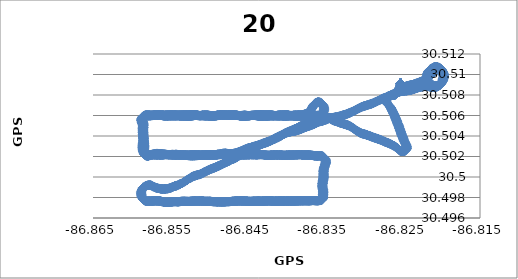
| Category | GPS Long |
|---|---|
| -86.825264 | 30.509 |
| -86.825264 | 30.509 |
| -86.825264 | 30.509 |
| -86.825264 | 30.509 |
| -86.825264 | 30.509 |
| -86.825264 | 30.509 |
| -86.825264 | 30.509 |
| -86.825264 | 30.509 |
| -86.825264 | 30.509 |
| -86.825264 | 30.509 |
| -86.825264 | 30.509 |
| -86.825264 | 30.509 |
| -86.825264 | 30.509 |
| -86.825264 | 30.509 |
| -86.825264 | 30.509 |
| -86.825264 | 30.509 |
| -86.825264 | 30.509 |
| -86.825264 | 30.509 |
| -86.825264 | 30.509 |
| -86.825264 | 30.509 |
| -86.825264 | 30.509 |
| -86.825264 | 30.509 |
| -86.825264 | 30.509 |
| -86.825264 | 30.509 |
| -86.825264 | 30.509 |
| -86.825264 | 30.509 |
| -86.825264 | 30.509 |
| -86.825264 | 30.509 |
| -86.825264 | 30.509 |
| -86.825264 | 30.509 |
| -86.825264 | 30.509 |
| -86.825264 | 30.509 |
| -86.825264 | 30.509 |
| -86.825264 | 30.509 |
| -86.825264 | 30.509 |
| -86.825264 | 30.509 |
| -86.825264 | 30.509 |
| -86.825264 | 30.509 |
| -86.825264 | 30.509 |
| -86.825264 | 30.509 |
| -86.825264 | 30.509 |
| -86.825264 | 30.509 |
| -86.825264 | 30.509 |
| -86.825264 | 30.509 |
| -86.825264 | 30.509 |
| -86.825264 | 30.509 |
| -86.825264 | 30.509 |
| -86.825264 | 30.509 |
| -86.825264 | 30.509 |
| -86.825264 | 30.509 |
| -86.825264 | 30.509 |
| -86.825264 | 30.509 |
| -86.825264 | 30.509 |
| -86.825264 | 30.509 |
| -86.825264 | 30.509 |
| -86.825264 | 30.509 |
| -86.825264 | 30.509 |
| -86.825264 | 30.509 |
| -86.825264 | 30.509 |
| -86.825264 | 30.509 |
| -86.825264 | 30.509 |
| -86.825264 | 30.509 |
| -86.825264 | 30.509 |
| -86.825264 | 30.509 |
| -86.825264 | 30.509 |
| -86.825264 | 30.509 |
| -86.825264 | 30.509 |
| -86.825264 | 30.509 |
| -86.825264 | 30.509 |
| -86.825264 | 30.509 |
| -86.825264 | 30.509 |
| -86.825264 | 30.509 |
| -86.825264 | 30.509 |
| -86.825264 | 30.509 |
| -86.825264 | 30.509 |
| -86.825264 | 30.509 |
| -86.825264 | 30.509 |
| -86.825264 | 30.509 |
| -86.825264 | 30.509 |
| -86.825264 | 30.509 |
| -86.825264 | 30.509 |
| -86.825264 | 30.509 |
| -86.825264 | 30.509 |
| -86.825279 | 30.509 |
| -86.825279 | 30.509 |
| -86.825279 | 30.509 |
| -86.825279 | 30.509 |
| -86.825279 | 30.509 |
| -86.825279 | 30.509 |
| -86.825279 | 30.509 |
| -86.825279 | 30.509 |
| -86.825279 | 30.509 |
| -86.825264 | 30.509 |
| -86.825264 | 30.509 |
| -86.825264 | 30.509 |
| -86.825264 | 30.509 |
| -86.825264 | 30.509 |
| -86.825264 | 30.509 |
| -86.825264 | 30.509 |
| -86.825264 | 30.509 |
| -86.825264 | 30.509 |
| -86.825264 | 30.509 |
| -86.825264 | 30.509 |
| -86.825264 | 30.509 |
| -86.825264 | 30.509 |
| -86.825264 | 30.509 |
| -86.825264 | 30.509 |
| -86.825264 | 30.509 |
| -86.825264 | 30.509 |
| -86.825264 | 30.509 |
| -86.825264 | 30.509 |
| -86.825264 | 30.509 |
| -86.825264 | 30.509 |
| -86.825264 | 30.509 |
| -86.825264 | 30.509 |
| -86.825264 | 30.509 |
| -86.825264 | 30.509 |
| -86.825264 | 30.509 |
| -86.825264 | 30.509 |
| -86.825264 | 30.509 |
| -86.825264 | 30.509 |
| -86.825264 | 30.509 |
| -86.825264 | 30.509 |
| -86.825264 | 30.509 |
| -86.825264 | 30.509 |
| -86.825264 | 30.509 |
| -86.825264 | 30.509 |
| -86.825264 | 30.509 |
| -86.825264 | 30.509 |
| -86.825264 | 30.509 |
| -86.825264 | 30.509 |
| -86.825264 | 30.509 |
| -86.825264 | 30.509 |
| -86.825264 | 30.509 |
| -86.825264 | 30.509 |
| -86.825264 | 30.509 |
| -86.825264 | 30.509 |
| -86.825264 | 30.509 |
| -86.825264 | 30.509 |
| -86.825264 | 30.509 |
| -86.825264 | 30.509 |
| -86.825264 | 30.509 |
| -86.825264 | 30.509 |
| -86.825264 | 30.509 |
| -86.825264 | 30.509 |
| -86.825264 | 30.509 |
| -86.825264 | 30.509 |
| -86.825264 | 30.509 |
| -86.825264 | 30.509 |
| -86.825264 | 30.509 |
| -86.825264 | 30.509 |
| -86.825264 | 30.509 |
| -86.825264 | 30.509 |
| -86.825264 | 30.509 |
| -86.825264 | 30.509 |
| -86.825264 | 30.509 |
| -86.825264 | 30.509 |
| -86.825264 | 30.509 |
| -86.825264 | 30.509 |
| -86.825264 | 30.509 |
| -86.825264 | 30.509 |
| -86.825264 | 30.509 |
| -86.825264 | 30.509 |
| -86.825264 | 30.509 |
| -86.825264 | 30.509 |
| -86.825264 | 30.509 |
| -86.825264 | 30.509 |
| -86.825264 | 30.509 |
| -86.825264 | 30.509 |
| -86.825264 | 30.509 |
| -86.825264 | 30.509 |
| -86.825264 | 30.509 |
| -86.825264 | 30.509 |
| -86.825264 | 30.509 |
| -86.825264 | 30.509 |
| -86.825264 | 30.509 |
| -86.825264 | 30.509 |
| -86.825264 | 30.509 |
| -86.825264 | 30.509 |
| -86.825264 | 30.509 |
| -86.825264 | 30.509 |
| -86.825264 | 30.509 |
| -86.825264 | 30.509 |
| -86.825264 | 30.509 |
| -86.825264 | 30.509 |
| -86.825264 | 30.509 |
| -86.825264 | 30.509 |
| -86.825249 | 30.509 |
| -86.825249 | 30.509 |
| -86.825249 | 30.509 |
| -86.825249 | 30.509 |
| -86.825249 | 30.509 |
| -86.825249 | 30.509 |
| -86.825249 | 30.509 |
| -86.825249 | 30.509 |
| -86.825249 | 30.509 |
| -86.825249 | 30.509 |
| -86.825249 | 30.509 |
| -86.825249 | 30.509 |
| -86.825249 | 30.509 |
| -86.825249 | 30.509 |
| -86.825249 | 30.509 |
| -86.825249 | 30.509 |
| -86.825249 | 30.509 |
| -86.825249 | 30.509 |
| -86.825249 | 30.509 |
| -86.825249 | 30.509 |
| -86.825249 | 30.509 |
| -86.825249 | 30.509 |
| -86.825249 | 30.509 |
| -86.825249 | 30.509 |
| -86.825249 | 30.509 |
| -86.825249 | 30.509 |
| -86.825249 | 30.509 |
| -86.825249 | 30.509 |
| -86.825249 | 30.509 |
| -86.825249 | 30.509 |
| -86.825249 | 30.509 |
| -86.825249 | 30.509 |
| -86.825249 | 30.509 |
| -86.825249 | 30.509 |
| -86.825249 | 30.509 |
| -86.825249 | 30.509 |
| -86.825249 | 30.509 |
| -86.825249 | 30.509 |
| -86.825249 | 30.509 |
| -86.825249 | 30.509 |
| -86.825249 | 30.509 |
| -86.825249 | 30.509 |
| -86.825249 | 30.509 |
| -86.825249 | 30.509 |
| -86.825249 | 30.509 |
| -86.825249 | 30.509 |
| -86.825249 | 30.509 |
| -86.825249 | 30.509 |
| -86.825249 | 30.509 |
| -86.825249 | 30.509 |
| -86.825249 | 30.509 |
| -86.825249 | 30.509 |
| -86.825249 | 30.509 |
| -86.825249 | 30.509 |
| -86.825249 | 30.509 |
| -86.825249 | 30.509 |
| -86.825249 | 30.509 |
| -86.825249 | 30.509 |
| -86.825249 | 30.509 |
| -86.825249 | 30.509 |
| -86.825249 | 30.509 |
| -86.825249 | 30.509 |
| -86.825279 | 30.509 |
| -86.825279 | 30.509 |
| -86.825279 | 30.509 |
| -86.825294 | 30.509 |
| -86.825294 | 30.509 |
| -86.825294 | 30.509 |
| -86.825325 | 30.509 |
| -86.825325 | 30.509 |
| -86.825356 | 30.509 |
| -86.825356 | 30.509 |
| -86.825386 | 30.509 |
| -86.825386 | 30.509 |
| -86.825417 | 30.509 |
| -86.825417 | 30.509 |
| -86.825447 | 30.509 |
| -86.825455 | 30.509 |
| -86.825493 | 30.509 |
| -86.825493 | 30.509 |
| -86.825523 | 30.508 |
| -86.825523 | 30.508 |
| -86.825569 | 30.508 |
| -86.825569 | 30.508 |
| -86.825569 | 30.508 |
| -86.825623 | 30.508 |
| -86.825623 | 30.508 |
| -86.825668 | 30.508 |
| -86.825668 | 30.508 |
| -86.825699 | 30.508 |
| -86.825699 | 30.508 |
| -86.825745 | 30.508 |
| -86.825745 | 30.508 |
| -86.825798 | 30.508 |
| -86.825798 | 30.508 |
| -86.825844 | 30.508 |
| -86.825844 | 30.508 |
| -86.825874 | 30.508 |
| -86.825874 | 30.508 |
| -86.825928 | 30.508 |
| -86.825928 | 30.508 |
| -86.825981 | 30.508 |
| -86.825981 | 30.508 |
| -86.826035 | 30.508 |
| -86.826035 | 30.508 |
| -86.826096 | 30.508 |
| -86.826096 | 30.508 |
| -86.826157 | 30.508 |
| -86.826157 | 30.508 |
| -86.826233 | 30.508 |
| -86.826233 | 30.508 |
| -86.826363 | 30.508 |
| -86.826363 | 30.508 |
| -86.826393 | 30.508 |
| -86.826393 | 30.508 |
| -86.826454 | 30.508 |
| -86.826454 | 30.508 |
| -86.826546 | 30.508 |
| -86.826576 | 30.508 |
| -86.826576 | 30.508 |
| -86.826607 | 30.508 |
| -86.826714 | 30.508 |
| -86.826714 | 30.508 |
| -86.826775 | 30.508 |
| -86.826782 | 30.508 |
| -86.826836 | 30.508 |
| -86.826836 | 30.508 |
| -86.826881 | 30.508 |
| -86.826889 | 30.508 |
| -86.826927 | 30.508 |
| -86.826927 | 30.508 |
| -86.826958 | 30.508 |
| -86.826958 | 30.508 |
| -86.826958 | 30.508 |
| -86.826988 | 30.508 |
| -86.826988 | 30.508 |
| -86.827019 | 30.508 |
| -86.827019 | 30.508 |
| -86.827049 | 30.508 |
| -86.827049 | 30.508 |
| -86.82708 | 30.508 |
| -86.82708 | 30.508 |
| -86.827095 | 30.508 |
| -86.827095 | 30.508 |
| -86.82711 | 30.507 |
| -86.82711 | 30.507 |
| -86.82711 | 30.507 |
| -86.82711 | 30.507 |
| -86.827095 | 30.507 |
| -86.827095 | 30.507 |
| -86.827065 | 30.507 |
| -86.827065 | 30.507 |
| -86.827011 | 30.507 |
| -86.827011 | 30.507 |
| -86.826973 | 30.507 |
| -86.826973 | 30.507 |
| -86.826912 | 30.507 |
| -86.826912 | 30.507 |
| -86.826859 | 30.507 |
| -86.826859 | 30.507 |
| -86.82679 | 30.507 |
| -86.82679 | 30.507 |
| -86.826729 | 30.507 |
| -86.826729 | 30.507 |
| -86.826729 | 30.507 |
| -86.826683 | 30.507 |
| -86.826637 | 30.507 |
| -86.826637 | 30.507 |
| -86.826637 | 30.507 |
| -86.826591 | 30.507 |
| -86.826546 | 30.507 |
| -86.826546 | 30.507 |
| -86.826546 | 30.507 |
| -86.826515 | 30.507 |
| -86.826515 | 30.507 |
| -86.826515 | 30.507 |
| -86.826469 | 30.507 |
| -86.826469 | 30.507 |
| -86.826439 | 30.507 |
| -86.826439 | 30.507 |
| -86.826408 | 30.507 |
| -86.826408 | 30.507 |
| -86.826363 | 30.506 |
| -86.826363 | 30.506 |
| -86.826332 | 30.506 |
| -86.826332 | 30.506 |
| -86.826332 | 30.506 |
| -86.826294 | 30.506 |
| -86.826294 | 30.506 |
| -86.826256 | 30.506 |
| -86.826256 | 30.506 |
| -86.826225 | 30.506 |
| -86.826225 | 30.506 |
| -86.826195 | 30.506 |
| -86.826195 | 30.506 |
| -86.826195 | 30.506 |
| -86.826164 | 30.506 |
| -86.826164 | 30.506 |
| -86.826118 | 30.506 |
| -86.826118 | 30.506 |
| -86.826088 | 30.506 |
| -86.826088 | 30.506 |
| -86.826057 | 30.506 |
| -86.826057 | 30.506 |
| -86.826027 | 30.506 |
| -86.826027 | 30.506 |
| -86.825996 | 30.506 |
| -86.825996 | 30.506 |
| -86.825966 | 30.506 |
| -86.825966 | 30.506 |
| -86.825935 | 30.506 |
| -86.825935 | 30.506 |
| -86.82592 | 30.506 |
| -86.82592 | 30.506 |
| -86.82589 | 30.506 |
| -86.82589 | 30.506 |
| -86.825859 | 30.506 |
| -86.825859 | 30.506 |
| -86.825829 | 30.506 |
| -86.825829 | 30.506 |
| -86.825798 | 30.506 |
| -86.825798 | 30.506 |
| -86.825768 | 30.505 |
| -86.825768 | 30.505 |
| -86.825752 | 30.505 |
| -86.825752 | 30.505 |
| -86.825722 | 30.505 |
| -86.825722 | 30.505 |
| -86.825706 | 30.505 |
| -86.825706 | 30.505 |
| -86.825676 | 30.505 |
| -86.825676 | 30.505 |
| -86.825645 | 30.505 |
| -86.825645 | 30.505 |
| -86.8256 | 30.505 |
| -86.8256 | 30.505 |
| -86.8256 | 30.505 |
| -86.825569 | 30.505 |
| -86.825569 | 30.505 |
| -86.825569 | 30.505 |
| -86.825539 | 30.505 |
| -86.825539 | 30.505 |
| -86.825523 | 30.505 |
| -86.825523 | 30.505 |
| -86.825493 | 30.505 |
| -86.825493 | 30.505 |
| -86.825462 | 30.505 |
| -86.825462 | 30.505 |
| -86.825447 | 30.505 |
| -86.825447 | 30.505 |
| -86.825417 | 30.505 |
| -86.825417 | 30.505 |
| -86.825417 | 30.505 |
| -86.825417 | 30.505 |
| -86.825401 | 30.505 |
| -86.825401 | 30.505 |
| -86.825371 | 30.505 |
| -86.825371 | 30.505 |
| -86.82534 | 30.505 |
| -86.82534 | 30.505 |
| -86.825325 | 30.505 |
| -86.825325 | 30.505 |
| -86.825294 | 30.505 |
| -86.825294 | 30.505 |
| -86.825264 | 30.504 |
| -86.825264 | 30.504 |
| -86.825249 | 30.504 |
| -86.825249 | 30.504 |
| -86.825249 | 30.504 |
| -86.825218 | 30.504 |
| -86.825218 | 30.504 |
| -86.825172 | 30.504 |
| -86.825172 | 30.504 |
| -86.825172 | 30.504 |
| -86.825172 | 30.504 |
| -86.825157 | 30.504 |
| -86.825157 | 30.504 |
| -86.825127 | 30.504 |
| -86.825127 | 30.504 |
| -86.825096 | 30.504 |
| -86.825096 | 30.504 |
| -86.825081 | 30.504 |
| -86.825081 | 30.504 |
| -86.82505 | 30.504 |
| -86.82505 | 30.504 |
| -86.825005 | 30.504 |
| -86.825005 | 30.504 |
| -86.825005 | 30.504 |
| -86.825005 | 30.504 |
| -86.824974 | 30.504 |
| -86.824974 | 30.504 |
| -86.824959 | 30.504 |
| -86.824959 | 30.504 |
| -86.824928 | 30.504 |
| -86.824928 | 30.504 |
| -86.824898 | 30.504 |
| -86.824898 | 30.504 |
| -86.824883 | 30.504 |
| -86.824883 | 30.504 |
| -86.824852 | 30.504 |
| -86.824852 | 30.504 |
| -86.824821 | 30.504 |
| -86.824821 | 30.504 |
| -86.824791 | 30.504 |
| -86.82476 | 30.503 |
| -86.82476 | 30.503 |
| -86.82473 | 30.503 |
| -86.82473 | 30.503 |
| -86.824699 | 30.503 |
| -86.824699 | 30.503 |
| -86.824654 | 30.503 |
| -86.824654 | 30.503 |
| -86.824623 | 30.503 |
| -86.824623 | 30.503 |
| -86.824593 | 30.503 |
| -86.824593 | 30.503 |
| -86.824562 | 30.503 |
| -86.824562 | 30.503 |
| -86.824532 | 30.503 |
| -86.824532 | 30.503 |
| -86.824516 | 30.503 |
| -86.824501 | 30.503 |
| -86.824501 | 30.503 |
| -86.824501 | 30.503 |
| -86.824501 | 30.503 |
| -86.824501 | 30.503 |
| -86.824486 | 30.503 |
| -86.824486 | 30.503 |
| -86.824486 | 30.503 |
| -86.824486 | 30.503 |
| -86.824501 | 30.503 |
| -86.824501 | 30.503 |
| -86.824501 | 30.503 |
| -86.824501 | 30.503 |
| -86.824539 | 30.503 |
| -86.824539 | 30.503 |
| -86.82457 | 30.503 |
| -86.824615 | 30.503 |
| -86.824615 | 30.503 |
| -86.824669 | 30.503 |
| -86.824669 | 30.503 |
| -86.824738 | 30.503 |
| -86.824738 | 30.503 |
| -86.824791 | 30.503 |
| -86.824791 | 30.503 |
| -86.824791 | 30.503 |
| -86.824883 | 30.502 |
| -86.82489 | 30.502 |
| -86.824951 | 30.502 |
| -86.824951 | 30.502 |
| -86.825027 | 30.502 |
| -86.825027 | 30.502 |
| -86.825027 | 30.502 |
| -86.825089 | 30.502 |
| -86.825218 | 30.503 |
| -86.825218 | 30.503 |
| -86.825249 | 30.503 |
| -86.825249 | 30.503 |
| -86.825348 | 30.503 |
| -86.825348 | 30.503 |
| -86.825401 | 30.503 |
| -86.825401 | 30.503 |
| -86.825478 | 30.503 |
| -86.825478 | 30.503 |
| -86.825539 | 30.503 |
| -86.825539 | 30.503 |
| -86.825539 | 30.503 |
| -86.825645 | 30.503 |
| -86.825653 | 30.503 |
| -86.825722 | 30.503 |
| -86.825798 | 30.503 |
| -86.825798 | 30.503 |
| -86.825798 | 30.503 |
| -86.825874 | 30.503 |
| -86.825882 | 30.503 |
| -86.825958 | 30.503 |
| -86.825958 | 30.503 |
| -86.825958 | 30.503 |
| -86.826042 | 30.503 |
| -86.826042 | 30.503 |
| -86.826111 | 30.503 |
| -86.826111 | 30.503 |
| -86.826202 | 30.503 |
| -86.826202 | 30.503 |
| -86.826294 | 30.503 |
| -86.826363 | 30.503 |
| -86.826363 | 30.503 |
| -86.826454 | 30.503 |
| -86.826454 | 30.503 |
| -86.82653 | 30.503 |
| -86.82653 | 30.503 |
| -86.826645 | 30.503 |
| -86.826645 | 30.503 |
| -86.826721 | 30.503 |
| -86.826721 | 30.503 |
| -86.826797 | 30.503 |
| -86.826797 | 30.503 |
| -86.826889 | 30.503 |
| -86.826897 | 30.503 |
| -86.826965 | 30.503 |
| -86.826965 | 30.503 |
| -86.82708 | 30.503 |
| -86.82708 | 30.503 |
| -86.827156 | 30.503 |
| -86.827156 | 30.503 |
| -86.827232 | 30.503 |
| -86.827232 | 30.503 |
| -86.827232 | 30.503 |
| -86.827309 | 30.503 |
| -86.827309 | 30.503 |
| -86.827309 | 30.503 |
| -86.827408 | 30.503 |
| -86.827408 | 30.503 |
| -86.827461 | 30.503 |
| -86.82756 | 30.504 |
| -86.82756 | 30.504 |
| -86.827652 | 30.504 |
| -86.827652 | 30.504 |
| -86.827728 | 30.504 |
| -86.827728 | 30.504 |
| -86.827805 | 30.504 |
| -86.827805 | 30.504 |
| -86.827919 | 30.504 |
| -86.827919 | 30.504 |
| -86.827972 | 30.504 |
| -86.827972 | 30.504 |
| -86.828087 | 30.504 |
| -86.828087 | 30.504 |
| -86.828178 | 30.504 |
| -86.828178 | 30.504 |
| -86.828178 | 30.504 |
| -86.82827 | 30.504 |
| -86.82827 | 30.504 |
| -86.828384 | 30.504 |
| -86.828384 | 30.504 |
| -86.828476 | 30.504 |
| -86.828476 | 30.504 |
| -86.828568 | 30.504 |
| -86.828568 | 30.504 |
| -86.828659 | 30.504 |
| -86.828667 | 30.504 |
| -86.828758 | 30.504 |
| -86.828758 | 30.504 |
| -86.82885 | 30.504 |
| -86.82885 | 30.504 |
| -86.828941 | 30.504 |
| -86.828941 | 30.504 |
| -86.829018 | 30.504 |
| -86.829018 | 30.504 |
| -86.829018 | 30.504 |
| -86.829109 | 30.504 |
| -86.829132 | 30.504 |
| -86.829185 | 30.504 |
| -86.829185 | 30.504 |
| -86.829262 | 30.504 |
| -86.829262 | 30.504 |
| -86.829338 | 30.504 |
| -86.829338 | 30.504 |
| -86.829414 | 30.504 |
| -86.829414 | 30.504 |
| -86.829506 | 30.504 |
| -86.829582 | 30.504 |
| -86.829582 | 30.504 |
| -86.829605 | 30.504 |
| -86.829605 | 30.504 |
| -86.829659 | 30.504 |
| -86.829659 | 30.504 |
| -86.829742 | 30.504 |
| -86.829742 | 30.504 |
| -86.829826 | 30.504 |
| -86.829826 | 30.504 |
| -86.82991 | 30.504 |
| -86.82991 | 30.504 |
| -86.829987 | 30.504 |
| -86.829987 | 30.504 |
| -86.830063 | 30.504 |
| -86.830063 | 30.504 |
| -86.830139 | 30.504 |
| -86.830139 | 30.504 |
| -86.830208 | 30.504 |
| -86.830208 | 30.504 |
| -86.830208 | 30.504 |
| -86.830292 | 30.504 |
| -86.83036 | 30.504 |
| -86.83036 | 30.504 |
| -86.83036 | 30.504 |
| -86.830444 | 30.504 |
| -86.830444 | 30.504 |
| -86.830521 | 30.504 |
| -86.830521 | 30.504 |
| -86.830566 | 30.504 |
| -86.830566 | 30.504 |
| -86.830635 | 30.504 |
| -86.830635 | 30.504 |
| -86.830696 | 30.504 |
| -86.830696 | 30.504 |
| -86.830757 | 30.504 |
| -86.830788 | 30.504 |
| -86.830818 | 30.504 |
| -86.830818 | 30.504 |
| -86.830879 | 30.504 |
| -86.830879 | 30.504 |
| -86.830879 | 30.504 |
| -86.83094 | 30.505 |
| -86.830971 | 30.505 |
| -86.831001 | 30.505 |
| -86.831001 | 30.505 |
| -86.831078 | 30.505 |
| -86.831078 | 30.505 |
| -86.831123 | 30.505 |
| -86.831131 | 30.505 |
| -86.831184 | 30.505 |
| -86.831184 | 30.505 |
| -86.831184 | 30.505 |
| -86.831261 | 30.505 |
| -86.831261 | 30.505 |
| -86.831314 | 30.505 |
| -86.831314 | 30.505 |
| -86.831375 | 30.505 |
| -86.831375 | 30.505 |
| -86.831444 | 30.505 |
| -86.831444 | 30.505 |
| -86.831505 | 30.505 |
| -86.831505 | 30.505 |
| -86.831573 | 30.505 |
| -86.831573 | 30.505 |
| -86.831635 | 30.505 |
| -86.831635 | 30.505 |
| -86.831696 | 30.505 |
| -86.831696 | 30.505 |
| -86.831757 | 30.505 |
| -86.831757 | 30.505 |
| -86.831825 | 30.505 |
| -86.831825 | 30.505 |
| -86.831886 | 30.505 |
| -86.831886 | 30.505 |
| -86.831947 | 30.505 |
| -86.831947 | 30.505 |
| -86.832039 | 30.505 |
| -86.832039 | 30.505 |
| -86.832085 | 30.505 |
| -86.83213 | 30.505 |
| -86.832161 | 30.505 |
| -86.832161 | 30.505 |
| -86.832222 | 30.505 |
| -86.832222 | 30.505 |
| -86.832298 | 30.505 |
| -86.832298 | 30.505 |
| -86.832375 | 30.505 |
| -86.832375 | 30.505 |
| -86.832375 | 30.505 |
| -86.832375 | 30.505 |
| -86.832466 | 30.505 |
| -86.832466 | 30.505 |
| -86.832542 | 30.505 |
| -86.832542 | 30.505 |
| -86.832603 | 30.505 |
| -86.832603 | 30.505 |
| -86.83268 | 30.505 |
| -86.83268 | 30.505 |
| -86.832756 | 30.505 |
| -86.832764 | 30.505 |
| -86.832817 | 30.505 |
| -86.832817 | 30.505 |
| -86.832817 | 30.505 |
| -86.832901 | 30.505 |
| -86.832901 | 30.505 |
| -86.832901 | 30.505 |
| -86.832962 | 30.505 |
| -86.832962 | 30.505 |
| -86.833038 | 30.505 |
| -86.833038 | 30.505 |
| -86.833099 | 30.505 |
| -86.833099 | 30.505 |
| -86.833191 | 30.505 |
| -86.833191 | 30.505 |
| -86.833244 | 30.505 |
| -86.833244 | 30.505 |
| -86.833321 | 30.505 |
| -86.833321 | 30.505 |
| -86.833405 | 30.505 |
| -86.833466 | 30.505 |
| -86.833466 | 30.505 |
| -86.833488 | 30.505 |
| -86.833488 | 30.505 |
| -86.833542 | 30.505 |
| -86.833542 | 30.505 |
| -86.833633 | 30.505 |
| -86.833633 | 30.505 |
| -86.833733 | 30.505 |
| -86.833733 | 30.505 |
| -86.833778 | 30.505 |
| -86.833778 | 30.505 |
| -86.833885 | 30.506 |
| -86.833885 | 30.506 |
| -86.833885 | 30.506 |
| -86.833946 | 30.506 |
| -86.833946 | 30.506 |
| -86.834023 | 30.506 |
| -86.834023 | 30.506 |
| -86.834084 | 30.506 |
| -86.834091 | 30.506 |
| -86.834091 | 30.506 |
| -86.834145 | 30.506 |
| -86.834145 | 30.506 |
| -86.834213 | 30.506 |
| -86.834213 | 30.506 |
| -86.834282 | 30.506 |
| -86.834282 | 30.506 |
| -86.834358 | 30.506 |
| -86.834358 | 30.506 |
| -86.834435 | 30.506 |
| -86.834435 | 30.506 |
| -86.834518 | 30.506 |
| -86.834579 | 30.506 |
| -86.834579 | 30.506 |
| -86.834579 | 30.506 |
| -86.834579 | 30.506 |
| -86.834709 | 30.506 |
| -86.834709 | 30.506 |
| -86.83474 | 30.506 |
| -86.83474 | 30.506 |
| -86.834816 | 30.506 |
| -86.834816 | 30.506 |
| -86.834892 | 30.506 |
| -86.834892 | 30.506 |
| -86.835007 | 30.506 |
| -86.835007 | 30.506 |
| -86.835075 | 30.506 |
| -86.835075 | 30.506 |
| -86.835152 | 30.506 |
| -86.835152 | 30.506 |
| -86.835228 | 30.506 |
| -86.835228 | 30.506 |
| -86.835304 | 30.506 |
| -86.835304 | 30.506 |
| -86.835381 | 30.506 |
| -86.835381 | 30.506 |
| -86.835457 | 30.506 |
| -86.835457 | 30.506 |
| -86.835457 | 30.506 |
| -86.835518 | 30.506 |
| -86.835518 | 30.506 |
| -86.835594 | 30.506 |
| -86.835594 | 30.506 |
| -86.83567 | 30.506 |
| -86.835732 | 30.506 |
| -86.835732 | 30.506 |
| -86.835732 | 30.506 |
| -86.835732 | 30.506 |
| -86.835815 | 30.506 |
| -86.835815 | 30.506 |
| -86.835892 | 30.506 |
| -86.835892 | 30.506 |
| -86.835968 | 30.506 |
| -86.835968 | 30.506 |
| -86.836044 | 30.506 |
| -86.836044 | 30.506 |
| -86.836105 | 30.506 |
| -86.836105 | 30.506 |
| -86.836182 | 30.506 |
| -86.836182 | 30.506 |
| -86.836273 | 30.506 |
| -86.836327 | 30.506 |
| -86.836327 | 30.506 |
| -86.836403 | 30.506 |
| -86.836403 | 30.506 |
| -86.836472 | 30.506 |
| -86.836472 | 30.506 |
| -86.83654 | 30.506 |
| -86.83654 | 30.506 |
| -86.836617 | 30.506 |
| -86.836617 | 30.506 |
| -86.836617 | 30.506 |
| -86.836617 | 30.506 |
| -86.836731 | 30.506 |
| -86.836731 | 30.506 |
| -86.836784 | 30.506 |
| -86.836784 | 30.506 |
| -86.836853 | 30.506 |
| -86.836853 | 30.506 |
| -86.836937 | 30.506 |
| -86.836937 | 30.506 |
| -86.837013 | 30.506 |
| -86.837021 | 30.506 |
| -86.83709 | 30.506 |
| -86.83709 | 30.506 |
| -86.837166 | 30.506 |
| -86.837166 | 30.506 |
| -86.837166 | 30.506 |
| -86.83725 | 30.506 |
| -86.83725 | 30.506 |
| -86.837364 | 30.506 |
| -86.837364 | 30.506 |
| -86.837509 | 30.506 |
| -86.837509 | 30.506 |
| -86.837608 | 30.506 |
| -86.837608 | 30.506 |
| -86.837685 | 30.506 |
| -86.837685 | 30.506 |
| -86.837761 | 30.506 |
| -86.837761 | 30.506 |
| -86.837852 | 30.506 |
| -86.837852 | 30.506 |
| -86.837914 | 30.506 |
| -86.837914 | 30.506 |
| -86.837982 | 30.506 |
| -86.837982 | 30.506 |
| -86.838051 | 30.506 |
| -86.838051 | 30.506 |
| -86.838112 | 30.506 |
| -86.838112 | 30.506 |
| -86.838188 | 30.506 |
| -86.838188 | 30.506 |
| -86.838264 | 30.506 |
| -86.838264 | 30.506 |
| -86.838333 | 30.506 |
| -86.838333 | 30.506 |
| -86.838402 | 30.506 |
| -86.838402 | 30.506 |
| -86.83847 | 30.506 |
| -86.83847 | 30.506 |
| -86.838531 | 30.506 |
| -86.838531 | 30.506 |
| -86.838593 | 30.506 |
| -86.838593 | 30.506 |
| -86.838661 | 30.506 |
| -86.838661 | 30.506 |
| -86.83873 | 30.506 |
| -86.83873 | 30.506 |
| -86.838844 | 30.506 |
| -86.838844 | 30.506 |
| -86.838875 | 30.506 |
| -86.838875 | 30.506 |
| -86.838951 | 30.506 |
| -86.838951 | 30.506 |
| -86.838997 | 30.506 |
| -86.838997 | 30.506 |
| -86.839073 | 30.506 |
| -86.839073 | 30.506 |
| -86.839134 | 30.506 |
| -86.839134 | 30.506 |
| -86.839211 | 30.506 |
| -86.839211 | 30.506 |
| -86.839294 | 30.506 |
| -86.839294 | 30.506 |
| -86.839371 | 30.506 |
| -86.839378 | 30.506 |
| -86.839378 | 30.506 |
| -86.839447 | 30.506 |
| -86.839447 | 30.506 |
| -86.839523 | 30.506 |
| -86.839523 | 30.506 |
| -86.8396 | 30.506 |
| -86.8396 | 30.506 |
| -86.839661 | 30.506 |
| -86.839661 | 30.506 |
| -86.839752 | 30.506 |
| -86.839752 | 30.506 |
| -86.839836 | 30.506 |
| -86.839836 | 30.506 |
| -86.839935 | 30.506 |
| -86.839935 | 30.506 |
| -86.839996 | 30.506 |
| -86.839996 | 30.506 |
| -86.840073 | 30.506 |
| -86.840073 | 30.506 |
| -86.840149 | 30.506 |
| -86.840149 | 30.506 |
| -86.840263 | 30.506 |
| -86.840263 | 30.506 |
| -86.840355 | 30.506 |
| -86.840355 | 30.506 |
| -86.840416 | 30.506 |
| -86.840416 | 30.506 |
| -86.840416 | 30.506 |
| -86.840477 | 30.506 |
| -86.840523 | 30.506 |
| -86.840523 | 30.506 |
| -86.840523 | 30.506 |
| -86.84063 | 30.506 |
| -86.840637 | 30.506 |
| -86.840706 | 30.506 |
| -86.840706 | 30.506 |
| -86.840782 | 30.506 |
| -86.840782 | 30.506 |
| -86.840858 | 30.506 |
| -86.840858 | 30.506 |
| -86.840919 | 30.506 |
| -86.840927 | 30.506 |
| -86.840927 | 30.506 |
| -86.841019 | 30.506 |
| -86.841019 | 30.506 |
| -86.841064 | 30.506 |
| -86.841064 | 30.506 |
| -86.841141 | 30.506 |
| -86.841141 | 30.506 |
| -86.841202 | 30.506 |
| -86.841202 | 30.506 |
| -86.841278 | 30.506 |
| -86.841278 | 30.506 |
| -86.841339 | 30.506 |
| -86.841339 | 30.506 |
| -86.8414 | 30.506 |
| -86.8414 | 30.506 |
| -86.841469 | 30.506 |
| -86.841469 | 30.506 |
| -86.841553 | 30.506 |
| -86.841553 | 30.506 |
| -86.841606 | 30.506 |
| -86.841606 | 30.506 |
| -86.841682 | 30.506 |
| -86.841682 | 30.506 |
| -86.841743 | 30.506 |
| -86.841743 | 30.506 |
| -86.841827 | 30.506 |
| -86.841827 | 30.506 |
| -86.841904 | 30.506 |
| -86.841904 | 30.506 |
| -86.841965 | 30.506 |
| -86.841965 | 30.506 |
| -86.842041 | 30.506 |
| -86.842041 | 30.506 |
| -86.842117 | 30.506 |
| -86.842117 | 30.506 |
| -86.842201 | 30.506 |
| -86.842201 | 30.506 |
| -86.842255 | 30.506 |
| -86.842255 | 30.506 |
| -86.842339 | 30.506 |
| -86.842339 | 30.506 |
| -86.8424 | 30.506 |
| -86.8424 | 30.506 |
| -86.842491 | 30.506 |
| -86.842491 | 30.506 |
| -86.842537 | 30.506 |
| -86.842537 | 30.506 |
| -86.842628 | 30.506 |
| -86.842628 | 30.506 |
| -86.84269 | 30.506 |
| -86.84269 | 30.506 |
| -86.842697 | 30.506 |
| -86.842766 | 30.506 |
| -86.842766 | 30.506 |
| -86.842766 | 30.506 |
| -86.842842 | 30.506 |
| -86.842842 | 30.506 |
| -86.842896 | 30.506 |
| -86.842896 | 30.506 |
| -86.842979 | 30.506 |
| -86.842979 | 30.506 |
| -86.843048 | 30.506 |
| -86.843048 | 30.506 |
| -86.843109 | 30.506 |
| -86.843109 | 30.506 |
| -86.843193 | 30.506 |
| -86.843193 | 30.506 |
| -86.843254 | 30.506 |
| -86.843254 | 30.506 |
| -86.843254 | 30.506 |
| -86.843254 | 30.506 |
| -86.843353 | 30.506 |
| -86.843353 | 30.506 |
| -86.843391 | 30.506 |
| -86.843391 | 30.506 |
| -86.843483 | 30.506 |
| -86.843483 | 30.506 |
| -86.843544 | 30.506 |
| -86.843544 | 30.506 |
| -86.843613 | 30.506 |
| -86.843613 | 30.506 |
| -86.843689 | 30.506 |
| -86.843689 | 30.506 |
| -86.843689 | 30.506 |
| -86.843803 | 30.506 |
| -86.843803 | 30.506 |
| -86.843826 | 30.506 |
| -86.843826 | 30.506 |
| -86.843918 | 30.506 |
| -86.843918 | 30.506 |
| -86.843971 | 30.506 |
| -86.843971 | 30.506 |
| -86.844063 | 30.506 |
| -86.844063 | 30.506 |
| -86.844109 | 30.506 |
| -86.844109 | 30.506 |
| -86.844231 | 30.506 |
| -86.844231 | 30.506 |
| -86.844307 | 30.506 |
| -86.844307 | 30.506 |
| -86.844398 | 30.506 |
| -86.844421 | 30.506 |
| -86.844475 | 30.506 |
| -86.844475 | 30.506 |
| -86.844551 | 30.506 |
| -86.844551 | 30.506 |
| -86.844574 | 30.506 |
| -86.844574 | 30.506 |
| -86.844627 | 30.506 |
| -86.844704 | 30.506 |
| -86.844704 | 30.506 |
| -86.844704 | 30.506 |
| -86.844803 | 30.506 |
| -86.844803 | 30.506 |
| -86.844879 | 30.506 |
| -86.844879 | 30.506 |
| -86.844971 | 30.506 |
| -86.844971 | 30.506 |
| -86.845032 | 30.506 |
| -86.845032 | 30.506 |
| -86.845131 | 30.506 |
| -86.845131 | 30.506 |
| -86.845192 | 30.506 |
| -86.845192 | 30.506 |
| -86.845268 | 30.506 |
| -86.845268 | 30.506 |
| -86.845329 | 30.506 |
| -86.845329 | 30.506 |
| -86.845406 | 30.506 |
| -86.845406 | 30.506 |
| -86.845482 | 30.506 |
| -86.845482 | 30.506 |
| -86.845551 | 30.506 |
| -86.845551 | 30.506 |
| -86.845612 | 30.506 |
| -86.845612 | 30.506 |
| -86.845688 | 30.506 |
| -86.845688 | 30.506 |
| -86.845749 | 30.506 |
| -86.845749 | 30.506 |
| -86.845825 | 30.506 |
| -86.845825 | 30.506 |
| -86.845894 | 30.506 |
| -86.845894 | 30.506 |
| -86.84597 | 30.506 |
| -86.84597 | 30.506 |
| -86.846031 | 30.506 |
| -86.846031 | 30.506 |
| -86.846107 | 30.506 |
| -86.846107 | 30.506 |
| -86.846214 | 30.506 |
| -86.846214 | 30.506 |
| -86.846291 | 30.506 |
| -86.846291 | 30.506 |
| -86.846352 | 30.506 |
| -86.846352 | 30.506 |
| -86.846352 | 30.506 |
| -86.846428 | 30.506 |
| -86.846451 | 30.506 |
| -86.846451 | 30.506 |
| -86.846504 | 30.506 |
| -86.846504 | 30.506 |
| -86.846581 | 30.506 |
| -86.846581 | 30.506 |
| -86.84668 | 30.506 |
| -86.84668 | 30.506 |
| -86.846733 | 30.506 |
| -86.846733 | 30.506 |
| -86.846825 | 30.506 |
| -86.846825 | 30.506 |
| -86.846909 | 30.506 |
| -86.846909 | 30.506 |
| -86.846909 | 30.506 |
| -86.846977 | 30.506 |
| -86.846977 | 30.506 |
| -86.847076 | 30.506 |
| -86.847076 | 30.506 |
| -86.847137 | 30.506 |
| -86.847137 | 30.506 |
| -86.847137 | 30.506 |
| -86.847221 | 30.506 |
| -86.847221 | 30.506 |
| -86.84729 | 30.506 |
| -86.847359 | 30.506 |
| -86.847366 | 30.506 |
| -86.847427 | 30.506 |
| -86.847427 | 30.506 |
| -86.847427 | 30.506 |
| -86.847511 | 30.506 |
| -86.847511 | 30.506 |
| -86.847572 | 30.506 |
| -86.847572 | 30.506 |
| -86.847649 | 30.506 |
| -86.847649 | 30.506 |
| -86.847725 | 30.506 |
| -86.847725 | 30.506 |
| -86.847801 | 30.506 |
| -86.847801 | 30.506 |
| -86.847862 | 30.506 |
| -86.847862 | 30.506 |
| -86.847939 | 30.506 |
| -86.847939 | 30.506 |
| -86.848045 | 30.506 |
| -86.848045 | 30.506 |
| -86.848114 | 30.506 |
| -86.848114 | 30.506 |
| -86.848228 | 30.506 |
| -86.848228 | 30.506 |
| -86.848297 | 30.506 |
| -86.848297 | 30.506 |
| -86.848396 | 30.506 |
| -86.848381 | 30.506 |
| -86.848457 | 30.506 |
| -86.848457 | 30.506 |
| -86.848518 | 30.506 |
| -86.848518 | 30.506 |
| -86.84861 | 30.506 |
| -86.848656 | 30.506 |
| -86.848656 | 30.506 |
| -86.848656 | 30.506 |
| -86.848763 | 30.506 |
| -86.848839 | 30.506 |
| -86.848839 | 30.506 |
| -86.848915 | 30.506 |
| -86.848915 | 30.506 |
| -86.848915 | 30.506 |
| -86.848991 | 30.506 |
| -86.848991 | 30.506 |
| -86.848991 | 30.506 |
| -86.849075 | 30.506 |
| -86.849075 | 30.506 |
| -86.849152 | 30.506 |
| -86.849152 | 30.506 |
| -86.849213 | 30.506 |
| -86.849213 | 30.506 |
| -86.849289 | 30.506 |
| -86.849289 | 30.506 |
| -86.849373 | 30.506 |
| -86.849373 | 30.506 |
| -86.849449 | 30.506 |
| -86.849449 | 30.506 |
| -86.84951 | 30.506 |
| -86.84951 | 30.506 |
| -86.849586 | 30.506 |
| -86.849586 | 30.506 |
| -86.849648 | 30.506 |
| -86.849648 | 30.506 |
| -86.849648 | 30.506 |
| -86.849648 | 30.506 |
| -86.849739 | 30.506 |
| -86.849739 | 30.506 |
| -86.849823 | 30.506 |
| -86.849823 | 30.506 |
| -86.849869 | 30.506 |
| -86.849869 | 30.506 |
| -86.849953 | 30.506 |
| -86.849953 | 30.506 |
| -86.850014 | 30.506 |
| -86.850014 | 30.506 |
| -86.850075 | 30.506 |
| -86.850075 | 30.506 |
| -86.850151 | 30.506 |
| -86.850151 | 30.506 |
| -86.850151 | 30.506 |
| -86.850243 | 30.506 |
| -86.850319 | 30.506 |
| -86.850319 | 30.506 |
| -86.850395 | 30.506 |
| -86.850395 | 30.506 |
| -86.850403 | 30.506 |
| -86.850456 | 30.506 |
| -86.850456 | 30.506 |
| -86.850456 | 30.506 |
| -86.85054 | 30.506 |
| -86.85054 | 30.506 |
| -86.850601 | 30.506 |
| -86.850601 | 30.506 |
| -86.850685 | 30.506 |
| -86.850685 | 30.506 |
| -86.850754 | 30.506 |
| -86.850754 | 30.506 |
| -86.850822 | 30.506 |
| -86.85083 | 30.506 |
| -86.85083 | 30.506 |
| -86.850883 | 30.506 |
| -86.850883 | 30.506 |
| -86.850945 | 30.506 |
| -86.850945 | 30.506 |
| -86.851021 | 30.506 |
| -86.851021 | 30.506 |
| -86.851089 | 30.506 |
| -86.851089 | 30.506 |
| -86.851151 | 30.506 |
| -86.851151 | 30.506 |
| -86.851212 | 30.506 |
| -86.851212 | 30.506 |
| -86.851288 | 30.506 |
| -86.851288 | 30.506 |
| -86.851402 | 30.506 |
| -86.851402 | 30.506 |
| -86.851479 | 30.506 |
| -86.851479 | 30.506 |
| -86.85154 | 30.506 |
| -86.85154 | 30.506 |
| -86.851616 | 30.506 |
| -86.851616 | 30.506 |
| -86.851692 | 30.506 |
| -86.851692 | 30.506 |
| -86.8517 | 30.506 |
| -86.851768 | 30.506 |
| -86.851768 | 30.506 |
| -86.85183 | 30.506 |
| -86.85183 | 30.506 |
| -86.85183 | 30.506 |
| -86.851921 | 30.506 |
| -86.851921 | 30.506 |
| -86.85199 | 30.506 |
| -86.85199 | 30.506 |
| -86.852066 | 30.506 |
| -86.852066 | 30.506 |
| -86.852158 | 30.506 |
| -86.852158 | 30.506 |
| -86.852219 | 30.506 |
| -86.852219 | 30.506 |
| -86.852295 | 30.506 |
| -86.852295 | 30.506 |
| -86.852379 | 30.506 |
| -86.852379 | 30.506 |
| -86.85247 | 30.506 |
| -86.85247 | 30.506 |
| -86.852524 | 30.506 |
| -86.852524 | 30.506 |
| -86.852592 | 30.506 |
| -86.852592 | 30.506 |
| -86.852699 | 30.506 |
| -86.852699 | 30.506 |
| -86.852737 | 30.506 |
| -86.852737 | 30.506 |
| -86.852852 | 30.506 |
| -86.852852 | 30.506 |
| -86.852928 | 30.506 |
| -86.852928 | 30.506 |
| -86.852928 | 30.506 |
| -86.853004 | 30.506 |
| -86.853004 | 30.506 |
| -86.853073 | 30.506 |
| -86.853073 | 30.506 |
| -86.853149 | 30.506 |
| -86.853157 | 30.506 |
| -86.853226 | 30.506 |
| -86.853226 | 30.506 |
| -86.853302 | 30.506 |
| -86.853302 | 30.506 |
| -86.853302 | 30.506 |
| -86.853363 | 30.506 |
| -86.853363 | 30.506 |
| -86.853447 | 30.506 |
| -86.853447 | 30.506 |
| -86.853523 | 30.506 |
| -86.853523 | 30.506 |
| -86.853615 | 30.506 |
| -86.853615 | 30.506 |
| -86.853661 | 30.506 |
| -86.853661 | 30.506 |
| -86.853752 | 30.506 |
| -86.853752 | 30.506 |
| -86.853821 | 30.506 |
| -86.853821 | 30.506 |
| -86.853882 | 30.506 |
| -86.853882 | 30.506 |
| -86.853958 | 30.506 |
| -86.853958 | 30.506 |
| -86.854042 | 30.506 |
| -86.854042 | 30.506 |
| -86.854118 | 30.506 |
| -86.854118 | 30.506 |
| -86.854225 | 30.506 |
| -86.854225 | 30.506 |
| -86.854286 | 30.506 |
| -86.854286 | 30.506 |
| -86.854362 | 30.506 |
| -86.854362 | 30.506 |
| -86.854362 | 30.506 |
| -86.854454 | 30.506 |
| -86.854462 | 30.506 |
| -86.85453 | 30.506 |
| -86.85453 | 30.506 |
| -86.854607 | 30.506 |
| -86.854614 | 30.506 |
| -86.854683 | 30.506 |
| -86.854683 | 30.506 |
| -86.854683 | 30.506 |
| -86.854759 | 30.506 |
| -86.854759 | 30.506 |
| -86.854828 | 30.506 |
| -86.854828 | 30.506 |
| -86.854889 | 30.506 |
| -86.854889 | 30.506 |
| -86.854973 | 30.506 |
| -86.854973 | 30.506 |
| -86.855049 | 30.506 |
| -86.855049 | 30.506 |
| -86.855049 | 30.506 |
| -86.855141 | 30.506 |
| -86.855148 | 30.506 |
| -86.855148 | 30.506 |
| -86.855194 | 30.506 |
| -86.855194 | 30.506 |
| -86.85527 | 30.506 |
| -86.85527 | 30.506 |
| -86.855354 | 30.506 |
| -86.855354 | 30.506 |
| -86.855408 | 30.506 |
| -86.855408 | 30.506 |
| -86.855469 | 30.506 |
| -86.855469 | 30.506 |
| -86.855545 | 30.506 |
| -86.855545 | 30.506 |
| -86.855545 | 30.506 |
| -86.855614 | 30.506 |
| -86.855614 | 30.506 |
| -86.855614 | 30.506 |
| -86.855675 | 30.506 |
| -86.855675 | 30.506 |
| -86.855751 | 30.506 |
| -86.855751 | 30.506 |
| -86.855858 | 30.506 |
| -86.855858 | 30.506 |
| -86.855904 | 30.506 |
| -86.855904 | 30.506 |
| -86.85598 | 30.506 |
| -86.85598 | 30.506 |
| -86.856056 | 30.506 |
| -86.856071 | 30.506 |
| -86.856071 | 30.506 |
| -86.856133 | 30.506 |
| -86.856133 | 30.506 |
| -86.856224 | 30.506 |
| -86.856224 | 30.506 |
| -86.8563 | 30.506 |
| -86.8563 | 30.506 |
| -86.856377 | 30.506 |
| -86.856377 | 30.506 |
| -86.856453 | 30.506 |
| -86.856461 | 30.506 |
| -86.856461 | 30.506 |
| -86.856552 | 30.506 |
| -86.856552 | 30.506 |
| -86.856651 | 30.506 |
| -86.856651 | 30.506 |
| -86.856705 | 30.506 |
| -86.856705 | 30.506 |
| -86.856796 | 30.506 |
| -86.856796 | 30.506 |
| -86.856888 | 30.506 |
| -86.856888 | 30.506 |
| -86.857002 | 30.506 |
| -86.857002 | 30.506 |
| -86.857094 | 30.506 |
| -86.857094 | 30.506 |
| -86.85717 | 30.506 |
| -86.85717 | 30.506 |
| -86.857307 | 30.506 |
| -86.857346 | 30.506 |
| -86.857346 | 30.506 |
| -86.857452 | 30.506 |
| -86.857452 | 30.506 |
| -86.857529 | 30.506 |
| -86.857529 | 30.506 |
| -86.857605 | 30.506 |
| -86.857605 | 30.506 |
| -86.857681 | 30.506 |
| -86.857681 | 30.506 |
| -86.857796 | 30.506 |
| -86.857796 | 30.506 |
| -86.857872 | 30.506 |
| -86.857872 | 30.506 |
| -86.857964 | 30.506 |
| -86.857964 | 30.506 |
| -86.857948 | 30.506 |
| -86.85804 | 30.506 |
| -86.85804 | 30.506 |
| -86.858131 | 30.506 |
| -86.858131 | 30.506 |
| -86.858223 | 30.506 |
| -86.858246 | 30.506 |
| -86.858246 | 30.506 |
| -86.858337 | 30.506 |
| -86.858337 | 30.506 |
| -86.858398 | 30.506 |
| -86.858398 | 30.506 |
| -86.858475 | 30.506 |
| -86.858475 | 30.506 |
| -86.858536 | 30.506 |
| -86.858536 | 30.506 |
| -86.85862 | 30.506 |
| -86.85862 | 30.506 |
| -86.858658 | 30.506 |
| -86.858658 | 30.506 |
| -86.858696 | 30.506 |
| -86.858696 | 30.506 |
| -86.858696 | 30.506 |
| -86.858696 | 30.506 |
| -86.858727 | 30.506 |
| -86.858727 | 30.506 |
| -86.858742 | 30.506 |
| -86.858742 | 30.506 |
| -86.858742 | 30.506 |
| -86.858742 | 30.506 |
| -86.858727 | 30.505 |
| -86.858727 | 30.505 |
| -86.858711 | 30.505 |
| -86.858696 | 30.505 |
| -86.858696 | 30.505 |
| -86.85865 | 30.505 |
| -86.858635 | 30.505 |
| -86.858635 | 30.505 |
| -86.858635 | 30.505 |
| -86.858604 | 30.505 |
| -86.858604 | 30.505 |
| -86.858604 | 30.505 |
| -86.858574 | 30.505 |
| -86.858574 | 30.505 |
| -86.858543 | 30.505 |
| -86.858543 | 30.505 |
| -86.858528 | 30.505 |
| -86.858528 | 30.505 |
| -86.858513 | 30.505 |
| -86.858513 | 30.505 |
| -86.858498 | 30.505 |
| -86.858498 | 30.505 |
| -86.858498 | 30.505 |
| -86.858498 | 30.505 |
| -86.858513 | 30.505 |
| -86.858513 | 30.505 |
| -86.858513 | 30.505 |
| -86.858528 | 30.505 |
| -86.858528 | 30.505 |
| -86.858528 | 30.505 |
| -86.858528 | 30.505 |
| -86.858528 | 30.505 |
| -86.858528 | 30.504 |
| -86.858528 | 30.504 |
| -86.858543 | 30.504 |
| -86.858543 | 30.504 |
| -86.858528 | 30.504 |
| -86.858528 | 30.504 |
| -86.858528 | 30.504 |
| -86.858528 | 30.504 |
| -86.858528 | 30.504 |
| -86.858528 | 30.504 |
| -86.858528 | 30.504 |
| -86.858513 | 30.504 |
| -86.858513 | 30.504 |
| -86.858498 | 30.504 |
| -86.858498 | 30.504 |
| -86.858498 | 30.504 |
| -86.858498 | 30.504 |
| -86.858498 | 30.504 |
| -86.858498 | 30.504 |
| -86.858482 | 30.504 |
| -86.858482 | 30.504 |
| -86.858467 | 30.504 |
| -86.858467 | 30.504 |
| -86.858467 | 30.504 |
| -86.858467 | 30.504 |
| -86.858452 | 30.504 |
| -86.858452 | 30.504 |
| -86.858452 | 30.504 |
| -86.858452 | 30.504 |
| -86.858437 | 30.503 |
| -86.858437 | 30.503 |
| -86.858421 | 30.503 |
| -86.858421 | 30.503 |
| -86.858421 | 30.503 |
| -86.858421 | 30.503 |
| -86.858421 | 30.503 |
| -86.858421 | 30.503 |
| -86.858406 | 30.503 |
| -86.858406 | 30.503 |
| -86.858406 | 30.503 |
| -86.858406 | 30.503 |
| -86.858406 | 30.503 |
| -86.858406 | 30.503 |
| -86.858391 | 30.503 |
| -86.858391 | 30.503 |
| -86.858391 | 30.503 |
| -86.858391 | 30.503 |
| -86.858391 | 30.503 |
| -86.858391 | 30.503 |
| -86.858391 | 30.503 |
| -86.858391 | 30.503 |
| -86.858391 | 30.503 |
| -86.858391 | 30.503 |
| -86.858391 | 30.503 |
| -86.858406 | 30.503 |
| -86.858406 | 30.503 |
| -86.858406 | 30.503 |
| -86.858421 | 30.503 |
| -86.858421 | 30.503 |
| -86.858421 | 30.503 |
| -86.858421 | 30.503 |
| -86.858437 | 30.503 |
| -86.858437 | 30.503 |
| -86.858452 | 30.503 |
| -86.858452 | 30.503 |
| -86.858452 | 30.503 |
| -86.858452 | 30.503 |
| -86.858452 | 30.503 |
| -86.858452 | 30.502 |
| -86.858452 | 30.502 |
| -86.858452 | 30.502 |
| -86.858452 | 30.502 |
| -86.858437 | 30.502 |
| -86.858437 | 30.502 |
| -86.858376 | 30.502 |
| -86.858376 | 30.502 |
| -86.858353 | 30.502 |
| -86.858353 | 30.502 |
| -86.858284 | 30.502 |
| -86.858253 | 30.502 |
| -86.858223 | 30.502 |
| -86.858223 | 30.502 |
| -86.858162 | 30.502 |
| -86.858162 | 30.502 |
| -86.85804 | 30.502 |
| -86.85804 | 30.502 |
| -86.857948 | 30.502 |
| -86.857948 | 30.502 |
| -86.857948 | 30.502 |
| -86.857872 | 30.502 |
| -86.857872 | 30.502 |
| -86.857872 | 30.502 |
| -86.857796 | 30.502 |
| -86.857796 | 30.502 |
| -86.857704 | 30.502 |
| -86.857704 | 30.502 |
| -86.857613 | 30.502 |
| -86.857613 | 30.502 |
| -86.857544 | 30.502 |
| -86.857544 | 30.502 |
| -86.857475 | 30.502 |
| -86.857475 | 30.502 |
| -86.857391 | 30.502 |
| -86.857391 | 30.502 |
| -86.857323 | 30.502 |
| -86.857323 | 30.502 |
| -86.857323 | 30.502 |
| -86.857323 | 30.502 |
| -86.857216 | 30.502 |
| -86.857216 | 30.502 |
| -86.857147 | 30.502 |
| -86.857147 | 30.502 |
| -86.857048 | 30.502 |
| -86.857048 | 30.502 |
| -86.857002 | 30.502 |
| -86.857002 | 30.502 |
| -86.856911 | 30.502 |
| -86.856911 | 30.502 |
| -86.856804 | 30.502 |
| -86.856804 | 30.502 |
| -86.856804 | 30.502 |
| -86.856728 | 30.502 |
| -86.856728 | 30.502 |
| -86.856728 | 30.502 |
| -86.856651 | 30.502 |
| -86.856651 | 30.502 |
| -86.856575 | 30.502 |
| -86.856575 | 30.502 |
| -86.856453 | 30.502 |
| -86.856453 | 30.502 |
| -86.856377 | 30.502 |
| -86.856377 | 30.502 |
| -86.856377 | 30.502 |
| -86.856316 | 30.502 |
| -86.856293 | 30.502 |
| -86.856293 | 30.502 |
| -86.856224 | 30.502 |
| -86.856224 | 30.502 |
| -86.85614 | 30.502 |
| -86.85614 | 30.502 |
| -86.856064 | 30.502 |
| -86.856041 | 30.502 |
| -86.856041 | 30.502 |
| -86.855957 | 30.502 |
| -86.855957 | 30.502 |
| -86.855858 | 30.502 |
| -86.855858 | 30.502 |
| -86.855858 | 30.502 |
| -86.855782 | 30.502 |
| -86.855782 | 30.502 |
| -86.855705 | 30.502 |
| -86.855705 | 30.502 |
| -86.855614 | 30.502 |
| -86.855614 | 30.502 |
| -86.855537 | 30.502 |
| -86.855537 | 30.502 |
| -86.855446 | 30.502 |
| -86.855446 | 30.502 |
| -86.85537 | 30.502 |
| -86.855278 | 30.502 |
| -86.855278 | 30.502 |
| -86.855202 | 30.502 |
| -86.855202 | 30.502 |
| -86.855125 | 30.502 |
| -86.855125 | 30.502 |
| -86.855049 | 30.502 |
| -86.855049 | 30.502 |
| -86.854973 | 30.502 |
| -86.854973 | 30.502 |
| -86.854973 | 30.502 |
| -86.854858 | 30.502 |
| -86.854897 | 30.502 |
| -86.854805 | 30.502 |
| -86.854805 | 30.502 |
| -86.854729 | 30.502 |
| -86.854729 | 30.502 |
| -86.854729 | 30.502 |
| -86.854652 | 30.502 |
| -86.854652 | 30.502 |
| -86.854576 | 30.502 |
| -86.854576 | 30.502 |
| -86.8545 | 30.502 |
| -86.8545 | 30.502 |
| -86.854393 | 30.502 |
| -86.854393 | 30.502 |
| -86.854324 | 30.502 |
| -86.854324 | 30.502 |
| -86.85424 | 30.502 |
| -86.85424 | 30.502 |
| -86.854187 | 30.502 |
| -86.854187 | 30.502 |
| -86.854088 | 30.502 |
| -86.854088 | 30.502 |
| -86.853996 | 30.502 |
| -86.853996 | 30.502 |
| -86.85392 | 30.502 |
| -86.85392 | 30.502 |
| -86.853844 | 30.502 |
| -86.853844 | 30.502 |
| -86.853844 | 30.502 |
| -86.853745 | 30.502 |
| -86.853722 | 30.502 |
| -86.853722 | 30.502 |
| -86.853653 | 30.502 |
| -86.853653 | 30.502 |
| -86.853577 | 30.502 |
| -86.853577 | 30.502 |
| -86.8535 | 30.502 |
| -86.8535 | 30.502 |
| -86.853424 | 30.502 |
| -86.853424 | 30.502 |
| -86.853348 | 30.502 |
| -86.853348 | 30.502 |
| -86.853256 | 30.502 |
| -86.853256 | 30.502 |
| -86.853157 | 30.502 |
| -86.853172 | 30.502 |
| -86.853081 | 30.502 |
| -86.853081 | 30.502 |
| -86.852989 | 30.502 |
| -86.852989 | 30.502 |
| -86.852913 | 30.502 |
| -86.852913 | 30.502 |
| -86.852913 | 30.502 |
| -86.852837 | 30.502 |
| -86.85276 | 30.502 |
| -86.85276 | 30.502 |
| -86.85276 | 30.502 |
| -86.852669 | 30.502 |
| -86.852592 | 30.502 |
| -86.852592 | 30.502 |
| -86.852592 | 30.502 |
| -86.852592 | 30.502 |
| -86.852455 | 30.502 |
| -86.852455 | 30.502 |
| -86.852386 | 30.502 |
| -86.852386 | 30.502 |
| -86.85231 | 30.502 |
| -86.85231 | 30.502 |
| -86.852196 | 30.502 |
| -86.852196 | 30.502 |
| -86.852104 | 30.502 |
| -86.852104 | 30.502 |
| -86.85199 | 30.502 |
| -86.85199 | 30.502 |
| -86.851936 | 30.502 |
| -86.851936 | 30.502 |
| -86.851822 | 30.502 |
| -86.851822 | 30.502 |
| -86.851707 | 30.502 |
| -86.851707 | 30.502 |
| -86.851639 | 30.502 |
| -86.851639 | 30.502 |
| -86.851547 | 30.502 |
| -86.851524 | 30.502 |
| -86.851524 | 30.502 |
| -86.851433 | 30.502 |
| -86.851433 | 30.502 |
| -86.851341 | 30.502 |
| -86.851341 | 30.502 |
| -86.85125 | 30.502 |
| -86.85125 | 30.502 |
| -86.851158 | 30.502 |
| -86.851158 | 30.502 |
| -86.851067 | 30.502 |
| -86.851067 | 30.502 |
| -86.85099 | 30.502 |
| -86.85099 | 30.502 |
| -86.850899 | 30.502 |
| -86.850899 | 30.502 |
| -86.850899 | 30.502 |
| -86.850899 | 30.502 |
| -86.850784 | 30.502 |
| -86.850784 | 30.502 |
| -86.85067 | 30.502 |
| -86.85067 | 30.502 |
| -86.850601 | 30.502 |
| -86.850601 | 30.502 |
| -86.850464 | 30.502 |
| -86.850464 | 30.502 |
| -86.850395 | 30.502 |
| -86.850395 | 30.502 |
| -86.850281 | 30.502 |
| -86.850281 | 30.502 |
| -86.850189 | 30.502 |
| -86.850189 | 30.502 |
| -86.850082 | 30.502 |
| -86.850082 | 30.502 |
| -86.849991 | 30.502 |
| -86.849991 | 30.502 |
| -86.849899 | 30.502 |
| -86.849899 | 30.502 |
| -86.849808 | 30.502 |
| -86.849808 | 30.502 |
| -86.849716 | 30.502 |
| -86.849693 | 30.502 |
| -86.849609 | 30.502 |
| -86.849609 | 30.502 |
| -86.849533 | 30.502 |
| -86.849533 | 30.502 |
| -86.849533 | 30.502 |
| -86.849426 | 30.502 |
| -86.849426 | 30.502 |
| -86.849426 | 30.502 |
| -86.849312 | 30.502 |
| -86.849312 | 30.502 |
| -86.84922 | 30.502 |
| -86.84922 | 30.502 |
| -86.849129 | 30.502 |
| -86.849106 | 30.502 |
| -86.849037 | 30.502 |
| -86.849037 | 30.502 |
| -86.849037 | 30.502 |
| -86.849037 | 30.502 |
| -86.848946 | 30.502 |
| -86.848946 | 30.502 |
| -86.848854 | 30.502 |
| -86.848854 | 30.502 |
| -86.84874 | 30.502 |
| -86.84874 | 30.502 |
| -86.848625 | 30.502 |
| -86.848625 | 30.502 |
| -86.848557 | 30.502 |
| -86.848557 | 30.502 |
| -86.848465 | 30.502 |
| -86.848465 | 30.502 |
| -86.848358 | 30.502 |
| -86.848358 | 30.502 |
| -86.848267 | 30.502 |
| -86.848267 | 30.502 |
| -86.848175 | 30.502 |
| -86.848175 | 30.502 |
| -86.848045 | 30.502 |
| -86.848045 | 30.502 |
| -86.848045 | 30.502 |
| -86.848045 | 30.502 |
| -86.847954 | 30.502 |
| -86.847954 | 30.502 |
| -86.847862 | 30.502 |
| -86.847771 | 30.502 |
| -86.847771 | 30.502 |
| -86.847679 | 30.502 |
| -86.847679 | 30.502 |
| -86.847603 | 30.502 |
| -86.847603 | 30.502 |
| -86.847511 | 30.502 |
| -86.847511 | 30.502 |
| -86.84742 | 30.502 |
| -86.84742 | 30.502 |
| -86.847305 | 30.502 |
| -86.847305 | 30.502 |
| -86.847229 | 30.502 |
| -86.847229 | 30.502 |
| -86.847137 | 30.502 |
| -86.847137 | 30.502 |
| -86.847046 | 30.502 |
| -86.847046 | 30.502 |
| -86.846954 | 30.502 |
| -86.846954 | 30.502 |
| -86.846855 | 30.502 |
| -86.846855 | 30.502 |
| -86.846764 | 30.502 |
| -86.846764 | 30.502 |
| -86.846687 | 30.502 |
| -86.846687 | 30.502 |
| -86.846687 | 30.502 |
| -86.846611 | 30.502 |
| -86.846611 | 30.502 |
| -86.846519 | 30.502 |
| -86.846519 | 30.502 |
| -86.846519 | 30.502 |
| -86.846428 | 30.502 |
| -86.846428 | 30.502 |
| -86.846313 | 30.502 |
| -86.846313 | 30.502 |
| -86.846237 | 30.502 |
| -86.846237 | 30.502 |
| -86.846146 | 30.502 |
| -86.846146 | 30.502 |
| -86.846054 | 30.502 |
| -86.846054 | 30.502 |
| -86.84594 | 30.502 |
| -86.84594 | 30.502 |
| -86.845886 | 30.502 |
| -86.845886 | 30.502 |
| -86.845779 | 30.502 |
| -86.845779 | 30.502 |
| -86.845779 | 30.502 |
| -86.845642 | 30.502 |
| -86.845642 | 30.502 |
| -86.845573 | 30.502 |
| -86.845573 | 30.502 |
| -86.845436 | 30.502 |
| -86.845436 | 30.502 |
| -86.845367 | 30.502 |
| -86.845367 | 30.502 |
| -86.845268 | 30.502 |
| -86.845268 | 30.502 |
| -86.8452 | 30.502 |
| -86.8452 | 30.502 |
| -86.845108 | 30.502 |
| -86.845108 | 30.502 |
| -86.844994 | 30.502 |
| -86.844994 | 30.502 |
| -86.844902 | 30.502 |
| -86.844902 | 30.502 |
| -86.844902 | 30.502 |
| -86.844826 | 30.502 |
| -86.844826 | 30.502 |
| -86.844826 | 30.502 |
| -86.844734 | 30.502 |
| -86.844734 | 30.502 |
| -86.84462 | 30.502 |
| -86.844551 | 30.502 |
| -86.844551 | 30.502 |
| -86.844475 | 30.502 |
| -86.844475 | 30.502 |
| -86.844383 | 30.502 |
| -86.844383 | 30.502 |
| -86.84436 | 30.502 |
| -86.844292 | 30.502 |
| -86.844292 | 30.502 |
| -86.8442 | 30.502 |
| -86.8442 | 30.502 |
| -86.844063 | 30.502 |
| -86.844063 | 30.502 |
| -86.843971 | 30.502 |
| -86.843971 | 30.502 |
| -86.84388 | 30.502 |
| -86.84388 | 30.502 |
| -86.84388 | 30.502 |
| -86.843788 | 30.502 |
| -86.843788 | 30.502 |
| -86.843712 | 30.502 |
| -86.843712 | 30.502 |
| -86.843636 | 30.502 |
| -86.843636 | 30.502 |
| -86.843521 | 30.502 |
| -86.843521 | 30.502 |
| -86.843445 | 30.502 |
| -86.843445 | 30.502 |
| -86.843369 | 30.502 |
| -86.843369 | 30.502 |
| -86.843254 | 30.502 |
| -86.843254 | 30.502 |
| -86.843178 | 30.502 |
| -86.843193 | 30.502 |
| -86.843102 | 30.502 |
| -86.843102 | 30.502 |
| -86.843025 | 30.502 |
| -86.843025 | 30.502 |
| -86.842934 | 30.502 |
| -86.842949 | 30.502 |
| -86.842857 | 30.502 |
| -86.842857 | 30.502 |
| -86.842857 | 30.502 |
| -86.842796 | 30.502 |
| -86.842796 | 30.502 |
| -86.842705 | 30.502 |
| -86.842705 | 30.502 |
| -86.842705 | 30.502 |
| -86.842606 | 30.502 |
| -86.842606 | 30.502 |
| -86.842537 | 30.502 |
| -86.842537 | 30.502 |
| -86.842422 | 30.502 |
| -86.842422 | 30.502 |
| -86.842369 | 30.502 |
| -86.842369 | 30.502 |
| -86.842293 | 30.502 |
| -86.842293 | 30.502 |
| -86.842201 | 30.502 |
| -86.842201 | 30.502 |
| -86.84211 | 30.502 |
| -86.84211 | 30.502 |
| -86.842033 | 30.502 |
| -86.842033 | 30.502 |
| -86.841942 | 30.502 |
| -86.841942 | 30.502 |
| -86.841942 | 30.502 |
| -86.841866 | 30.502 |
| -86.841866 | 30.502 |
| -86.841774 | 30.502 |
| -86.841774 | 30.502 |
| -86.841698 | 30.502 |
| -86.841621 | 30.502 |
| -86.841621 | 30.502 |
| -86.841621 | 30.502 |
| -86.841621 | 30.502 |
| -86.84153 | 30.502 |
| -86.84153 | 30.502 |
| -86.841454 | 30.502 |
| -86.841454 | 30.502 |
| -86.841331 | 30.502 |
| -86.841331 | 30.502 |
| -86.841263 | 30.502 |
| -86.841263 | 30.502 |
| -86.841187 | 30.502 |
| -86.841187 | 30.502 |
| -86.84111 | 30.502 |
| -86.84111 | 30.502 |
| -86.840996 | 30.502 |
| -86.840996 | 30.502 |
| -86.840919 | 30.502 |
| -86.840919 | 30.502 |
| -86.840843 | 30.502 |
| -86.840843 | 30.502 |
| -86.840752 | 30.502 |
| -86.840752 | 30.502 |
| -86.840652 | 30.502 |
| -86.840652 | 30.502 |
| -86.840652 | 30.502 |
| -86.840576 | 30.502 |
| -86.840576 | 30.502 |
| -86.840576 | 30.502 |
| -86.840462 | 30.502 |
| -86.840462 | 30.502 |
| -86.84037 | 30.502 |
| -86.84037 | 30.502 |
| -86.840294 | 30.502 |
| -86.840271 | 30.502 |
| -86.840218 | 30.502 |
| -86.840218 | 30.502 |
| -86.840126 | 30.502 |
| -86.840126 | 30.502 |
| -86.84005 | 30.502 |
| -86.840027 | 30.502 |
| -86.839958 | 30.502 |
| -86.839958 | 30.502 |
| -86.839958 | 30.502 |
| -86.839882 | 30.502 |
| -86.839882 | 30.502 |
| -86.839767 | 30.502 |
| -86.839767 | 30.502 |
| -86.839668 | 30.502 |
| -86.839668 | 30.502 |
| -86.839668 | 30.502 |
| -86.839668 | 30.502 |
| -86.839577 | 30.502 |
| -86.839577 | 30.502 |
| -86.83947 | 30.502 |
| -86.83947 | 30.502 |
| -86.839355 | 30.502 |
| -86.839355 | 30.502 |
| -86.839264 | 30.502 |
| -86.839264 | 30.502 |
| -86.839172 | 30.502 |
| -86.839172 | 30.502 |
| -86.839081 | 30.502 |
| -86.839081 | 30.502 |
| -86.838989 | 30.502 |
| -86.838989 | 30.502 |
| -86.838875 | 30.502 |
| -86.838875 | 30.502 |
| -86.838783 | 30.502 |
| -86.838707 | 30.502 |
| -86.838707 | 30.502 |
| -86.838615 | 30.502 |
| -86.838615 | 30.502 |
| -86.838615 | 30.502 |
| -86.838554 | 30.502 |
| -86.838478 | 30.502 |
| -86.838478 | 30.502 |
| -86.838478 | 30.502 |
| -86.838387 | 30.502 |
| -86.838387 | 30.502 |
| -86.838387 | 30.502 |
| -86.838287 | 30.502 |
| -86.838287 | 30.502 |
| -86.83812 | 30.502 |
| -86.83812 | 30.502 |
| -86.83802 | 30.502 |
| -86.83802 | 30.502 |
| -86.837952 | 30.502 |
| -86.837952 | 30.502 |
| -86.837875 | 30.502 |
| -86.837875 | 30.502 |
| -86.837784 | 30.502 |
| -86.837784 | 30.502 |
| -86.837708 | 30.502 |
| -86.837708 | 30.502 |
| -86.837616 | 30.502 |
| -86.837616 | 30.502 |
| -86.83754 | 30.502 |
| -86.83754 | 30.502 |
| -86.837463 | 30.502 |
| -86.83744 | 30.502 |
| -86.83744 | 30.502 |
| -86.837349 | 30.502 |
| -86.837349 | 30.502 |
| -86.837273 | 30.502 |
| -86.837273 | 30.502 |
| -86.837173 | 30.502 |
| -86.837173 | 30.502 |
| -86.837105 | 30.502 |
| -86.837105 | 30.502 |
| -86.837006 | 30.502 |
| -86.837006 | 30.502 |
| -86.836929 | 30.502 |
| -86.836929 | 30.502 |
| -86.836838 | 30.502 |
| -86.836838 | 30.502 |
| -86.836739 | 30.502 |
| -86.836739 | 30.502 |
| -86.83667 | 30.502 |
| -86.83667 | 30.502 |
| -86.836594 | 30.502 |
| -86.836594 | 30.502 |
| -86.836594 | 30.502 |
| -86.836594 | 30.502 |
| -86.836494 | 30.502 |
| -86.836494 | 30.502 |
| -86.836418 | 30.502 |
| -86.836418 | 30.502 |
| -86.836327 | 30.502 |
| -86.836327 | 30.502 |
| -86.836235 | 30.502 |
| -86.836235 | 30.502 |
| -86.836143 | 30.502 |
| -86.836143 | 30.502 |
| -86.836143 | 30.502 |
| -86.836067 | 30.502 |
| -86.836044 | 30.502 |
| -86.835976 | 30.502 |
| -86.835976 | 30.502 |
| -86.835976 | 30.502 |
| -86.835861 | 30.502 |
| -86.835861 | 30.502 |
| -86.83577 | 30.502 |
| -86.83577 | 30.502 |
| -86.835655 | 30.502 |
| -86.835655 | 30.502 |
| -86.835587 | 30.502 |
| -86.835587 | 30.502 |
| -86.835472 | 30.502 |
| -86.835472 | 30.502 |
| -86.835396 | 30.502 |
| -86.835396 | 30.502 |
| -86.835335 | 30.502 |
| -86.835335 | 30.502 |
| -86.835335 | 30.502 |
| -86.835243 | 30.502 |
| -86.835236 | 30.502 |
| -86.835236 | 30.502 |
| -86.835197 | 30.502 |
| -86.835197 | 30.502 |
| -86.835114 | 30.502 |
| -86.835114 | 30.502 |
| -86.835075 | 30.502 |
| -86.835075 | 30.502 |
| -86.835007 | 30.502 |
| -86.835007 | 30.502 |
| -86.834984 | 30.502 |
| -86.834984 | 30.502 |
| -86.834984 | 30.502 |
| -86.834969 | 30.502 |
| -86.834969 | 30.502 |
| -86.834938 | 30.502 |
| -86.834938 | 30.502 |
| -86.834923 | 30.502 |
| -86.834923 | 30.502 |
| -86.834923 | 30.501 |
| -86.834923 | 30.501 |
| -86.834923 | 30.501 |
| -86.834923 | 30.501 |
| -86.834953 | 30.501 |
| -86.834953 | 30.501 |
| -86.834953 | 30.501 |
| -86.834984 | 30.501 |
| -86.834984 | 30.501 |
| -86.835014 | 30.501 |
| -86.835014 | 30.501 |
| -86.835014 | 30.501 |
| -86.835045 | 30.501 |
| -86.83506 | 30.501 |
| -86.83506 | 30.501 |
| -86.835106 | 30.501 |
| -86.835106 | 30.501 |
| -86.835121 | 30.501 |
| -86.835121 | 30.501 |
| -86.835121 | 30.501 |
| -86.835152 | 30.501 |
| -86.835152 | 30.501 |
| -86.835152 | 30.501 |
| -86.835167 | 30.501 |
| -86.835167 | 30.501 |
| -86.835182 | 30.501 |
| -86.835182 | 30.501 |
| -86.835197 | 30.501 |
| -86.835197 | 30.501 |
| -86.835213 | 30.501 |
| -86.835213 | 30.501 |
| -86.835213 | 30.501 |
| -86.835213 | 30.501 |
| -86.835213 | 30.501 |
| -86.835213 | 30.5 |
| -86.835213 | 30.5 |
| -86.835213 | 30.5 |
| -86.835213 | 30.5 |
| -86.835213 | 30.5 |
| -86.835213 | 30.5 |
| -86.835213 | 30.5 |
| -86.835213 | 30.5 |
| -86.835213 | 30.5 |
| -86.835213 | 30.5 |
| -86.835213 | 30.5 |
| -86.835213 | 30.5 |
| -86.835213 | 30.5 |
| -86.835213 | 30.5 |
| -86.835213 | 30.5 |
| -86.835213 | 30.5 |
| -86.835213 | 30.5 |
| -86.835213 | 30.5 |
| -86.835213 | 30.5 |
| -86.835213 | 30.5 |
| -86.835213 | 30.5 |
| -86.835213 | 30.5 |
| -86.835228 | 30.5 |
| -86.835228 | 30.5 |
| -86.835243 | 30.5 |
| -86.835243 | 30.5 |
| -86.835258 | 30.5 |
| -86.835258 | 30.5 |
| -86.835258 | 30.5 |
| -86.835274 | 30.5 |
| -86.835274 | 30.5 |
| -86.835274 | 30.5 |
| -86.835289 | 30.5 |
| -86.835289 | 30.5 |
| -86.835304 | 30.5 |
| -86.835304 | 30.5 |
| -86.83532 | 30.499 |
| -86.83532 | 30.499 |
| -86.835335 | 30.499 |
| -86.835335 | 30.499 |
| -86.835335 | 30.499 |
| -86.835335 | 30.499 |
| -86.835335 | 30.499 |
| -86.835335 | 30.499 |
| -86.83535 | 30.499 |
| -86.83535 | 30.499 |
| -86.835365 | 30.499 |
| -86.835365 | 30.499 |
| -86.835365 | 30.499 |
| -86.835365 | 30.499 |
| -86.835365 | 30.499 |
| -86.835365 | 30.499 |
| -86.83535 | 30.499 |
| -86.83535 | 30.499 |
| -86.83535 | 30.499 |
| -86.83535 | 30.499 |
| -86.835335 | 30.499 |
| -86.83532 | 30.499 |
| -86.83532 | 30.499 |
| -86.835304 | 30.499 |
| -86.835289 | 30.499 |
| -86.835289 | 30.499 |
| -86.835289 | 30.499 |
| -86.835274 | 30.499 |
| -86.835274 | 30.499 |
| -86.835274 | 30.499 |
| -86.835274 | 30.499 |
| -86.835274 | 30.499 |
| -86.835258 | 30.499 |
| -86.835258 | 30.499 |
| -86.835258 | 30.498 |
| -86.835258 | 30.498 |
| -86.835258 | 30.498 |
| -86.835258 | 30.498 |
| -86.835274 | 30.498 |
| -86.835274 | 30.498 |
| -86.835274 | 30.498 |
| -86.835274 | 30.498 |
| -86.835274 | 30.498 |
| -86.835274 | 30.498 |
| -86.835274 | 30.498 |
| -86.835274 | 30.498 |
| -86.835274 | 30.498 |
| -86.835274 | 30.498 |
| -86.835289 | 30.498 |
| -86.835289 | 30.498 |
| -86.835289 | 30.498 |
| -86.835289 | 30.498 |
| -86.835289 | 30.498 |
| -86.835289 | 30.498 |
| -86.835304 | 30.498 |
| -86.835304 | 30.498 |
| -86.835342 | 30.498 |
| -86.835342 | 30.498 |
| -86.835388 | 30.498 |
| -86.835388 | 30.498 |
| -86.835434 | 30.498 |
| -86.835434 | 30.498 |
| -86.83548 | 30.498 |
| -86.83548 | 30.498 |
| -86.835548 | 30.498 |
| -86.835548 | 30.498 |
| -86.835625 | 30.498 |
| -86.835655 | 30.498 |
| -86.835686 | 30.498 |
| -86.835686 | 30.498 |
| -86.835762 | 30.498 |
| -86.835762 | 30.498 |
| -86.835762 | 30.498 |
| -86.835854 | 30.498 |
| -86.835915 | 30.498 |
| -86.835915 | 30.498 |
| -86.835976 | 30.498 |
| -86.835976 | 30.498 |
| -86.836052 | 30.498 |
| -86.83606 | 30.498 |
| -86.836113 | 30.498 |
| -86.836113 | 30.498 |
| -86.836174 | 30.498 |
| -86.836174 | 30.498 |
| -86.83625 | 30.498 |
| -86.836258 | 30.498 |
| -86.836258 | 30.498 |
| -86.836311 | 30.498 |
| -86.836311 | 30.498 |
| -86.836388 | 30.498 |
| -86.836456 | 30.498 |
| -86.836456 | 30.498 |
| -86.836533 | 30.498 |
| -86.836533 | 30.498 |
| -86.836609 | 30.498 |
| -86.836609 | 30.498 |
| -86.83667 | 30.498 |
| -86.83667 | 30.498 |
| -86.836731 | 30.498 |
| -86.836731 | 30.498 |
| -86.836815 | 30.498 |
| -86.836815 | 30.498 |
| -86.836815 | 30.498 |
| -86.836876 | 30.498 |
| -86.836884 | 30.498 |
| -86.836884 | 30.498 |
| -86.836952 | 30.498 |
| -86.836952 | 30.498 |
| -86.837013 | 30.498 |
| -86.837013 | 30.498 |
| -86.837074 | 30.498 |
| -86.837074 | 30.498 |
| -86.837135 | 30.498 |
| -86.837135 | 30.498 |
| -86.837212 | 30.498 |
| -86.837212 | 30.498 |
| -86.837288 | 30.498 |
| -86.837288 | 30.498 |
| -86.837349 | 30.498 |
| -86.837349 | 30.498 |
| -86.837425 | 30.498 |
| -86.837425 | 30.498 |
| -86.837502 | 30.498 |
| -86.837563 | 30.498 |
| -86.837563 | 30.498 |
| -86.837639 | 30.498 |
| -86.837639 | 30.498 |
| -86.837708 | 30.498 |
| -86.837708 | 30.498 |
| -86.837784 | 30.498 |
| -86.837784 | 30.498 |
| -86.837868 | 30.498 |
| -86.837868 | 30.498 |
| -86.837929 | 30.498 |
| -86.837929 | 30.498 |
| -86.83799 | 30.498 |
| -86.83799 | 30.498 |
| -86.838066 | 30.498 |
| -86.838127 | 30.498 |
| -86.838127 | 30.498 |
| -86.838127 | 30.498 |
| -86.838219 | 30.498 |
| -86.838234 | 30.498 |
| -86.83831 | 30.498 |
| -86.83831 | 30.498 |
| -86.838402 | 30.498 |
| -86.838425 | 30.498 |
| -86.838478 | 30.498 |
| -86.838478 | 30.498 |
| -86.838554 | 30.498 |
| -86.838554 | 30.498 |
| -86.838554 | 30.498 |
| -86.838638 | 30.498 |
| -86.838638 | 30.498 |
| -86.838722 | 30.498 |
| -86.838722 | 30.498 |
| -86.838791 | 30.498 |
| -86.838791 | 30.498 |
| -86.838875 | 30.498 |
| -86.838875 | 30.498 |
| -86.838928 | 30.498 |
| -86.838928 | 30.498 |
| -86.839005 | 30.498 |
| -86.839005 | 30.498 |
| -86.839096 | 30.498 |
| -86.839096 | 30.498 |
| -86.839165 | 30.498 |
| -86.839165 | 30.498 |
| -86.839241 | 30.498 |
| -86.839241 | 30.498 |
| -86.839317 | 30.498 |
| -86.839317 | 30.498 |
| -86.839378 | 30.498 |
| -86.839378 | 30.498 |
| -86.83947 | 30.498 |
| -86.83947 | 30.498 |
| -86.839539 | 30.498 |
| -86.839539 | 30.498 |
| -86.839668 | 30.498 |
| -86.839668 | 30.498 |
| -86.839691 | 30.498 |
| -86.839691 | 30.498 |
| -86.839775 | 30.498 |
| -86.839775 | 30.498 |
| -86.839828 | 30.498 |
| -86.839828 | 30.498 |
| -86.839928 | 30.498 |
| -86.839928 | 30.498 |
| -86.839989 | 30.498 |
| -86.840019 | 30.498 |
| -86.84005 | 30.498 |
| -86.84005 | 30.498 |
| -86.840172 | 30.498 |
| -86.840172 | 30.498 |
| -86.840233 | 30.498 |
| -86.840233 | 30.498 |
| -86.840233 | 30.498 |
| -86.840309 | 30.498 |
| -86.840317 | 30.498 |
| -86.840385 | 30.498 |
| -86.840385 | 30.498 |
| -86.840385 | 30.498 |
| -86.840454 | 30.498 |
| -86.840454 | 30.498 |
| -86.84053 | 30.498 |
| -86.84053 | 30.498 |
| -86.840591 | 30.498 |
| -86.840591 | 30.498 |
| -86.840668 | 30.498 |
| -86.840668 | 30.498 |
| -86.840744 | 30.498 |
| -86.840744 | 30.498 |
| -86.840813 | 30.498 |
| -86.840813 | 30.498 |
| -86.840874 | 30.498 |
| -86.840874 | 30.498 |
| -86.840874 | 30.498 |
| -86.84095 | 30.498 |
| -86.84095 | 30.498 |
| -86.841026 | 30.498 |
| -86.841026 | 30.498 |
| -86.841026 | 30.498 |
| -86.84111 | 30.498 |
| -86.84111 | 30.498 |
| -86.841171 | 30.498 |
| -86.841171 | 30.498 |
| -86.841248 | 30.498 |
| -86.841248 | 30.498 |
| -86.841324 | 30.498 |
| -86.841324 | 30.498 |
| -86.841324 | 30.498 |
| -86.841377 | 30.498 |
| -86.841423 | 30.498 |
| -86.841423 | 30.498 |
| -86.841454 | 30.498 |
| -86.841454 | 30.498 |
| -86.84153 | 30.498 |
| -86.84153 | 30.498 |
| -86.841637 | 30.498 |
| -86.841637 | 30.498 |
| -86.841698 | 30.498 |
| -86.841728 | 30.498 |
| -86.841789 | 30.498 |
| -86.841789 | 30.498 |
| -86.841789 | 30.498 |
| -86.841866 | 30.498 |
| -86.841866 | 30.498 |
| -86.841957 | 30.498 |
| -86.841957 | 30.498 |
| -86.841957 | 30.498 |
| -86.842056 | 30.498 |
| -86.842056 | 30.498 |
| -86.842133 | 30.498 |
| -86.842133 | 30.498 |
| -86.842209 | 30.498 |
| -86.842209 | 30.498 |
| -86.842285 | 30.498 |
| -86.842285 | 30.498 |
| -86.842346 | 30.498 |
| -86.842438 | 30.498 |
| -86.842438 | 30.498 |
| -86.842461 | 30.498 |
| -86.842461 | 30.498 |
| -86.842522 | 30.498 |
| -86.842522 | 30.498 |
| -86.842583 | 30.498 |
| -86.842583 | 30.498 |
| -86.842682 | 30.498 |
| -86.842682 | 30.498 |
| -86.842758 | 30.498 |
| -86.842758 | 30.498 |
| -86.842819 | 30.498 |
| -86.842819 | 30.498 |
| -86.842903 | 30.498 |
| -86.842903 | 30.498 |
| -86.842979 | 30.498 |
| -86.842979 | 30.498 |
| -86.842979 | 30.498 |
| -86.843056 | 30.498 |
| -86.843117 | 30.498 |
| -86.843117 | 30.498 |
| -86.843117 | 30.498 |
| -86.843117 | 30.498 |
| -86.843246 | 30.498 |
| -86.843246 | 30.498 |
| -86.843315 | 30.498 |
| -86.843315 | 30.498 |
| -86.843391 | 30.498 |
| -86.843468 | 30.498 |
| -86.843468 | 30.498 |
| -86.843544 | 30.498 |
| -86.843544 | 30.498 |
| -86.843636 | 30.498 |
| -86.843636 | 30.498 |
| -86.843636 | 30.498 |
| -86.843712 | 30.498 |
| -86.843712 | 30.498 |
| -86.843712 | 30.498 |
| -86.843811 | 30.498 |
| -86.843811 | 30.498 |
| -86.843872 | 30.498 |
| -86.843872 | 30.498 |
| -86.843964 | 30.498 |
| -86.843964 | 30.498 |
| -86.84404 | 30.498 |
| -86.844124 | 30.498 |
| -86.844124 | 30.498 |
| -86.844124 | 30.498 |
| -86.844215 | 30.498 |
| -86.844238 | 30.498 |
| -86.844238 | 30.498 |
| -86.844276 | 30.498 |
| -86.844276 | 30.498 |
| -86.844345 | 30.498 |
| -86.844345 | 30.498 |
| -86.844421 | 30.498 |
| -86.844421 | 30.498 |
| -86.844498 | 30.498 |
| -86.844498 | 30.498 |
| -86.844574 | 30.498 |
| -86.844574 | 30.498 |
| -86.844574 | 30.498 |
| -86.844688 | 30.498 |
| -86.844711 | 30.498 |
| -86.844711 | 30.498 |
| -86.844795 | 30.498 |
| -86.844826 | 30.498 |
| -86.844872 | 30.498 |
| -86.844872 | 30.498 |
| -86.844872 | 30.498 |
| -86.844994 | 30.498 |
| -86.84507 | 30.498 |
| -86.84507 | 30.498 |
| -86.84507 | 30.498 |
| -86.845146 | 30.498 |
| -86.845169 | 30.498 |
| -86.845169 | 30.498 |
| -86.845245 | 30.498 |
| -86.845245 | 30.498 |
| -86.845322 | 30.498 |
| -86.845322 | 30.498 |
| -86.845398 | 30.498 |
| -86.845398 | 30.498 |
| -86.84549 | 30.498 |
| -86.84549 | 30.498 |
| -86.845566 | 30.498 |
| -86.845566 | 30.498 |
| -86.845627 | 30.498 |
| -86.845627 | 30.498 |
| -86.845703 | 30.498 |
| -86.845703 | 30.498 |
| -86.845779 | 30.498 |
| -86.845779 | 30.498 |
| -86.845779 | 30.498 |
| -86.845779 | 30.498 |
| -86.845894 | 30.498 |
| -86.845894 | 30.498 |
| -86.84597 | 30.498 |
| -86.84597 | 30.498 |
| -86.846069 | 30.498 |
| -86.846069 | 30.498 |
| -86.846138 | 30.498 |
| -86.846138 | 30.498 |
| -86.84626 | 30.498 |
| -86.84626 | 30.498 |
| -86.846313 | 30.498 |
| -86.846313 | 30.498 |
| -86.846375 | 30.498 |
| -86.846375 | 30.498 |
| -86.846451 | 30.498 |
| -86.846451 | 30.498 |
| -86.846527 | 30.498 |
| -86.846527 | 30.498 |
| -86.846611 | 30.498 |
| -86.846611 | 30.498 |
| -86.846649 | 30.498 |
| -86.846649 | 30.498 |
| -86.846741 | 30.498 |
| -86.846741 | 30.498 |
| -86.84687 | 30.498 |
| -86.84687 | 30.498 |
| -86.846947 | 30.498 |
| -86.846947 | 30.498 |
| -86.846947 | 30.498 |
| -86.847023 | 30.498 |
| -86.847023 | 30.498 |
| -86.847023 | 30.498 |
| -86.847099 | 30.498 |
| -86.847099 | 30.498 |
| -86.847191 | 30.498 |
| -86.847191 | 30.498 |
| -86.847328 | 30.498 |
| -86.847328 | 30.498 |
| -86.847382 | 30.498 |
| -86.847382 | 30.498 |
| -86.847473 | 30.498 |
| -86.847473 | 30.498 |
| -86.847549 | 30.498 |
| -86.847549 | 30.498 |
| -86.847641 | 30.498 |
| -86.847641 | 30.498 |
| -86.847717 | 30.498 |
| -86.847717 | 30.498 |
| -86.847816 | 30.498 |
| -86.847816 | 30.498 |
| -86.847908 | 30.498 |
| -86.847908 | 30.498 |
| -86.847984 | 30.498 |
| -86.847984 | 30.498 |
| -86.848076 | 30.498 |
| -86.848076 | 30.498 |
| -86.848152 | 30.498 |
| -86.848152 | 30.498 |
| -86.848244 | 30.498 |
| -86.848244 | 30.498 |
| -86.848343 | 30.498 |
| -86.848343 | 30.498 |
| -86.848343 | 30.498 |
| -86.848419 | 30.498 |
| -86.848419 | 30.498 |
| -86.848511 | 30.498 |
| -86.848511 | 30.498 |
| -86.848587 | 30.498 |
| -86.848587 | 30.498 |
| -86.848679 | 30.498 |
| -86.848679 | 30.498 |
| -86.848778 | 30.498 |
| -86.848778 | 30.498 |
| -86.848869 | 30.498 |
| -86.848869 | 30.498 |
| -86.848946 | 30.498 |
| -86.848946 | 30.498 |
| -86.848946 | 30.498 |
| -86.849022 | 30.498 |
| -86.84903 | 30.498 |
| -86.849083 | 30.498 |
| -86.849083 | 30.498 |
| -86.849083 | 30.498 |
| -86.849167 | 30.498 |
| -86.849167 | 30.498 |
| -86.849243 | 30.498 |
| -86.849243 | 30.498 |
| -86.849327 | 30.498 |
| -86.849327 | 30.498 |
| -86.849388 | 30.498 |
| -86.849388 | 30.498 |
| -86.849449 | 30.498 |
| -86.849449 | 30.498 |
| -86.849525 | 30.498 |
| -86.849525 | 30.498 |
| -86.849594 | 30.498 |
| -86.849594 | 30.498 |
| -86.84967 | 30.498 |
| -86.849747 | 30.498 |
| -86.849831 | 30.498 |
| -86.849831 | 30.498 |
| -86.849892 | 30.498 |
| -86.849892 | 30.498 |
| -86.849892 | 30.498 |
| -86.849892 | 30.498 |
| -86.850014 | 30.498 |
| -86.850014 | 30.498 |
| -86.850075 | 30.498 |
| -86.850075 | 30.498 |
| -86.850159 | 30.498 |
| -86.850159 | 30.498 |
| -86.850227 | 30.498 |
| -86.850227 | 30.498 |
| -86.850311 | 30.498 |
| -86.850311 | 30.498 |
| -86.850372 | 30.498 |
| -86.850372 | 30.498 |
| -86.850372 | 30.498 |
| -86.850372 | 30.498 |
| -86.850449 | 30.498 |
| -86.850449 | 30.498 |
| -86.850517 | 30.498 |
| -86.850517 | 30.498 |
| -86.850601 | 30.498 |
| -86.850601 | 30.498 |
| -86.850685 | 30.498 |
| -86.850685 | 30.498 |
| -86.850746 | 30.498 |
| -86.850746 | 30.498 |
| -86.85083 | 30.498 |
| -86.85083 | 30.498 |
| -86.850906 | 30.498 |
| -86.850906 | 30.498 |
| -86.850967 | 30.498 |
| -86.850967 | 30.498 |
| -86.850967 | 30.498 |
| -86.851044 | 30.498 |
| -86.851067 | 30.498 |
| -86.851067 | 30.498 |
| -86.851181 | 30.498 |
| -86.851181 | 30.498 |
| -86.851257 | 30.498 |
| -86.851257 | 30.498 |
| -86.851334 | 30.498 |
| -86.851334 | 30.498 |
| -86.851433 | 30.498 |
| -86.851433 | 30.498 |
| -86.851509 | 30.498 |
| -86.851578 | 30.498 |
| -86.851578 | 30.498 |
| -86.851677 | 30.498 |
| -86.851677 | 30.498 |
| -86.851768 | 30.498 |
| -86.851768 | 30.498 |
| -86.85186 | 30.498 |
| -86.851845 | 30.498 |
| -86.851845 | 30.498 |
| -86.851936 | 30.498 |
| -86.852013 | 30.498 |
| -86.852013 | 30.498 |
| -86.852089 | 30.498 |
| -86.852112 | 30.498 |
| -86.852188 | 30.498 |
| -86.852188 | 30.498 |
| -86.852188 | 30.498 |
| -86.852303 | 30.498 |
| -86.852303 | 30.498 |
| -86.852356 | 30.498 |
| -86.852356 | 30.498 |
| -86.852432 | 30.498 |
| -86.852432 | 30.498 |
| -86.852493 | 30.498 |
| -86.852493 | 30.498 |
| -86.852577 | 30.498 |
| -86.852577 | 30.498 |
| -86.852654 | 30.498 |
| -86.852654 | 30.498 |
| -86.85273 | 30.498 |
| -86.85273 | 30.498 |
| -86.852791 | 30.498 |
| -86.852791 | 30.498 |
| -86.852867 | 30.498 |
| -86.852867 | 30.498 |
| -86.852943 | 30.498 |
| -86.852943 | 30.498 |
| -86.853012 | 30.498 |
| -86.853012 | 30.498 |
| -86.853096 | 30.498 |
| -86.853127 | 30.498 |
| -86.853157 | 30.498 |
| -86.853157 | 30.498 |
| -86.853249 | 30.498 |
| -86.853249 | 30.498 |
| -86.85331 | 30.498 |
| -86.85331 | 30.498 |
| -86.853386 | 30.498 |
| -86.853386 | 30.498 |
| -86.853447 | 30.498 |
| -86.853447 | 30.498 |
| -86.853447 | 30.498 |
| -86.853539 | 30.498 |
| -86.853539 | 30.498 |
| -86.8536 | 30.498 |
| -86.8536 | 30.498 |
| -86.8536 | 30.498 |
| -86.853714 | 30.498 |
| -86.853714 | 30.498 |
| -86.853783 | 30.498 |
| -86.853783 | 30.498 |
| -86.853859 | 30.498 |
| -86.853859 | 30.498 |
| -86.85392 | 30.498 |
| -86.854012 | 30.498 |
| -86.854012 | 30.498 |
| -86.854012 | 30.498 |
| -86.854088 | 30.498 |
| -86.854088 | 30.498 |
| -86.854088 | 30.498 |
| -86.85421 | 30.498 |
| -86.85421 | 30.498 |
| -86.85424 | 30.498 |
| -86.85424 | 30.498 |
| -86.85434 | 30.498 |
| -86.85434 | 30.498 |
| -86.854454 | 30.498 |
| -86.854454 | 30.498 |
| -86.854523 | 30.498 |
| -86.854523 | 30.498 |
| -86.854614 | 30.498 |
| -86.854691 | 30.498 |
| -86.854691 | 30.498 |
| -86.854691 | 30.498 |
| -86.854782 | 30.498 |
| -86.854782 | 30.498 |
| -86.854858 | 30.498 |
| -86.854858 | 30.498 |
| -86.85495 | 30.498 |
| -86.85495 | 30.498 |
| -86.855072 | 30.498 |
| -86.855072 | 30.498 |
| -86.855141 | 30.498 |
| -86.855141 | 30.498 |
| -86.855217 | 30.498 |
| -86.855217 | 30.498 |
| -86.855278 | 30.498 |
| -86.855278 | 30.498 |
| -86.855339 | 30.498 |
| -86.855339 | 30.498 |
| -86.855415 | 30.498 |
| -86.855415 | 30.498 |
| -86.855415 | 30.498 |
| -86.855499 | 30.498 |
| -86.855507 | 30.498 |
| -86.855507 | 30.498 |
| -86.85556 | 30.498 |
| -86.855637 | 30.498 |
| -86.855637 | 30.498 |
| -86.855698 | 30.498 |
| -86.855698 | 30.498 |
| -86.855766 | 30.498 |
| -86.855766 | 30.498 |
| -86.855766 | 30.498 |
| -86.855873 | 30.498 |
| -86.855881 | 30.498 |
| -86.855881 | 30.498 |
| -86.855934 | 30.498 |
| -86.85601 | 30.498 |
| -86.856071 | 30.498 |
| -86.856071 | 30.498 |
| -86.856071 | 30.498 |
| -86.856071 | 30.498 |
| -86.856155 | 30.498 |
| -86.856209 | 30.498 |
| -86.856209 | 30.498 |
| -86.856285 | 30.498 |
| -86.856293 | 30.498 |
| -86.856346 | 30.498 |
| -86.856346 | 30.498 |
| -86.856346 | 30.498 |
| -86.85643 | 30.498 |
| -86.85643 | 30.498 |
| -86.856483 | 30.498 |
| -86.856483 | 30.498 |
| -86.856567 | 30.498 |
| -86.856567 | 30.498 |
| -86.856628 | 30.498 |
| -86.856628 | 30.498 |
| -86.856712 | 30.498 |
| -86.856712 | 30.498 |
| -86.856789 | 30.498 |
| -86.856789 | 30.498 |
| -86.856857 | 30.498 |
| -86.856857 | 30.498 |
| -86.856857 | 30.498 |
| -86.856987 | 30.498 |
| -86.85701 | 30.498 |
| -86.85701 | 30.498 |
| -86.857086 | 30.498 |
| -86.857086 | 30.498 |
| -86.857185 | 30.498 |
| -86.857185 | 30.498 |
| -86.857246 | 30.498 |
| -86.857246 | 30.498 |
| -86.857277 | 30.498 |
| -86.857277 | 30.498 |
| -86.857353 | 30.498 |
| -86.857353 | 30.498 |
| -86.85743 | 30.498 |
| -86.85743 | 30.498 |
| -86.857513 | 30.498 |
| -86.857513 | 30.498 |
| -86.85759 | 30.498 |
| -86.857651 | 30.498 |
| -86.857651 | 30.498 |
| -86.857712 | 30.498 |
| -86.857712 | 30.498 |
| -86.857788 | 30.498 |
| -86.857788 | 30.498 |
| -86.857788 | 30.498 |
| -86.857788 | 30.498 |
| -86.857887 | 30.498 |
| -86.857887 | 30.498 |
| -86.857964 | 30.498 |
| -86.857964 | 30.498 |
| -86.85804 | 30.498 |
| -86.85804 | 30.498 |
| -86.858093 | 30.498 |
| -86.858093 | 30.498 |
| -86.8582 | 30.498 |
| -86.8582 | 30.498 |
| -86.858261 | 30.498 |
| -86.858261 | 30.498 |
| -86.858261 | 30.498 |
| -86.858261 | 30.498 |
| -86.858376 | 30.498 |
| -86.858376 | 30.498 |
| -86.858437 | 30.498 |
| -86.858437 | 30.498 |
| -86.858513 | 30.498 |
| -86.858513 | 30.498 |
| -86.858574 | 30.498 |
| -86.858574 | 30.498 |
| -86.858627 | 30.498 |
| -86.858627 | 30.498 |
| -86.858673 | 30.498 |
| -86.858673 | 30.498 |
| -86.858673 | 30.498 |
| -86.858673 | 30.498 |
| -86.858711 | 30.498 |
| -86.858711 | 30.498 |
| -86.858742 | 30.498 |
| -86.858742 | 30.498 |
| -86.858757 | 30.498 |
| -86.858757 | 30.498 |
| -86.858772 | 30.498 |
| -86.858772 | 30.498 |
| -86.858772 | 30.498 |
| -86.858772 | 30.498 |
| -86.858757 | 30.499 |
| -86.858757 | 30.499 |
| -86.858757 | 30.499 |
| -86.858742 | 30.499 |
| -86.858742 | 30.499 |
| -86.858711 | 30.499 |
| -86.858711 | 30.499 |
| -86.858665 | 30.499 |
| -86.858665 | 30.499 |
| -86.858665 | 30.499 |
| -86.858597 | 30.499 |
| -86.858551 | 30.499 |
| -86.858551 | 30.499 |
| -86.858475 | 30.499 |
| -86.858475 | 30.499 |
| -86.858475 | 30.499 |
| -86.858475 | 30.499 |
| -86.858353 | 30.499 |
| -86.858353 | 30.499 |
| -86.858253 | 30.499 |
| -86.858253 | 30.499 |
| -86.858162 | 30.499 |
| -86.858162 | 30.499 |
| -86.858086 | 30.499 |
| -86.858086 | 30.499 |
| -86.857994 | 30.499 |
| -86.857903 | 30.499 |
| -86.857903 | 30.499 |
| -86.857811 | 30.499 |
| -86.857811 | 30.499 |
| -86.857719 | 30.499 |
| -86.857719 | 30.499 |
| -86.857628 | 30.499 |
| -86.857628 | 30.499 |
| -86.857536 | 30.499 |
| -86.857536 | 30.499 |
| -86.857536 | 30.499 |
| -86.85746 | 30.499 |
| -86.857437 | 30.499 |
| -86.857368 | 30.499 |
| -86.857368 | 30.499 |
| -86.857277 | 30.499 |
| -86.857277 | 30.499 |
| -86.857201 | 30.499 |
| -86.857201 | 30.499 |
| -86.857201 | 30.499 |
| -86.857086 | 30.499 |
| -86.857086 | 30.499 |
| -86.856995 | 30.499 |
| -86.856995 | 30.499 |
| -86.856895 | 30.499 |
| -86.856895 | 30.499 |
| -86.856827 | 30.499 |
| -86.856827 | 30.499 |
| -86.856735 | 30.499 |
| -86.856735 | 30.499 |
| -86.856644 | 30.499 |
| -86.856644 | 30.499 |
| -86.856544 | 30.499 |
| -86.856544 | 30.499 |
| -86.856468 | 30.499 |
| -86.856468 | 30.499 |
| -86.856377 | 30.499 |
| -86.856354 | 30.499 |
| -86.8563 | 30.499 |
| -86.8563 | 30.499 |
| -86.856209 | 30.499 |
| -86.856209 | 30.499 |
| -86.856209 | 30.499 |
| -86.856209 | 30.499 |
| -86.85611 | 30.499 |
| -86.85611 | 30.499 |
| -86.856041 | 30.499 |
| -86.856041 | 30.499 |
| -86.855965 | 30.499 |
| -86.855965 | 30.499 |
| -86.85585 | 30.499 |
| -86.85585 | 30.499 |
| -86.855774 | 30.499 |
| -86.855774 | 30.499 |
| -86.855774 | 30.499 |
| -86.855682 | 30.499 |
| -86.855682 | 30.499 |
| -86.855682 | 30.499 |
| -86.855583 | 30.499 |
| -86.855583 | 30.499 |
| -86.855492 | 30.499 |
| -86.8554 | 30.499 |
| -86.8554 | 30.499 |
| -86.855309 | 30.499 |
| -86.855309 | 30.499 |
| -86.855309 | 30.499 |
| -86.855202 | 30.499 |
| -86.855179 | 30.499 |
| -86.85511 | 30.499 |
| -86.85511 | 30.499 |
| -86.85511 | 30.499 |
| -86.854996 | 30.499 |
| -86.854996 | 30.499 |
| -86.854904 | 30.499 |
| -86.854904 | 30.499 |
| -86.854805 | 30.499 |
| -86.854805 | 30.499 |
| -86.854736 | 30.499 |
| -86.854736 | 30.499 |
| -86.854637 | 30.499 |
| -86.854637 | 30.499 |
| -86.854546 | 30.499 |
| -86.854546 | 30.499 |
| -86.854454 | 30.499 |
| -86.854431 | 30.499 |
| -86.854431 | 30.499 |
| -86.854378 | 30.499 |
| -86.854378 | 30.499 |
| -86.854286 | 30.499 |
| -86.854263 | 30.499 |
| -86.854263 | 30.499 |
| -86.854195 | 30.499 |
| -86.854195 | 30.499 |
| -86.85408 | 30.499 |
| -86.85408 | 30.499 |
| -86.853989 | 30.499 |
| -86.853897 | 30.499 |
| -86.853897 | 30.499 |
| -86.853889 | 30.499 |
| -86.853821 | 30.499 |
| -86.853821 | 30.499 |
| -86.853729 | 30.499 |
| -86.853729 | 30.499 |
| -86.853729 | 30.499 |
| -86.853615 | 30.499 |
| -86.853615 | 30.499 |
| -86.853546 | 30.499 |
| -86.853432 | 30.499 |
| -86.853432 | 30.499 |
| -86.853355 | 30.499 |
| -86.853355 | 30.499 |
| -86.853264 | 30.5 |
| -86.853264 | 30.5 |
| -86.853172 | 30.5 |
| -86.853172 | 30.5 |
| -86.853081 | 30.5 |
| -86.853081 | 30.5 |
| -86.853004 | 30.5 |
| -86.853004 | 30.5 |
| -86.852913 | 30.5 |
| -86.852913 | 30.5 |
| -86.852821 | 30.5 |
| -86.852821 | 30.5 |
| -86.852821 | 30.5 |
| -86.852821 | 30.5 |
| -86.852722 | 30.5 |
| -86.852722 | 30.5 |
| -86.852654 | 30.5 |
| -86.852654 | 30.5 |
| -86.852539 | 30.5 |
| -86.852539 | 30.5 |
| -86.852463 | 30.5 |
| -86.85244 | 30.5 |
| -86.852371 | 30.5 |
| -86.852371 | 30.5 |
| -86.852371 | 30.5 |
| -86.852295 | 30.5 |
| -86.852295 | 30.5 |
| -86.852219 | 30.5 |
| -86.852219 | 30.5 |
| -86.852219 | 30.5 |
| -86.852142 | 30.5 |
| -86.852142 | 30.5 |
| -86.852058 | 30.5 |
| -86.852058 | 30.5 |
| -86.852005 | 30.5 |
| -86.851929 | 30.5 |
| -86.851929 | 30.5 |
| -86.85183 | 30.5 |
| -86.851822 | 30.5 |
| -86.851822 | 30.5 |
| -86.851784 | 30.5 |
| -86.851784 | 30.5 |
| -86.851707 | 30.5 |
| -86.851707 | 30.5 |
| -86.851631 | 30.5 |
| -86.851631 | 30.5 |
| -86.851532 | 30.5 |
| -86.851532 | 30.5 |
| -86.851479 | 30.5 |
| -86.851479 | 30.5 |
| -86.851364 | 30.5 |
| -86.851364 | 30.5 |
| -86.851288 | 30.5 |
| -86.851288 | 30.5 |
| -86.851196 | 30.5 |
| -86.851196 | 30.5 |
| -86.85112 | 30.5 |
| -86.85112 | 30.5 |
| -86.851044 | 30.5 |
| -86.851036 | 30.5 |
| -86.85096 | 30.5 |
| -86.85096 | 30.5 |
| -86.850868 | 30.5 |
| -86.850868 | 30.5 |
| -86.850868 | 30.5 |
| -86.850807 | 30.5 |
| -86.850731 | 30.5 |
| -86.850731 | 30.5 |
| -86.850731 | 30.5 |
| -86.850655 | 30.5 |
| -86.850655 | 30.5 |
| -86.850655 | 30.5 |
| -86.850548 | 30.5 |
| -86.850548 | 30.5 |
| -86.850479 | 30.501 |
| -86.850479 | 30.501 |
| -86.850403 | 30.501 |
| -86.850403 | 30.501 |
| -86.850304 | 30.501 |
| -86.850304 | 30.501 |
| -86.85025 | 30.501 |
| -86.85025 | 30.501 |
| -86.850151 | 30.501 |
| -86.850151 | 30.501 |
| -86.850037 | 30.501 |
| -86.849983 | 30.501 |
| -86.849983 | 30.501 |
| -86.849983 | 30.501 |
| -86.849884 | 30.501 |
| -86.849884 | 30.501 |
| -86.849792 | 30.501 |
| -86.849792 | 30.501 |
| -86.849693 | 30.501 |
| -86.849693 | 30.501 |
| -86.849625 | 30.501 |
| -86.849625 | 30.501 |
| -86.849525 | 30.501 |
| -86.849525 | 30.501 |
| -86.849434 | 30.501 |
| -86.849449 | 30.501 |
| -86.849358 | 30.501 |
| -86.849358 | 30.501 |
| -86.849358 | 30.501 |
| -86.849281 | 30.501 |
| -86.849258 | 30.501 |
| -86.849205 | 30.501 |
| -86.849113 | 30.501 |
| -86.849113 | 30.501 |
| -86.849113 | 30.501 |
| -86.849037 | 30.501 |
| -86.849037 | 30.501 |
| -86.848961 | 30.501 |
| -86.848961 | 30.501 |
| -86.848885 | 30.501 |
| -86.848885 | 30.501 |
| -86.848808 | 30.501 |
| -86.848808 | 30.501 |
| -86.848808 | 30.501 |
| -86.848694 | 30.501 |
| -86.848694 | 30.501 |
| -86.848618 | 30.501 |
| -86.848618 | 30.501 |
| -86.848541 | 30.501 |
| -86.848541 | 30.501 |
| -86.848427 | 30.501 |
| -86.848427 | 30.501 |
| -86.848351 | 30.501 |
| -86.848351 | 30.501 |
| -86.848274 | 30.501 |
| -86.848274 | 30.501 |
| -86.848198 | 30.501 |
| -86.848175 | 30.501 |
| -86.848122 | 30.501 |
| -86.848122 | 30.501 |
| -86.848122 | 30.501 |
| -86.84803 | 30.501 |
| -86.848007 | 30.501 |
| -86.848007 | 30.501 |
| -86.847931 | 30.501 |
| -86.847931 | 30.501 |
| -86.847816 | 30.501 |
| -86.847816 | 30.501 |
| -86.84774 | 30.501 |
| -86.84774 | 30.501 |
| -86.847649 | 30.501 |
| -86.847649 | 30.501 |
| -86.847557 | 30.502 |
| -86.847557 | 30.502 |
| -86.847481 | 30.502 |
| -86.847481 | 30.502 |
| -86.847404 | 30.502 |
| -86.847404 | 30.502 |
| -86.847328 | 30.502 |
| -86.847328 | 30.502 |
| -86.847328 | 30.502 |
| -86.847252 | 30.502 |
| -86.847252 | 30.502 |
| -86.847252 | 30.502 |
| -86.847137 | 30.502 |
| -86.847137 | 30.502 |
| -86.847069 | 30.502 |
| -86.846992 | 30.502 |
| -86.846992 | 30.502 |
| -86.846901 | 30.502 |
| -86.846901 | 30.502 |
| -86.846901 | 30.502 |
| -86.846786 | 30.502 |
| -86.846786 | 30.502 |
| -86.84671 | 30.502 |
| -86.84671 | 30.502 |
| -86.84671 | 30.502 |
| -86.846634 | 30.502 |
| -86.846634 | 30.502 |
| -86.846535 | 30.502 |
| -86.846535 | 30.502 |
| -86.84642 | 30.502 |
| -86.84642 | 30.502 |
| -86.846367 | 30.502 |
| -86.846367 | 30.502 |
| -86.846291 | 30.502 |
| -86.846268 | 30.502 |
| -86.846191 | 30.502 |
| -86.846191 | 30.502 |
| -86.846191 | 30.502 |
| -86.846191 | 30.502 |
| -86.8461 | 30.502 |
| -86.8461 | 30.502 |
| -86.846024 | 30.502 |
| -86.846024 | 30.502 |
| -86.845924 | 30.502 |
| -86.845924 | 30.502 |
| -86.845856 | 30.502 |
| -86.845856 | 30.502 |
| -86.845764 | 30.502 |
| -86.845764 | 30.502 |
| -86.845673 | 30.502 |
| -86.845665 | 30.502 |
| -86.845596 | 30.502 |
| -86.845596 | 30.502 |
| -86.845505 | 30.502 |
| -86.845505 | 30.502 |
| -86.845428 | 30.502 |
| -86.845337 | 30.502 |
| -86.845337 | 30.502 |
| -86.845245 | 30.502 |
| -86.845245 | 30.502 |
| -86.845146 | 30.502 |
| -86.845146 | 30.502 |
| -86.84507 | 30.503 |
| -86.84507 | 30.503 |
| -86.844978 | 30.503 |
| -86.844978 | 30.503 |
| -86.844978 | 30.503 |
| -86.844978 | 30.503 |
| -86.844879 | 30.503 |
| -86.844879 | 30.503 |
| -86.84481 | 30.503 |
| -86.844719 | 30.503 |
| -86.844719 | 30.503 |
| -86.844627 | 30.503 |
| -86.844627 | 30.503 |
| -86.844627 | 30.503 |
| -86.844528 | 30.503 |
| -86.844528 | 30.503 |
| -86.844452 | 30.503 |
| -86.844452 | 30.503 |
| -86.844376 | 30.503 |
| -86.844376 | 30.503 |
| -86.844284 | 30.503 |
| -86.844284 | 30.503 |
| -86.844177 | 30.503 |
| -86.844177 | 30.503 |
| -86.844109 | 30.503 |
| -86.844109 | 30.503 |
| -86.843987 | 30.503 |
| -86.843987 | 30.503 |
| -86.843933 | 30.503 |
| -86.843933 | 30.503 |
| -86.843842 | 30.503 |
| -86.843842 | 30.503 |
| -86.843765 | 30.503 |
| -86.843765 | 30.503 |
| -86.843666 | 30.503 |
| -86.843666 | 30.503 |
| -86.843666 | 30.503 |
| -86.84359 | 30.503 |
| -86.84359 | 30.503 |
| -86.84359 | 30.503 |
| -86.843513 | 30.503 |
| -86.843513 | 30.503 |
| -86.843414 | 30.503 |
| -86.843414 | 30.503 |
| -86.8433 | 30.503 |
| -86.8433 | 30.503 |
| -86.843246 | 30.503 |
| -86.843246 | 30.503 |
| -86.843147 | 30.503 |
| -86.843147 | 30.503 |
| -86.843079 | 30.503 |
| -86.843079 | 30.503 |
| -86.842979 | 30.503 |
| -86.842979 | 30.503 |
| -86.842888 | 30.503 |
| -86.842888 | 30.503 |
| -86.842796 | 30.503 |
| -86.842796 | 30.503 |
| -86.842697 | 30.503 |
| -86.842697 | 30.503 |
| -86.842606 | 30.503 |
| -86.842606 | 30.503 |
| -86.842529 | 30.503 |
| -86.842529 | 30.503 |
| -86.842438 | 30.503 |
| -86.842438 | 30.503 |
| -86.842346 | 30.503 |
| -86.842346 | 30.503 |
| -86.842232 | 30.503 |
| -86.842247 | 30.503 |
| -86.842155 | 30.504 |
| -86.842155 | 30.504 |
| -86.842079 | 30.504 |
| -86.842079 | 30.504 |
| -86.841988 | 30.504 |
| -86.841988 | 30.504 |
| -86.841911 | 30.504 |
| -86.841911 | 30.504 |
| -86.841911 | 30.504 |
| -86.841835 | 30.504 |
| -86.841835 | 30.504 |
| -86.841835 | 30.504 |
| -86.841721 | 30.504 |
| -86.841721 | 30.504 |
| -86.841644 | 30.504 |
| -86.841644 | 30.504 |
| -86.841568 | 30.504 |
| -86.841568 | 30.504 |
| -86.841476 | 30.504 |
| -86.841476 | 30.504 |
| -86.841476 | 30.504 |
| -86.8414 | 30.504 |
| -86.8414 | 30.504 |
| -86.8414 | 30.504 |
| -86.841286 | 30.504 |
| -86.841286 | 30.504 |
| -86.841209 | 30.504 |
| -86.841209 | 30.504 |
| -86.841118 | 30.504 |
| -86.841118 | 30.504 |
| -86.841019 | 30.504 |
| -86.841019 | 30.504 |
| -86.84095 | 30.504 |
| -86.84095 | 30.504 |
| -86.840858 | 30.504 |
| -86.840858 | 30.504 |
| -86.840744 | 30.504 |
| -86.840744 | 30.504 |
| -86.840744 | 30.504 |
| -86.840668 | 30.504 |
| -86.840668 | 30.504 |
| -86.840553 | 30.504 |
| -86.840553 | 30.504 |
| -86.840477 | 30.504 |
| -86.840477 | 30.504 |
| -86.840385 | 30.504 |
| -86.840385 | 30.504 |
| -86.840309 | 30.504 |
| -86.840309 | 30.504 |
| -86.840218 | 30.504 |
| -86.840218 | 30.504 |
| -86.840141 | 30.504 |
| -86.840141 | 30.504 |
| -86.840065 | 30.504 |
| -86.840065 | 30.504 |
| -86.839989 | 30.504 |
| -86.839989 | 30.504 |
| -86.839989 | 30.504 |
| -86.839989 | 30.504 |
| -86.839912 | 30.504 |
| -86.839912 | 30.504 |
| -86.839821 | 30.504 |
| -86.839745 | 30.504 |
| -86.839722 | 30.504 |
| -86.839722 | 30.504 |
| -86.83963 | 30.504 |
| -86.83963 | 30.504 |
| -86.839531 | 30.504 |
| -86.839531 | 30.504 |
| -86.839462 | 30.505 |
| -86.839462 | 30.505 |
| -86.839325 | 30.505 |
| -86.839325 | 30.505 |
| -86.839256 | 30.505 |
| -86.839256 | 30.505 |
| -86.839165 | 30.505 |
| -86.839165 | 30.505 |
| -86.839088 | 30.505 |
| -86.839088 | 30.505 |
| -86.838997 | 30.505 |
| -86.838997 | 30.505 |
| -86.838882 | 30.505 |
| -86.838882 | 30.505 |
| -86.838882 | 30.505 |
| -86.838806 | 30.505 |
| -86.838806 | 30.505 |
| -86.838806 | 30.505 |
| -86.838638 | 30.505 |
| -86.838638 | 30.505 |
| -86.838547 | 30.505 |
| -86.838547 | 30.505 |
| -86.838432 | 30.505 |
| -86.838432 | 30.505 |
| -86.838379 | 30.505 |
| -86.838379 | 30.505 |
| -86.838264 | 30.505 |
| -86.838264 | 30.505 |
| -86.838188 | 30.505 |
| -86.838203 | 30.505 |
| -86.838203 | 30.505 |
| -86.838112 | 30.505 |
| -86.838112 | 30.505 |
| -86.838112 | 30.505 |
| -86.838013 | 30.505 |
| -86.838013 | 30.505 |
| -86.837959 | 30.505 |
| -86.837959 | 30.505 |
| -86.837883 | 30.505 |
| -86.837883 | 30.505 |
| -86.837807 | 30.505 |
| -86.837807 | 30.505 |
| -86.837807 | 30.505 |
| -86.837708 | 30.505 |
| -86.837708 | 30.505 |
| -86.837616 | 30.505 |
| -86.837616 | 30.505 |
| -86.83754 | 30.505 |
| -86.83754 | 30.505 |
| -86.837463 | 30.505 |
| -86.837463 | 30.505 |
| -86.837372 | 30.505 |
| -86.837372 | 30.505 |
| -86.83728 | 30.505 |
| -86.83728 | 30.505 |
| -86.837181 | 30.505 |
| -86.837112 | 30.505 |
| -86.837112 | 30.505 |
| -86.837036 | 30.505 |
| -86.837036 | 30.505 |
| -86.83696 | 30.505 |
| -86.83696 | 30.505 |
| -86.83696 | 30.505 |
| -86.83696 | 30.505 |
| -86.836845 | 30.505 |
| -86.836845 | 30.505 |
| -86.836792 | 30.506 |
| -86.836792 | 30.506 |
| -86.836693 | 30.506 |
| -86.836693 | 30.506 |
| -86.836624 | 30.506 |
| -86.836624 | 30.506 |
| -86.836548 | 30.506 |
| -86.836548 | 30.506 |
| -86.836411 | 30.506 |
| -86.836411 | 30.506 |
| -86.836357 | 30.506 |
| -86.836357 | 30.506 |
| -86.836266 | 30.506 |
| -86.836266 | 30.506 |
| -86.836174 | 30.506 |
| -86.836174 | 30.506 |
| -86.83606 | 30.506 |
| -86.83606 | 30.506 |
| -86.836006 | 30.506 |
| -86.836006 | 30.506 |
| -86.835907 | 30.506 |
| -86.835907 | 30.506 |
| -86.835815 | 30.506 |
| -86.835815 | 30.506 |
| -86.835716 | 30.506 |
| -86.835716 | 30.506 |
| -86.835663 | 30.506 |
| -86.835663 | 30.506 |
| -86.835609 | 30.506 |
| -86.835609 | 30.506 |
| -86.835548 | 30.506 |
| -86.835548 | 30.506 |
| -86.835548 | 30.506 |
| -86.835426 | 30.506 |
| -86.835419 | 30.506 |
| -86.835365 | 30.506 |
| -86.835365 | 30.506 |
| -86.835304 | 30.506 |
| -86.835304 | 30.506 |
| -86.835258 | 30.506 |
| -86.835251 | 30.506 |
| -86.835213 | 30.506 |
| -86.835213 | 30.506 |
| -86.835213 | 30.506 |
| -86.835182 | 30.506 |
| -86.835182 | 30.506 |
| -86.835167 | 30.507 |
| -86.835167 | 30.507 |
| -86.835152 | 30.507 |
| -86.835152 | 30.507 |
| -86.835152 | 30.507 |
| -86.835152 | 30.507 |
| -86.835182 | 30.507 |
| -86.835182 | 30.507 |
| -86.835213 | 30.507 |
| -86.835213 | 30.507 |
| -86.835251 | 30.507 |
| -86.835251 | 30.507 |
| -86.835297 | 30.507 |
| -86.835297 | 30.507 |
| -86.835365 | 30.507 |
| -86.835365 | 30.507 |
| -86.835426 | 30.507 |
| -86.835426 | 30.507 |
| -86.835487 | 30.507 |
| -86.835487 | 30.507 |
| -86.835564 | 30.507 |
| -86.835648 | 30.507 |
| -86.835648 | 30.507 |
| -86.835648 | 30.507 |
| -86.835648 | 30.507 |
| -86.835739 | 30.507 |
| -86.835739 | 30.507 |
| -86.835815 | 30.507 |
| -86.835815 | 30.507 |
| -86.835915 | 30.507 |
| -86.835915 | 30.507 |
| -86.835953 | 30.507 |
| -86.835953 | 30.507 |
| -86.836029 | 30.507 |
| -86.836029 | 30.507 |
| -86.836121 | 30.507 |
| -86.836121 | 30.507 |
| -86.836189 | 30.507 |
| -86.836189 | 30.507 |
| -86.83625 | 30.507 |
| -86.83625 | 30.507 |
| -86.83625 | 30.507 |
| -86.83625 | 30.507 |
| -86.836342 | 30.507 |
| -86.836342 | 30.507 |
| -86.836403 | 30.507 |
| -86.836403 | 30.507 |
| -86.836449 | 30.507 |
| -86.836449 | 30.507 |
| -86.836494 | 30.507 |
| -86.836494 | 30.507 |
| -86.83654 | 30.507 |
| -86.83654 | 30.507 |
| -86.836586 | 30.507 |
| -86.836586 | 30.507 |
| -86.836586 | 30.507 |
| -86.836617 | 30.507 |
| -86.836617 | 30.507 |
| -86.836662 | 30.507 |
| -86.836662 | 30.507 |
| -86.836662 | 30.507 |
| -86.836693 | 30.507 |
| -86.836693 | 30.507 |
| -86.836731 | 30.507 |
| -86.836731 | 30.507 |
| -86.836777 | 30.507 |
| -86.836777 | 30.507 |
| -86.83683 | 30.507 |
| -86.83683 | 30.507 |
| -86.836868 | 30.507 |
| -86.836868 | 30.507 |
| -86.836922 | 30.506 |
| -86.836922 | 30.506 |
| -86.836967 | 30.506 |
| -86.836967 | 30.506 |
| -86.836967 | 30.506 |
| -86.837029 | 30.506 |
| -86.837029 | 30.506 |
| -86.837029 | 30.506 |
| -86.83709 | 30.506 |
| -86.83709 | 30.506 |
| -86.837135 | 30.506 |
| -86.837135 | 30.506 |
| -86.837204 | 30.506 |
| -86.837204 | 30.506 |
| -86.837265 | 30.506 |
| -86.837265 | 30.506 |
| -86.837364 | 30.506 |
| -86.837364 | 30.506 |
| -86.83741 | 30.506 |
| -86.837471 | 30.506 |
| -86.837471 | 30.506 |
| -86.837517 | 30.506 |
| -86.837593 | 30.506 |
| -86.837593 | 30.506 |
| -86.837669 | 30.506 |
| -86.837669 | 30.506 |
| -86.837746 | 30.506 |
| -86.837822 | 30.506 |
| -86.837822 | 30.506 |
| -86.837822 | 30.506 |
| -86.837921 | 30.506 |
| -86.837921 | 30.506 |
| -86.83799 | 30.506 |
| -86.83799 | 30.506 |
| -86.838112 | 30.506 |
| -86.838112 | 30.506 |
| -86.838165 | 30.506 |
| -86.838165 | 30.506 |
| -86.83828 | 30.506 |
| -86.83828 | 30.506 |
| -86.838356 | 30.506 |
| -86.838356 | 30.506 |
| -86.838417 | 30.506 |
| -86.838417 | 30.506 |
| -86.838417 | 30.506 |
| -86.838478 | 30.506 |
| -86.838478 | 30.506 |
| -86.83857 | 30.506 |
| -86.83857 | 30.506 |
| -86.838631 | 30.506 |
| -86.838631 | 30.506 |
| -86.838692 | 30.506 |
| -86.838768 | 30.506 |
| -86.838768 | 30.506 |
| -86.838844 | 30.506 |
| -86.838844 | 30.506 |
| -86.838898 | 30.506 |
| -86.838898 | 30.506 |
| -86.838974 | 30.506 |
| -86.838974 | 30.506 |
| -86.83905 | 30.506 |
| -86.83905 | 30.506 |
| -86.839111 | 30.506 |
| -86.839111 | 30.506 |
| -86.839188 | 30.506 |
| -86.839272 | 30.506 |
| -86.839279 | 30.506 |
| -86.83934 | 30.506 |
| -86.83934 | 30.506 |
| -86.83934 | 30.506 |
| -86.839455 | 30.506 |
| -86.839455 | 30.506 |
| -86.839485 | 30.506 |
| -86.839485 | 30.506 |
| -86.839607 | 30.506 |
| -86.839607 | 30.506 |
| -86.839684 | 30.506 |
| -86.839684 | 30.506 |
| -86.83976 | 30.506 |
| -86.83976 | 30.506 |
| -86.839836 | 30.506 |
| -86.839844 | 30.506 |
| -86.839912 | 30.506 |
| -86.839912 | 30.506 |
| -86.839912 | 30.506 |
| -86.839989 | 30.506 |
| -86.839989 | 30.506 |
| -86.84005 | 30.506 |
| -86.84005 | 30.506 |
| -86.840134 | 30.506 |
| -86.840134 | 30.506 |
| -86.840195 | 30.506 |
| -86.840195 | 30.506 |
| -86.840271 | 30.506 |
| -86.840271 | 30.506 |
| -86.840355 | 30.506 |
| -86.840355 | 30.506 |
| -86.840424 | 30.506 |
| -86.840424 | 30.506 |
| -86.84053 | 30.506 |
| -86.84053 | 30.506 |
| -86.840584 | 30.506 |
| -86.840584 | 30.506 |
| -86.840675 | 30.506 |
| -86.840675 | 30.506 |
| -86.840767 | 30.506 |
| -86.840767 | 30.506 |
| -86.840843 | 30.506 |
| -86.840843 | 30.506 |
| -86.840919 | 30.506 |
| -86.840919 | 30.506 |
| -86.840981 | 30.506 |
| -86.840981 | 30.506 |
| -86.841042 | 30.506 |
| -86.841042 | 30.506 |
| -86.841118 | 30.506 |
| -86.841118 | 30.506 |
| -86.841202 | 30.506 |
| -86.841202 | 30.506 |
| -86.841278 | 30.506 |
| -86.841278 | 30.506 |
| -86.84137 | 30.506 |
| -86.84137 | 30.506 |
| -86.841476 | 30.506 |
| -86.841476 | 30.506 |
| -86.841576 | 30.506 |
| -86.84156 | 30.506 |
| -86.841637 | 30.506 |
| -86.841637 | 30.506 |
| -86.841637 | 30.506 |
| -86.841728 | 30.506 |
| -86.841751 | 30.506 |
| -86.841751 | 30.506 |
| -86.841805 | 30.506 |
| -86.841805 | 30.506 |
| -86.841881 | 30.506 |
| -86.841881 | 30.506 |
| -86.84198 | 30.506 |
| -86.84198 | 30.506 |
| -86.842094 | 30.506 |
| -86.842094 | 30.506 |
| -86.84214 | 30.506 |
| -86.84214 | 30.506 |
| -86.842216 | 30.506 |
| -86.842216 | 30.506 |
| -86.842285 | 30.506 |
| -86.842285 | 30.506 |
| -86.842354 | 30.506 |
| -86.842354 | 30.506 |
| -86.84243 | 30.506 |
| -86.84243 | 30.506 |
| -86.842491 | 30.506 |
| -86.842491 | 30.506 |
| -86.842583 | 30.506 |
| -86.842583 | 30.506 |
| -86.842636 | 30.506 |
| -86.842636 | 30.506 |
| -86.842728 | 30.506 |
| -86.842728 | 30.506 |
| -86.842819 | 30.506 |
| -86.842819 | 30.506 |
| -86.842918 | 30.506 |
| -86.842918 | 30.506 |
| -86.842949 | 30.506 |
| -86.842949 | 30.506 |
| -86.843025 | 30.506 |
| -86.843025 | 30.506 |
| -86.843071 | 30.506 |
| -86.843117 | 30.506 |
| -86.843117 | 30.506 |
| -86.843208 | 30.506 |
| -86.843208 | 30.506 |
| -86.843285 | 30.506 |
| -86.843361 | 30.506 |
| -86.843361 | 30.506 |
| -86.843437 | 30.506 |
| -86.843437 | 30.506 |
| -86.843437 | 30.506 |
| -86.843498 | 30.506 |
| -86.843506 | 30.506 |
| -86.843575 | 30.506 |
| -86.843575 | 30.506 |
| -86.843575 | 30.506 |
| -86.843658 | 30.506 |
| -86.843658 | 30.506 |
| -86.843719 | 30.506 |
| -86.843719 | 30.506 |
| -86.843811 | 30.506 |
| -86.843811 | 30.506 |
| -86.843903 | 30.506 |
| -86.843903 | 30.506 |
| -86.843987 | 30.506 |
| -86.844032 | 30.506 |
| -86.844032 | 30.506 |
| -86.844032 | 30.506 |
| -86.844032 | 30.506 |
| -86.844131 | 30.506 |
| -86.844131 | 30.506 |
| -86.844208 | 30.506 |
| -86.844208 | 30.506 |
| -86.844284 | 30.506 |
| -86.844284 | 30.506 |
| -86.844345 | 30.506 |
| -86.844345 | 30.506 |
| -86.844421 | 30.506 |
| -86.844421 | 30.506 |
| -86.844551 | 30.506 |
| -86.844551 | 30.506 |
| -86.844627 | 30.506 |
| -86.844627 | 30.506 |
| -86.844704 | 30.506 |
| -86.844704 | 30.506 |
| -86.844765 | 30.506 |
| -86.844765 | 30.506 |
| -86.844826 | 30.506 |
| -86.844826 | 30.506 |
| -86.844902 | 30.506 |
| -86.844902 | 30.506 |
| -86.844994 | 30.506 |
| -86.844994 | 30.506 |
| -86.845016 | 30.506 |
| -86.84507 | 30.506 |
| -86.84507 | 30.506 |
| -86.845146 | 30.506 |
| -86.845146 | 30.506 |
| -86.845146 | 30.506 |
| -86.845222 | 30.506 |
| -86.845222 | 30.506 |
| -86.845314 | 30.506 |
| -86.845314 | 30.506 |
| -86.845383 | 30.506 |
| -86.845383 | 30.506 |
| -86.845451 | 30.506 |
| -86.845451 | 30.506 |
| -86.84552 | 30.506 |
| -86.84552 | 30.506 |
| -86.845596 | 30.506 |
| -86.845596 | 30.506 |
| -86.845695 | 30.506 |
| -86.845695 | 30.506 |
| -86.845772 | 30.506 |
| -86.845772 | 30.506 |
| -86.845848 | 30.506 |
| -86.845848 | 30.506 |
| -86.845924 | 30.506 |
| -86.845924 | 30.506 |
| -86.845985 | 30.506 |
| -86.845985 | 30.506 |
| -86.846062 | 30.506 |
| -86.846062 | 30.506 |
| -86.846169 | 30.506 |
| -86.846169 | 30.506 |
| -86.846268 | 30.506 |
| -86.846268 | 30.506 |
| -86.846344 | 30.506 |
| -86.846344 | 30.506 |
| -86.84642 | 30.506 |
| -86.84642 | 30.506 |
| -86.846481 | 30.506 |
| -86.846504 | 30.506 |
| -86.846504 | 30.506 |
| -86.846527 | 30.506 |
| -86.846527 | 30.506 |
| -86.846619 | 30.506 |
| -86.846619 | 30.506 |
| -86.846695 | 30.506 |
| -86.846695 | 30.506 |
| -86.846809 | 30.506 |
| -86.846809 | 30.506 |
| -86.846855 | 30.506 |
| -86.846855 | 30.506 |
| -86.846901 | 30.506 |
| -86.846901 | 30.506 |
| -86.846977 | 30.506 |
| -86.846977 | 30.506 |
| -86.847054 | 30.506 |
| -86.847054 | 30.506 |
| -86.847145 | 30.506 |
| -86.847145 | 30.506 |
| -86.847145 | 30.506 |
| -86.847221 | 30.506 |
| -86.847313 | 30.506 |
| -86.847313 | 30.506 |
| -86.847389 | 30.506 |
| -86.847389 | 30.506 |
| -86.84745 | 30.506 |
| -86.84745 | 30.506 |
| -86.847527 | 30.506 |
| -86.847527 | 30.506 |
| -86.847527 | 30.506 |
| -86.847618 | 30.506 |
| -86.847618 | 30.506 |
| -86.847687 | 30.506 |
| -86.847687 | 30.506 |
| -86.847763 | 30.506 |
| -86.847763 | 30.506 |
| -86.847839 | 30.506 |
| -86.847839 | 30.506 |
| -86.847916 | 30.506 |
| -86.847916 | 30.506 |
| -86.847984 | 30.506 |
| -86.847984 | 30.506 |
| -86.848053 | 30.506 |
| -86.848053 | 30.506 |
| -86.848129 | 30.506 |
| -86.848129 | 30.506 |
| -86.848213 | 30.506 |
| -86.848213 | 30.506 |
| -86.848282 | 30.506 |
| -86.848282 | 30.506 |
| -86.848351 | 30.506 |
| -86.848358 | 30.506 |
| -86.848427 | 30.506 |
| -86.848427 | 30.506 |
| -86.848427 | 30.506 |
| -86.848488 | 30.506 |
| -86.848488 | 30.506 |
| -86.848579 | 30.506 |
| -86.848579 | 30.506 |
| -86.848648 | 30.506 |
| -86.848648 | 30.506 |
| -86.848709 | 30.506 |
| -86.848709 | 30.506 |
| -86.848785 | 30.506 |
| -86.848877 | 30.506 |
| -86.848877 | 30.506 |
| -86.848938 | 30.506 |
| -86.848938 | 30.506 |
| -86.848938 | 30.506 |
| -86.848938 | 30.506 |
| -86.849052 | 30.506 |
| -86.849052 | 30.506 |
| -86.849098 | 30.506 |
| -86.849098 | 30.506 |
| -86.84919 | 30.506 |
| -86.84919 | 30.506 |
| -86.849304 | 30.506 |
| -86.849304 | 30.506 |
| -86.849358 | 30.506 |
| -86.849358 | 30.506 |
| -86.849434 | 30.506 |
| -86.849434 | 30.506 |
| -86.849434 | 30.506 |
| -86.849434 | 30.506 |
| -86.849533 | 30.506 |
| -86.849533 | 30.506 |
| -86.849609 | 30.506 |
| -86.849609 | 30.506 |
| -86.849724 | 30.506 |
| -86.849724 | 30.506 |
| -86.849823 | 30.506 |
| -86.849823 | 30.506 |
| -86.849876 | 30.506 |
| -86.849876 | 30.506 |
| -86.849968 | 30.506 |
| -86.849968 | 30.506 |
| -86.850082 | 30.506 |
| -86.850082 | 30.506 |
| -86.850151 | 30.506 |
| -86.850151 | 30.506 |
| -86.850243 | 30.506 |
| -86.850243 | 30.506 |
| -86.850342 | 30.506 |
| -86.850342 | 30.506 |
| -86.850433 | 30.506 |
| -86.850433 | 30.506 |
| -86.850525 | 30.506 |
| -86.850525 | 30.506 |
| -86.850616 | 30.506 |
| -86.850616 | 30.506 |
| -86.850693 | 30.506 |
| -86.850693 | 30.506 |
| -86.850807 | 30.506 |
| -86.850807 | 30.506 |
| -86.850883 | 30.506 |
| -86.850883 | 30.506 |
| -86.850883 | 30.506 |
| -86.85096 | 30.506 |
| -86.850983 | 30.506 |
| -86.851036 | 30.506 |
| -86.851036 | 30.506 |
| -86.851036 | 30.506 |
| -86.851151 | 30.506 |
| -86.851151 | 30.506 |
| -86.851204 | 30.506 |
| -86.851204 | 30.506 |
| -86.85128 | 30.506 |
| -86.85128 | 30.506 |
| -86.851372 | 30.506 |
| -86.851372 | 30.506 |
| -86.851448 | 30.506 |
| -86.851448 | 30.506 |
| -86.851563 | 30.506 |
| -86.851563 | 30.506 |
| -86.851639 | 30.506 |
| -86.851639 | 30.506 |
| -86.8517 | 30.506 |
| -86.8517 | 30.506 |
| -86.851814 | 30.506 |
| -86.851814 | 30.506 |
| -86.851891 | 30.506 |
| -86.851891 | 30.506 |
| -86.852005 | 30.506 |
| -86.852005 | 30.506 |
| -86.852051 | 30.506 |
| -86.852051 | 30.506 |
| -86.852158 | 30.506 |
| -86.852158 | 30.506 |
| -86.852234 | 30.506 |
| -86.852234 | 30.506 |
| -86.85231 | 30.506 |
| -86.85231 | 30.506 |
| -86.852409 | 30.506 |
| -86.852409 | 30.506 |
| -86.85244 | 30.506 |
| -86.85244 | 30.506 |
| -86.852547 | 30.506 |
| -86.852547 | 30.506 |
| -86.852608 | 30.506 |
| -86.852608 | 30.506 |
| -86.852715 | 30.506 |
| -86.852715 | 30.506 |
| -86.852791 | 30.506 |
| -86.852791 | 30.506 |
| -86.852867 | 30.506 |
| -86.852867 | 30.506 |
| -86.852959 | 30.506 |
| -86.852959 | 30.506 |
| -86.852959 | 30.506 |
| -86.85302 | 30.506 |
| -86.853111 | 30.506 |
| -86.853111 | 30.506 |
| -86.853111 | 30.506 |
| -86.853188 | 30.506 |
| -86.853264 | 30.506 |
| -86.853264 | 30.506 |
| -86.853264 | 30.506 |
| -86.853264 | 30.506 |
| -86.853378 | 30.506 |
| -86.853378 | 30.506 |
| -86.853455 | 30.506 |
| -86.853455 | 30.506 |
| -86.853539 | 30.506 |
| -86.853539 | 30.506 |
| -86.853607 | 30.506 |
| -86.853607 | 30.506 |
| -86.853706 | 30.506 |
| -86.853706 | 30.506 |
| -86.853783 | 30.506 |
| -86.853783 | 30.506 |
| -86.853859 | 30.506 |
| -86.853859 | 30.506 |
| -86.853951 | 30.506 |
| -86.853951 | 30.506 |
| -86.85405 | 30.506 |
| -86.85405 | 30.506 |
| -86.854141 | 30.506 |
| -86.854141 | 30.506 |
| -86.85424 | 30.506 |
| -86.85424 | 30.506 |
| -86.854309 | 30.506 |
| -86.854309 | 30.506 |
| -86.854408 | 30.506 |
| -86.854408 | 30.506 |
| -86.8545 | 30.506 |
| -86.8545 | 30.506 |
| -86.854576 | 30.506 |
| -86.854576 | 30.506 |
| -86.854652 | 30.506 |
| -86.854652 | 30.506 |
| -86.854713 | 30.506 |
| -86.854713 | 30.506 |
| -86.854774 | 30.506 |
| -86.854774 | 30.506 |
| -86.854881 | 30.506 |
| -86.854881 | 30.506 |
| -86.854881 | 30.506 |
| -86.854942 | 30.506 |
| -86.85495 | 30.506 |
| -86.855019 | 30.506 |
| -86.855019 | 30.506 |
| -86.855019 | 30.506 |
| -86.855087 | 30.506 |
| -86.855087 | 30.506 |
| -86.855164 | 30.506 |
| -86.855164 | 30.506 |
| -86.85524 | 30.506 |
| -86.85524 | 30.506 |
| -86.855309 | 30.506 |
| -86.855309 | 30.506 |
| -86.855309 | 30.506 |
| -86.855377 | 30.506 |
| -86.855377 | 30.506 |
| -86.855377 | 30.506 |
| -86.855469 | 30.506 |
| -86.855469 | 30.506 |
| -86.855545 | 30.506 |
| -86.855591 | 30.506 |
| -86.855591 | 30.506 |
| -86.855659 | 30.506 |
| -86.855659 | 30.506 |
| -86.855751 | 30.506 |
| -86.855751 | 30.506 |
| -86.855797 | 30.506 |
| -86.855797 | 30.506 |
| -86.855858 | 30.506 |
| -86.855858 | 30.506 |
| -86.855949 | 30.506 |
| -86.855949 | 30.506 |
| -86.855957 | 30.506 |
| -86.856026 | 30.506 |
| -86.856026 | 30.506 |
| -86.856087 | 30.506 |
| -86.856087 | 30.506 |
| -86.856163 | 30.506 |
| -86.856163 | 30.506 |
| -86.856239 | 30.506 |
| -86.856239 | 30.506 |
| -86.856239 | 30.506 |
| -86.856346 | 30.506 |
| -86.856346 | 30.506 |
| -86.8564 | 30.506 |
| -86.8564 | 30.506 |
| -86.856461 | 30.506 |
| -86.856461 | 30.506 |
| -86.856522 | 30.506 |
| -86.856522 | 30.506 |
| -86.856598 | 30.506 |
| -86.856598 | 30.506 |
| -86.856705 | 30.506 |
| -86.856705 | 30.506 |
| -86.856743 | 30.506 |
| -86.856743 | 30.506 |
| -86.856827 | 30.506 |
| -86.856827 | 30.506 |
| -86.856888 | 30.506 |
| -86.856888 | 30.506 |
| -86.856964 | 30.506 |
| -86.856964 | 30.506 |
| -86.857025 | 30.506 |
| -86.857025 | 30.506 |
| -86.857086 | 30.506 |
| -86.857086 | 30.506 |
| -86.857162 | 30.506 |
| -86.857162 | 30.506 |
| -86.857246 | 30.506 |
| -86.857246 | 30.506 |
| -86.857262 | 30.506 |
| -86.857338 | 30.506 |
| -86.857399 | 30.506 |
| -86.857399 | 30.506 |
| -86.857399 | 30.506 |
| -86.857475 | 30.506 |
| -86.857475 | 30.506 |
| -86.857536 | 30.506 |
| -86.857597 | 30.506 |
| -86.857597 | 30.506 |
| -86.857658 | 30.506 |
| -86.857658 | 30.506 |
| -86.857658 | 30.506 |
| -86.857735 | 30.506 |
| -86.857735 | 30.506 |
| -86.857796 | 30.506 |
| -86.857796 | 30.506 |
| -86.857857 | 30.506 |
| -86.857864 | 30.506 |
| -86.857933 | 30.506 |
| -86.857933 | 30.506 |
| -86.857933 | 30.506 |
| -86.858025 | 30.506 |
| -86.858025 | 30.506 |
| -86.858078 | 30.506 |
| -86.858078 | 30.506 |
| -86.858162 | 30.506 |
| -86.858162 | 30.506 |
| -86.858231 | 30.506 |
| -86.858231 | 30.506 |
| -86.858292 | 30.506 |
| -86.858292 | 30.506 |
| -86.858368 | 30.506 |
| -86.858368 | 30.506 |
| -86.858437 | 30.506 |
| -86.858437 | 30.506 |
| -86.858482 | 30.506 |
| -86.858543 | 30.506 |
| -86.858543 | 30.506 |
| -86.858559 | 30.506 |
| -86.858559 | 30.506 |
| -86.858589 | 30.506 |
| -86.858589 | 30.506 |
| -86.85862 | 30.506 |
| -86.85862 | 30.506 |
| -86.85862 | 30.506 |
| -86.85862 | 30.506 |
| -86.85862 | 30.506 |
| -86.85862 | 30.506 |
| -86.85862 | 30.505 |
| -86.85862 | 30.505 |
| -86.858589 | 30.505 |
| -86.858574 | 30.505 |
| -86.858574 | 30.505 |
| -86.858574 | 30.505 |
| -86.858543 | 30.505 |
| -86.858543 | 30.505 |
| -86.858528 | 30.505 |
| -86.858528 | 30.505 |
| -86.858513 | 30.505 |
| -86.858513 | 30.505 |
| -86.858498 | 30.505 |
| -86.858498 | 30.505 |
| -86.858498 | 30.505 |
| -86.858498 | 30.505 |
| -86.858498 | 30.505 |
| -86.858498 | 30.505 |
| -86.858498 | 30.505 |
| -86.858498 | 30.505 |
| -86.858513 | 30.505 |
| -86.858513 | 30.505 |
| -86.858528 | 30.505 |
| -86.858528 | 30.505 |
| -86.858528 | 30.505 |
| -86.858528 | 30.505 |
| -86.858543 | 30.505 |
| -86.858543 | 30.505 |
| -86.858543 | 30.505 |
| -86.858559 | 30.505 |
| -86.858559 | 30.505 |
| -86.858559 | 30.505 |
| -86.858574 | 30.505 |
| -86.858574 | 30.505 |
| -86.858574 | 30.505 |
| -86.858559 | 30.505 |
| -86.858559 | 30.505 |
| -86.858543 | 30.504 |
| -86.858543 | 30.504 |
| -86.858543 | 30.504 |
| -86.858543 | 30.504 |
| -86.858528 | 30.504 |
| -86.858528 | 30.504 |
| -86.858528 | 30.504 |
| -86.858528 | 30.504 |
| -86.858528 | 30.504 |
| -86.858528 | 30.504 |
| -86.858528 | 30.504 |
| -86.858528 | 30.504 |
| -86.858513 | 30.504 |
| -86.858513 | 30.504 |
| -86.858513 | 30.504 |
| -86.858513 | 30.504 |
| -86.858513 | 30.504 |
| -86.858513 | 30.504 |
| -86.858498 | 30.504 |
| -86.858498 | 30.504 |
| -86.858498 | 30.504 |
| -86.858498 | 30.504 |
| -86.858498 | 30.504 |
| -86.858482 | 30.504 |
| -86.858482 | 30.504 |
| -86.858482 | 30.504 |
| -86.858482 | 30.504 |
| -86.858482 | 30.504 |
| -86.858482 | 30.504 |
| -86.858482 | 30.504 |
| -86.858482 | 30.504 |
| -86.858482 | 30.504 |
| -86.858482 | 30.504 |
| -86.858482 | 30.504 |
| -86.858482 | 30.504 |
| -86.858482 | 30.504 |
| -86.858482 | 30.504 |
| -86.858498 | 30.503 |
| -86.858498 | 30.503 |
| -86.858513 | 30.503 |
| -86.858528 | 30.503 |
| -86.858528 | 30.503 |
| -86.858528 | 30.503 |
| -86.858528 | 30.503 |
| -86.858528 | 30.503 |
| -86.858543 | 30.503 |
| -86.858543 | 30.503 |
| -86.858559 | 30.503 |
| -86.858559 | 30.503 |
| -86.858574 | 30.503 |
| -86.858574 | 30.503 |
| -86.858574 | 30.503 |
| -86.858574 | 30.503 |
| -86.858574 | 30.503 |
| -86.858574 | 30.503 |
| -86.858574 | 30.503 |
| -86.858574 | 30.503 |
| -86.858574 | 30.503 |
| -86.858574 | 30.503 |
| -86.858574 | 30.503 |
| -86.858574 | 30.503 |
| -86.858574 | 30.503 |
| -86.858559 | 30.503 |
| -86.858559 | 30.503 |
| -86.858559 | 30.503 |
| -86.858559 | 30.503 |
| -86.858543 | 30.503 |
| -86.858543 | 30.503 |
| -86.858528 | 30.503 |
| -86.858528 | 30.503 |
| -86.858513 | 30.502 |
| -86.858513 | 30.502 |
| -86.858459 | 30.502 |
| -86.858459 | 30.502 |
| -86.858421 | 30.502 |
| -86.858421 | 30.502 |
| -86.858376 | 30.502 |
| -86.858376 | 30.502 |
| -86.858269 | 30.502 |
| -86.858269 | 30.502 |
| -86.858269 | 30.502 |
| -86.858154 | 30.502 |
| -86.858154 | 30.502 |
| -86.858101 | 30.502 |
| -86.858101 | 30.502 |
| -86.858017 | 30.502 |
| -86.858017 | 30.502 |
| -86.858017 | 30.502 |
| -86.857895 | 30.502 |
| -86.857895 | 30.502 |
| -86.857826 | 30.502 |
| -86.857826 | 30.502 |
| -86.857719 | 30.502 |
| -86.857719 | 30.502 |
| -86.85759 | 30.502 |
| -86.857567 | 30.502 |
| -86.857498 | 30.502 |
| -86.857498 | 30.502 |
| -86.857498 | 30.502 |
| -86.857407 | 30.502 |
| -86.857407 | 30.502 |
| -86.857315 | 30.502 |
| -86.857315 | 30.502 |
| -86.857224 | 30.502 |
| -86.857224 | 30.502 |
| -86.857086 | 30.502 |
| -86.857086 | 30.502 |
| -86.857033 | 30.502 |
| -86.857033 | 30.502 |
| -86.856941 | 30.502 |
| -86.856941 | 30.502 |
| -86.856842 | 30.502 |
| -86.856842 | 30.502 |
| -86.856758 | 30.502 |
| -86.856758 | 30.502 |
| -86.856705 | 30.502 |
| -86.856705 | 30.502 |
| -86.856606 | 30.502 |
| -86.856606 | 30.502 |
| -86.856552 | 30.502 |
| -86.856552 | 30.502 |
| -86.856438 | 30.502 |
| -86.856438 | 30.502 |
| -86.856361 | 30.502 |
| -86.856361 | 30.502 |
| -86.85627 | 30.502 |
| -86.85627 | 30.502 |
| -86.85627 | 30.502 |
| -86.856194 | 30.502 |
| -86.856194 | 30.502 |
| -86.856194 | 30.502 |
| -86.856117 | 30.502 |
| -86.856117 | 30.502 |
| -86.856041 | 30.502 |
| -86.856041 | 30.502 |
| -86.855949 | 30.502 |
| -86.855949 | 30.502 |
| -86.855873 | 30.502 |
| -86.855873 | 30.502 |
| -86.855774 | 30.502 |
| -86.855751 | 30.502 |
| -86.855751 | 30.502 |
| -86.855698 | 30.502 |
| -86.855698 | 30.502 |
| -86.855583 | 30.502 |
| -86.855583 | 30.502 |
| -86.855507 | 30.502 |
| -86.855507 | 30.502 |
| -86.855431 | 30.502 |
| -86.855431 | 30.502 |
| -86.85537 | 30.502 |
| -86.85537 | 30.502 |
| -86.85527 | 30.502 |
| -86.85527 | 30.502 |
| -86.855141 | 30.502 |
| -86.855141 | 30.502 |
| -86.855087 | 30.502 |
| -86.855087 | 30.502 |
| -86.855011 | 30.502 |
| -86.855011 | 30.502 |
| -86.854912 | 30.502 |
| -86.854912 | 30.502 |
| -86.85482 | 30.502 |
| -86.85482 | 30.502 |
| -86.854744 | 30.502 |
| -86.854744 | 30.502 |
| -86.854652 | 30.502 |
| -86.854652 | 30.502 |
| -86.854561 | 30.502 |
| -86.854561 | 30.502 |
| -86.854485 | 30.502 |
| -86.854485 | 30.502 |
| -86.854393 | 30.502 |
| -86.854393 | 30.502 |
| -86.854393 | 30.502 |
| -86.854317 | 30.502 |
| -86.854317 | 30.502 |
| -86.85424 | 30.502 |
| -86.85424 | 30.502 |
| -86.85424 | 30.502 |
| -86.854141 | 30.502 |
| -86.854073 | 30.502 |
| -86.854073 | 30.502 |
| -86.853996 | 30.502 |
| -86.853996 | 30.502 |
| -86.853897 | 30.502 |
| -86.853897 | 30.502 |
| -86.853897 | 30.502 |
| -86.853821 | 30.502 |
| -86.853821 | 30.502 |
| -86.853821 | 30.502 |
| -86.853706 | 30.502 |
| -86.853706 | 30.502 |
| -86.85363 | 30.502 |
| -86.85363 | 30.502 |
| -86.853554 | 30.502 |
| -86.853554 | 30.502 |
| -86.853462 | 30.502 |
| -86.853462 | 30.502 |
| -86.853386 | 30.502 |
| -86.853386 | 30.502 |
| -86.853294 | 30.502 |
| -86.853294 | 30.502 |
| -86.853203 | 30.502 |
| -86.853203 | 30.502 |
| -86.853104 | 30.502 |
| -86.853104 | 30.502 |
| -86.853012 | 30.502 |
| -86.853012 | 30.502 |
| -86.852898 | 30.502 |
| -86.852898 | 30.502 |
| -86.852806 | 30.502 |
| -86.852806 | 30.502 |
| -86.852715 | 30.502 |
| -86.852715 | 30.502 |
| -86.852623 | 30.502 |
| -86.852623 | 30.502 |
| -86.852531 | 30.502 |
| -86.852531 | 30.502 |
| -86.85244 | 30.502 |
| -86.85244 | 30.502 |
| -86.852348 | 30.502 |
| -86.852348 | 30.502 |
| -86.852257 | 30.502 |
| -86.852257 | 30.502 |
| -86.85218 | 30.502 |
| -86.85218 | 30.502 |
| -86.852104 | 30.502 |
| -86.852104 | 30.502 |
| -86.852013 | 30.502 |
| -86.852013 | 30.502 |
| -86.851921 | 30.502 |
| -86.851921 | 30.502 |
| -86.851921 | 30.502 |
| -86.851921 | 30.502 |
| -86.851822 | 30.502 |
| -86.851822 | 30.502 |
| -86.851753 | 30.502 |
| -86.851753 | 30.502 |
| -86.851616 | 30.502 |
| -86.851616 | 30.502 |
| -86.851547 | 30.502 |
| -86.851547 | 30.502 |
| -86.85141 | 30.502 |
| -86.85141 | 30.502 |
| -86.851341 | 30.502 |
| -86.851341 | 30.502 |
| -86.85125 | 30.502 |
| -86.85125 | 30.502 |
| -86.851143 | 30.502 |
| -86.851143 | 30.502 |
| -86.851028 | 30.502 |
| -86.851028 | 30.502 |
| -86.850922 | 30.502 |
| -86.850922 | 30.502 |
| -86.85083 | 30.502 |
| -86.85083 | 30.502 |
| -86.850723 | 30.502 |
| -86.850723 | 30.502 |
| -86.850632 | 30.502 |
| -86.850632 | 30.502 |
| -86.850502 | 30.502 |
| -86.850502 | 30.502 |
| -86.850502 | 30.502 |
| -86.850426 | 30.502 |
| -86.850426 | 30.502 |
| -86.850334 | 30.502 |
| -86.850334 | 30.502 |
| -86.850334 | 30.502 |
| -86.850258 | 30.502 |
| -86.850258 | 30.502 |
| -86.850166 | 30.502 |
| -86.850075 | 30.502 |
| -86.850075 | 30.502 |
| -86.84996 | 30.502 |
| -86.84996 | 30.502 |
| -86.84996 | 30.502 |
| -86.849907 | 30.502 |
| -86.849907 | 30.502 |
| -86.849907 | 30.502 |
| -86.8498 | 30.502 |
| -86.8498 | 30.502 |
| -86.849663 | 30.502 |
| -86.849663 | 30.502 |
| -86.849594 | 30.502 |
| -86.849594 | 30.502 |
| -86.849487 | 30.502 |
| -86.849487 | 30.502 |
| -86.849396 | 30.502 |
| -86.849396 | 30.502 |
| -86.849281 | 30.502 |
| -86.849281 | 30.502 |
| -86.84919 | 30.502 |
| -86.849098 | 30.502 |
| -86.849098 | 30.502 |
| -86.848991 | 30.502 |
| -86.848991 | 30.502 |
| -86.848892 | 30.502 |
| -86.848892 | 30.502 |
| -86.848892 | 30.502 |
| -86.848892 | 30.502 |
| -86.848778 | 30.502 |
| -86.848778 | 30.502 |
| -86.848709 | 30.502 |
| -86.848709 | 30.502 |
| -86.848579 | 30.502 |
| -86.848579 | 30.502 |
| -86.848488 | 30.502 |
| -86.848488 | 30.502 |
| -86.848488 | 30.502 |
| -86.848373 | 30.502 |
| -86.848373 | 30.502 |
| -86.848305 | 30.502 |
| -86.848305 | 30.502 |
| -86.848213 | 30.502 |
| -86.848213 | 30.502 |
| -86.848122 | 30.502 |
| -86.848122 | 30.502 |
| -86.847984 | 30.502 |
| -86.847984 | 30.502 |
| -86.847931 | 30.502 |
| -86.847931 | 30.502 |
| -86.847839 | 30.502 |
| -86.847839 | 30.502 |
| -86.847778 | 30.502 |
| -86.847778 | 30.502 |
| -86.847672 | 30.502 |
| -86.847672 | 30.502 |
| -86.847626 | 30.502 |
| -86.847618 | 30.502 |
| -86.847542 | 30.502 |
| -86.847542 | 30.502 |
| -86.847542 | 30.502 |
| -86.847458 | 30.502 |
| -86.847458 | 30.502 |
| -86.847374 | 30.502 |
| -86.847374 | 30.502 |
| -86.847298 | 30.502 |
| -86.847298 | 30.502 |
| -86.847244 | 30.502 |
| -86.847244 | 30.502 |
| -86.847168 | 30.502 |
| -86.847168 | 30.502 |
| -86.847061 | 30.502 |
| -86.847061 | 30.502 |
| -86.847061 | 30.502 |
| -86.84697 | 30.502 |
| -86.84687 | 30.502 |
| -86.84687 | 30.502 |
| -86.846794 | 30.502 |
| -86.846794 | 30.502 |
| -86.846718 | 30.502 |
| -86.846718 | 30.502 |
| -86.846642 | 30.502 |
| -86.846642 | 30.502 |
| -86.84655 | 30.502 |
| -86.84655 | 30.502 |
| -86.846458 | 30.502 |
| -86.846458 | 30.502 |
| -86.846458 | 30.502 |
| -86.846382 | 30.502 |
| -86.846359 | 30.502 |
| -86.846306 | 30.502 |
| -86.84623 | 30.502 |
| -86.84623 | 30.502 |
| -86.846138 | 30.502 |
| -86.846138 | 30.502 |
| -86.846062 | 30.502 |
| -86.846062 | 30.502 |
| -86.845985 | 30.502 |
| -86.845985 | 30.502 |
| -86.845886 | 30.503 |
| -86.845886 | 30.503 |
| -86.845779 | 30.503 |
| -86.845779 | 30.503 |
| -86.845726 | 30.503 |
| -86.845726 | 30.503 |
| -86.845634 | 30.503 |
| -86.845634 | 30.503 |
| -86.845535 | 30.503 |
| -86.845535 | 30.503 |
| -86.845497 | 30.503 |
| -86.845497 | 30.503 |
| -86.845428 | 30.503 |
| -86.845428 | 30.503 |
| -86.845352 | 30.503 |
| -86.845352 | 30.503 |
| -86.845261 | 30.503 |
| -86.845261 | 30.503 |
| -86.845184 | 30.503 |
| -86.845184 | 30.503 |
| -86.845108 | 30.503 |
| -86.845108 | 30.503 |
| -86.845032 | 30.503 |
| -86.845032 | 30.503 |
| -86.844955 | 30.503 |
| -86.844955 | 30.503 |
| -86.844955 | 30.503 |
| -86.844872 | 30.503 |
| -86.844872 | 30.503 |
| -86.84478 | 30.503 |
| -86.844765 | 30.503 |
| -86.844719 | 30.503 |
| -86.844719 | 30.503 |
| -86.844597 | 30.503 |
| -86.844521 | 30.503 |
| -86.844521 | 30.503 |
| -86.84446 | 30.503 |
| -86.84446 | 30.503 |
| -86.844383 | 30.503 |
| -86.844383 | 30.503 |
| -86.844307 | 30.503 |
| -86.844307 | 30.503 |
| -86.844307 | 30.503 |
| -86.844231 | 30.503 |
| -86.844208 | 30.503 |
| -86.844116 | 30.503 |
| -86.844116 | 30.503 |
| -86.844017 | 30.503 |
| -86.843964 | 30.503 |
| -86.843964 | 30.503 |
| -86.843964 | 30.503 |
| -86.843872 | 30.503 |
| -86.843872 | 30.503 |
| -86.843796 | 30.503 |
| -86.843796 | 30.503 |
| -86.843704 | 30.503 |
| -86.843704 | 30.503 |
| -86.843628 | 30.503 |
| -86.843628 | 30.503 |
| -86.843552 | 30.503 |
| -86.843529 | 30.503 |
| -86.84346 | 30.503 |
| -86.84346 | 30.503 |
| -86.84346 | 30.503 |
| -86.84346 | 30.503 |
| -86.843369 | 30.503 |
| -86.843369 | 30.503 |
| -86.843369 | 30.503 |
| -86.843246 | 30.503 |
| -86.843246 | 30.503 |
| -86.843193 | 30.503 |
| -86.843193 | 30.503 |
| -86.843117 | 30.503 |
| -86.843117 | 30.503 |
| -86.843018 | 30.503 |
| -86.84301 | 30.503 |
| -86.842911 | 30.503 |
| -86.842834 | 30.503 |
| -86.842834 | 30.503 |
| -86.842758 | 30.503 |
| -86.842758 | 30.503 |
| -86.842667 | 30.503 |
| -86.842667 | 30.503 |
| -86.84259 | 30.503 |
| -86.84259 | 30.503 |
| -86.842499 | 30.503 |
| -86.842491 | 30.503 |
| -86.8424 | 30.503 |
| -86.8424 | 30.503 |
| -86.8424 | 30.503 |
| -86.8424 | 30.503 |
| -86.842323 | 30.503 |
| -86.842323 | 30.503 |
| -86.842232 | 30.503 |
| -86.842232 | 30.503 |
| -86.842155 | 30.504 |
| -86.842155 | 30.504 |
| -86.842064 | 30.504 |
| -86.842064 | 30.504 |
| -86.841988 | 30.504 |
| -86.841988 | 30.504 |
| -86.841896 | 30.504 |
| -86.841896 | 30.504 |
| -86.84182 | 30.504 |
| -86.84182 | 30.504 |
| -86.841728 | 30.504 |
| -86.841728 | 30.504 |
| -86.841637 | 30.504 |
| -86.841637 | 30.504 |
| -86.841614 | 30.504 |
| -86.841545 | 30.504 |
| -86.841545 | 30.504 |
| -86.841454 | 30.504 |
| -86.841454 | 30.504 |
| -86.841362 | 30.504 |
| -86.841362 | 30.504 |
| -86.84127 | 30.504 |
| -86.84127 | 30.504 |
| -86.841156 | 30.504 |
| -86.841156 | 30.504 |
| -86.841064 | 30.504 |
| -86.841064 | 30.504 |
| -86.841064 | 30.504 |
| -86.840973 | 30.504 |
| -86.840973 | 30.504 |
| -86.840881 | 30.504 |
| -86.840881 | 30.504 |
| -86.84079 | 30.504 |
| -86.84079 | 30.504 |
| -86.840714 | 30.504 |
| -86.840714 | 30.504 |
| -86.840637 | 30.504 |
| -86.840637 | 30.504 |
| -86.840553 | 30.504 |
| -86.840553 | 30.504 |
| -86.840454 | 30.504 |
| -86.840454 | 30.504 |
| -86.840385 | 30.504 |
| -86.840385 | 30.504 |
| -86.840324 | 30.504 |
| -86.840324 | 30.504 |
| -86.840256 | 30.504 |
| -86.840256 | 30.504 |
| -86.840187 | 30.504 |
| -86.840187 | 30.504 |
| -86.840096 | 30.504 |
| -86.840096 | 30.504 |
| -86.840096 | 30.504 |
| -86.840096 | 30.504 |
| -86.839966 | 30.504 |
| -86.839966 | 30.504 |
| -86.839874 | 30.504 |
| -86.839851 | 30.504 |
| -86.839783 | 30.504 |
| -86.839783 | 30.504 |
| -86.839783 | 30.504 |
| -86.839691 | 30.504 |
| -86.839691 | 30.504 |
| -86.839592 | 30.504 |
| -86.839592 | 30.504 |
| -86.8395 | 30.504 |
| -86.8395 | 30.504 |
| -86.839424 | 30.504 |
| -86.839424 | 30.504 |
| -86.839348 | 30.504 |
| -86.839348 | 30.504 |
| -86.839287 | 30.504 |
| -86.839287 | 30.504 |
| -86.839195 | 30.504 |
| -86.839195 | 30.504 |
| -86.839119 | 30.504 |
| -86.839119 | 30.504 |
| -86.839096 | 30.504 |
| -86.839043 | 30.504 |
| -86.839043 | 30.504 |
| -86.838951 | 30.504 |
| -86.838951 | 30.504 |
| -86.838875 | 30.504 |
| -86.838852 | 30.505 |
| -86.838783 | 30.505 |
| -86.838783 | 30.505 |
| -86.838783 | 30.505 |
| -86.838669 | 30.505 |
| -86.838669 | 30.505 |
| -86.838577 | 30.505 |
| -86.838577 | 30.505 |
| -86.838486 | 30.505 |
| -86.838486 | 30.505 |
| -86.838387 | 30.505 |
| -86.838387 | 30.505 |
| -86.83831 | 30.505 |
| -86.83831 | 30.505 |
| -86.838219 | 30.505 |
| -86.838219 | 30.505 |
| -86.83812 | 30.505 |
| -86.83812 | 30.505 |
| -86.838066 | 30.505 |
| -86.838066 | 30.505 |
| -86.837975 | 30.505 |
| -86.837975 | 30.505 |
| -86.837891 | 30.505 |
| -86.837891 | 30.505 |
| -86.837814 | 30.505 |
| -86.837814 | 30.505 |
| -86.837715 | 30.505 |
| -86.837715 | 30.505 |
| -86.837654 | 30.505 |
| -86.837654 | 30.505 |
| -86.837654 | 30.505 |
| -86.837563 | 30.505 |
| -86.83754 | 30.505 |
| -86.837486 | 30.505 |
| -86.837486 | 30.505 |
| -86.83741 | 30.505 |
| -86.83741 | 30.505 |
| -86.83741 | 30.505 |
| -86.837273 | 30.505 |
| -86.837273 | 30.505 |
| -86.837219 | 30.505 |
| -86.837219 | 30.505 |
| -86.837143 | 30.505 |
| -86.837067 | 30.505 |
| -86.837067 | 30.505 |
| -86.83699 | 30.505 |
| -86.83699 | 30.505 |
| -86.836967 | 30.505 |
| -86.836899 | 30.505 |
| -86.836899 | 30.505 |
| -86.836899 | 30.505 |
| -86.836823 | 30.505 |
| -86.836723 | 30.505 |
| -86.836723 | 30.505 |
| -86.836632 | 30.505 |
| -86.836632 | 30.505 |
| -86.836555 | 30.505 |
| -86.836555 | 30.505 |
| -86.836464 | 30.505 |
| -86.836464 | 30.505 |
| -86.836464 | 30.505 |
| -86.83638 | 30.505 |
| -86.836357 | 30.505 |
| -86.836288 | 30.505 |
| -86.836288 | 30.505 |
| -86.836288 | 30.505 |
| -86.836189 | 30.505 |
| -86.836189 | 30.505 |
| -86.836151 | 30.505 |
| -86.836151 | 30.505 |
| -86.836075 | 30.505 |
| -86.836075 | 30.505 |
| -86.835991 | 30.505 |
| -86.835991 | 30.505 |
| -86.835915 | 30.505 |
| -86.835915 | 30.505 |
| -86.835823 | 30.505 |
| -86.835823 | 30.505 |
| -86.835716 | 30.505 |
| -86.835716 | 30.505 |
| -86.83564 | 30.505 |
| -86.83564 | 30.505 |
| -86.835564 | 30.505 |
| -86.835564 | 30.505 |
| -86.835564 | 30.505 |
| -86.835426 | 30.505 |
| -86.835396 | 30.505 |
| -86.835396 | 30.505 |
| -86.835396 | 30.505 |
| -86.835281 | 30.505 |
| -86.835281 | 30.505 |
| -86.83519 | 30.506 |
| -86.83519 | 30.506 |
| -86.835098 | 30.506 |
| -86.835098 | 30.506 |
| -86.835007 | 30.506 |
| -86.835007 | 30.506 |
| -86.834892 | 30.506 |
| -86.834892 | 30.506 |
| -86.834869 | 30.506 |
| -86.834869 | 30.506 |
| -86.834816 | 30.506 |
| -86.834816 | 30.506 |
| -86.834702 | 30.506 |
| -86.834702 | 30.506 |
| -86.834633 | 30.506 |
| -86.834633 | 30.506 |
| -86.834557 | 30.506 |
| -86.834557 | 30.506 |
| -86.834488 | 30.506 |
| -86.834488 | 30.506 |
| -86.834427 | 30.506 |
| -86.834427 | 30.506 |
| -86.834351 | 30.506 |
| -86.834351 | 30.506 |
| -86.834259 | 30.506 |
| -86.834259 | 30.506 |
| -86.834175 | 30.506 |
| -86.834053 | 30.506 |
| -86.834053 | 30.506 |
| -86.834053 | 30.506 |
| -86.833977 | 30.506 |
| -86.833977 | 30.506 |
| -86.8339 | 30.506 |
| -86.8339 | 30.506 |
| -86.833809 | 30.506 |
| -86.833786 | 30.506 |
| -86.833717 | 30.506 |
| -86.833717 | 30.506 |
| -86.833626 | 30.506 |
| -86.833626 | 30.506 |
| -86.833626 | 30.506 |
| -86.833496 | 30.506 |
| -86.833496 | 30.506 |
| -86.833359 | 30.506 |
| -86.833359 | 30.506 |
| -86.833328 | 30.506 |
| -86.833328 | 30.506 |
| -86.833237 | 30.506 |
| -86.833237 | 30.506 |
| -86.833145 | 30.506 |
| -86.833145 | 30.506 |
| -86.833031 | 30.506 |
| -86.833031 | 30.506 |
| -86.832962 | 30.506 |
| -86.832962 | 30.506 |
| -86.832848 | 30.506 |
| -86.832848 | 30.506 |
| -86.832756 | 30.506 |
| -86.832756 | 30.506 |
| -86.832664 | 30.506 |
| -86.832664 | 30.506 |
| -86.832588 | 30.506 |
| -86.832588 | 30.506 |
| -86.832588 | 30.506 |
| -86.832497 | 30.506 |
| -86.832497 | 30.506 |
| -86.832405 | 30.506 |
| -86.832405 | 30.506 |
| -86.832291 | 30.506 |
| -86.832291 | 30.506 |
| -86.832199 | 30.506 |
| -86.832199 | 30.506 |
| -86.832108 | 30.506 |
| -86.832108 | 30.506 |
| -86.831993 | 30.506 |
| -86.831993 | 30.506 |
| -86.832008 | 30.506 |
| -86.831917 | 30.506 |
| -86.831917 | 30.506 |
| -86.831917 | 30.506 |
| -86.831787 | 30.506 |
| -86.831787 | 30.506 |
| -86.831696 | 30.506 |
| -86.831696 | 30.506 |
| -86.831619 | 30.506 |
| -86.831619 | 30.506 |
| -86.831528 | 30.506 |
| -86.831528 | 30.506 |
| -86.831436 | 30.506 |
| -86.831436 | 30.506 |
| -86.831345 | 30.506 |
| -86.831345 | 30.506 |
| -86.83123 | 30.506 |
| -86.83123 | 30.506 |
| -86.83123 | 30.506 |
| -86.831139 | 30.507 |
| -86.831139 | 30.507 |
| -86.831047 | 30.507 |
| -86.831047 | 30.507 |
| -86.830948 | 30.507 |
| -86.830948 | 30.507 |
| -86.830879 | 30.507 |
| -86.830879 | 30.507 |
| -86.83078 | 30.507 |
| -86.83078 | 30.507 |
| -86.830688 | 30.507 |
| -86.830688 | 30.507 |
| -86.830612 | 30.507 |
| -86.830612 | 30.507 |
| -86.830536 | 30.507 |
| -86.830536 | 30.507 |
| -86.830444 | 30.507 |
| -86.830444 | 30.507 |
| -86.830368 | 30.507 |
| -86.830368 | 30.507 |
| -86.830276 | 30.507 |
| -86.830276 | 30.507 |
| -86.830177 | 30.507 |
| -86.830177 | 30.507 |
| -86.830177 | 30.507 |
| -86.830086 | 30.507 |
| -86.829994 | 30.507 |
| -86.829994 | 30.507 |
| -86.829994 | 30.507 |
| -86.829918 | 30.507 |
| -86.829895 | 30.507 |
| -86.829826 | 30.507 |
| -86.829826 | 30.507 |
| -86.829735 | 30.507 |
| -86.829735 | 30.507 |
| -86.829735 | 30.507 |
| -86.829636 | 30.507 |
| -86.829636 | 30.507 |
| -86.829544 | 30.507 |
| -86.829544 | 30.507 |
| -86.82943 | 30.507 |
| -86.82943 | 30.507 |
| -86.829361 | 30.507 |
| -86.829361 | 30.507 |
| -86.829262 | 30.507 |
| -86.829262 | 30.507 |
| -86.82917 | 30.507 |
| -86.82917 | 30.507 |
| -86.829079 | 30.507 |
| -86.829079 | 30.507 |
| -86.829079 | 30.507 |
| -86.829002 | 30.507 |
| -86.829002 | 30.507 |
| -86.829002 | 30.507 |
| -86.828911 | 30.507 |
| -86.828911 | 30.507 |
| -86.828796 | 30.507 |
| -86.828796 | 30.507 |
| -86.828728 | 30.507 |
| -86.828728 | 30.507 |
| -86.828613 | 30.507 |
| -86.828613 | 30.507 |
| -86.828545 | 30.507 |
| -86.828545 | 30.507 |
| -86.828445 | 30.507 |
| -86.828445 | 30.507 |
| -86.828354 | 30.507 |
| -86.828354 | 30.507 |
| -86.828262 | 30.507 |
| -86.828262 | 30.507 |
| -86.828148 | 30.507 |
| -86.828148 | 30.507 |
| -86.828056 | 30.507 |
| -86.828056 | 30.507 |
| -86.827965 | 30.508 |
| -86.827965 | 30.508 |
| -86.827873 | 30.508 |
| -86.827873 | 30.508 |
| -86.827782 | 30.508 |
| -86.827782 | 30.508 |
| -86.82769 | 30.508 |
| -86.82769 | 30.508 |
| -86.827599 | 30.508 |
| -86.827599 | 30.508 |
| -86.827522 | 30.508 |
| -86.827522 | 30.508 |
| -86.827507 | 30.508 |
| -86.827415 | 30.508 |
| -86.827415 | 30.508 |
| -86.827309 | 30.508 |
| -86.827286 | 30.508 |
| -86.827217 | 30.508 |
| -86.827217 | 30.508 |
| -86.827103 | 30.508 |
| -86.827103 | 30.508 |
| -86.827011 | 30.508 |
| -86.827011 | 30.508 |
| -86.826897 | 30.508 |
| -86.826897 | 30.508 |
| -86.826828 | 30.508 |
| -86.826828 | 30.508 |
| -86.826714 | 30.508 |
| -86.826714 | 30.508 |
| -86.826637 | 30.508 |
| -86.826637 | 30.508 |
| -86.826523 | 30.508 |
| -86.826523 | 30.508 |
| -86.826469 | 30.508 |
| -86.826469 | 30.508 |
| -86.826378 | 30.508 |
| -86.826378 | 30.508 |
| -86.826302 | 30.508 |
| -86.826302 | 30.508 |
| -86.826202 | 30.508 |
| -86.826202 | 30.508 |
| -86.826088 | 30.508 |
| -86.826088 | 30.508 |
| -86.826012 | 30.508 |
| -86.826012 | 30.508 |
| -86.82592 | 30.508 |
| -86.82592 | 30.508 |
| -86.825844 | 30.508 |
| -86.825844 | 30.508 |
| -86.825768 | 30.508 |
| -86.825768 | 30.508 |
| -86.825676 | 30.508 |
| -86.825676 | 30.508 |
| -86.8256 | 30.508 |
| -86.8256 | 30.508 |
| -86.825523 | 30.508 |
| -86.825523 | 30.508 |
| -86.825432 | 30.508 |
| -86.825432 | 30.508 |
| -86.825432 | 30.508 |
| -86.825356 | 30.508 |
| -86.825356 | 30.508 |
| -86.825279 | 30.508 |
| -86.825256 | 30.508 |
| -86.825188 | 30.508 |
| -86.825188 | 30.508 |
| -86.825188 | 30.508 |
| -86.825089 | 30.508 |
| -86.825089 | 30.508 |
| -86.82502 | 30.508 |
| -86.82502 | 30.508 |
| -86.824898 | 30.508 |
| -86.824898 | 30.508 |
| -86.824829 | 30.508 |
| -86.824829 | 30.508 |
| -86.824753 | 30.508 |
| -86.824753 | 30.508 |
| -86.824615 | 30.508 |
| -86.824615 | 30.508 |
| -86.824547 | 30.508 |
| -86.824547 | 30.508 |
| -86.824455 | 30.508 |
| -86.824455 | 30.508 |
| -86.824364 | 30.508 |
| -86.824364 | 30.508 |
| -86.824242 | 30.508 |
| -86.824242 | 30.508 |
| -86.824173 | 30.508 |
| -86.824173 | 30.508 |
| -86.824081 | 30.508 |
| -86.824081 | 30.508 |
| -86.82399 | 30.508 |
| -86.82399 | 30.508 |
| -86.823875 | 30.508 |
| -86.823875 | 30.508 |
| -86.823807 | 30.509 |
| -86.823807 | 30.509 |
| -86.823715 | 30.509 |
| -86.823715 | 30.509 |
| -86.823586 | 30.509 |
| -86.823586 | 30.509 |
| -86.823494 | 30.509 |
| -86.823494 | 30.509 |
| -86.823418 | 30.509 |
| -86.823418 | 30.509 |
| -86.823311 | 30.509 |
| -86.823311 | 30.509 |
| -86.823288 | 30.509 |
| -86.823219 | 30.509 |
| -86.823219 | 30.509 |
| -86.823219 | 30.509 |
| -86.823128 | 30.509 |
| -86.823128 | 30.509 |
| -86.823029 | 30.509 |
| -86.823029 | 30.509 |
| -86.822937 | 30.509 |
| -86.822845 | 30.509 |
| -86.822845 | 30.509 |
| -86.822823 | 30.509 |
| -86.822823 | 30.509 |
| -86.822746 | 30.509 |
| -86.822746 | 30.509 |
| -86.822655 | 30.509 |
| -86.822655 | 30.509 |
| -86.822563 | 30.509 |
| -86.822563 | 30.509 |
| -86.822472 | 30.509 |
| -86.822472 | 30.509 |
| -86.82238 | 30.509 |
| -86.82238 | 30.509 |
| -86.822281 | 30.509 |
| -86.822281 | 30.509 |
| -86.822189 | 30.509 |
| -86.822189 | 30.509 |
| -86.822113 | 30.509 |
| -86.822021 | 30.509 |
| -86.822021 | 30.509 |
| -86.82193 | 30.509 |
| -86.82193 | 30.509 |
| -86.821854 | 30.509 |
| -86.821854 | 30.509 |
| -86.821739 | 30.509 |
| -86.821739 | 30.509 |
| -86.821663 | 30.509 |
| -86.821663 | 30.509 |
| -86.821571 | 30.509 |
| -86.821571 | 30.509 |
| -86.82148 | 30.509 |
| -86.821457 | 30.509 |
| -86.821404 | 30.509 |
| -86.821404 | 30.509 |
| -86.821312 | 30.509 |
| -86.821289 | 30.509 |
| -86.82122 | 30.509 |
| -86.821144 | 30.509 |
| -86.821144 | 30.509 |
| -86.821144 | 30.509 |
| -86.821053 | 30.509 |
| -86.82103 | 30.509 |
| -86.82103 | 30.509 |
| -86.820961 | 30.509 |
| -86.820961 | 30.509 |
| -86.820824 | 30.509 |
| -86.820824 | 30.509 |
| -86.82074 | 30.509 |
| -86.82074 | 30.509 |
| -86.820648 | 30.509 |
| -86.820648 | 30.509 |
| -86.820557 | 30.509 |
| -86.820557 | 30.509 |
| -86.820442 | 30.509 |
| -86.820442 | 30.509 |
| -86.820351 | 30.509 |
| -86.820351 | 30.509 |
| -86.820259 | 30.509 |
| -86.820259 | 30.509 |
| -86.820145 | 30.509 |
| -86.820145 | 30.509 |
| -86.820145 | 30.509 |
| -86.820099 | 30.509 |
| -86.820099 | 30.509 |
| -86.820099 | 30.509 |
| -86.819984 | 30.509 |
| -86.819984 | 30.509 |
| -86.819962 | 30.509 |
| -86.819962 | 30.509 |
| -86.819901 | 30.509 |
| -86.819901 | 30.509 |
| -86.819832 | 30.509 |
| -86.819817 | 30.509 |
| -86.819817 | 30.509 |
| -86.819809 | 30.51 |
| -86.819809 | 30.51 |
| -86.819771 | 30.51 |
| -86.819771 | 30.51 |
| -86.819771 | 30.51 |
| -86.819725 | 30.51 |
| -86.819725 | 30.51 |
| -86.819725 | 30.51 |
| -86.81974 | 30.51 |
| -86.81974 | 30.51 |
| -86.819771 | 30.51 |
| -86.819771 | 30.51 |
| -86.819801 | 30.51 |
| -86.819801 | 30.51 |
| -86.819847 | 30.51 |
| -86.819847 | 30.51 |
| -86.819847 | 30.51 |
| -86.819847 | 30.51 |
| -86.819923 | 30.51 |
| -86.819923 | 30.51 |
| -86.819977 | 30.51 |
| -86.819977 | 30.51 |
| -86.820076 | 30.511 |
| -86.820076 | 30.511 |
| -86.820168 | 30.511 |
| -86.820168 | 30.511 |
| -86.820168 | 30.511 |
| -86.820259 | 30.511 |
| -86.820259 | 30.511 |
| -86.820351 | 30.511 |
| -86.820351 | 30.511 |
| -86.820465 | 30.511 |
| -86.820465 | 30.511 |
| -86.820534 | 30.511 |
| -86.820534 | 30.511 |
| -86.820648 | 30.511 |
| -86.820648 | 30.511 |
| -86.82074 | 30.511 |
| -86.82074 | 30.511 |
| -86.820831 | 30.511 |
| -86.820831 | 30.511 |
| -86.820892 | 30.511 |
| -86.820892 | 30.511 |
| -86.820961 | 30.511 |
| -86.820961 | 30.511 |
| -86.821022 | 30.511 |
| -86.821022 | 30.511 |
| -86.821114 | 30.511 |
| -86.821114 | 30.511 |
| -86.821175 | 30.511 |
| -86.821175 | 30.511 |
| -86.821236 | 30.511 |
| -86.821236 | 30.511 |
| -86.821236 | 30.511 |
| -86.821342 | 30.511 |
| -86.82135 | 30.511 |
| -86.821404 | 30.511 |
| -86.821404 | 30.511 |
| -86.821404 | 30.511 |
| -86.82148 | 30.51 |
| -86.82148 | 30.51 |
| -86.821518 | 30.51 |
| -86.821518 | 30.51 |
| -86.821579 | 30.51 |
| -86.821579 | 30.51 |
| -86.821625 | 30.51 |
| -86.821625 | 30.51 |
| -86.821686 | 30.51 |
| -86.821686 | 30.51 |
| -86.821709 | 30.51 |
| -86.821709 | 30.51 |
| -86.821754 | 30.51 |
| -86.821754 | 30.51 |
| -86.821785 | 30.51 |
| -86.821785 | 30.51 |
| -86.8218 | 30.51 |
| -86.8218 | 30.51 |
| -86.821815 | 30.51 |
| -86.821815 | 30.51 |
| -86.821831 | 30.51 |
| -86.821831 | 30.51 |
| -86.821831 | 30.51 |
| -86.821831 | 30.51 |
| -86.821831 | 30.51 |
| -86.821831 | 30.51 |
| -86.821831 | 30.51 |
| -86.821815 | 30.51 |
| -86.821815 | 30.51 |
| -86.8218 | 30.51 |
| -86.8218 | 30.51 |
| -86.82177 | 30.509 |
| -86.821739 | 30.509 |
| -86.821739 | 30.509 |
| -86.821739 | 30.509 |
| -86.821701 | 30.509 |
| -86.821701 | 30.509 |
| -86.821701 | 30.509 |
| -86.821655 | 30.509 |
| -86.821655 | 30.509 |
| -86.821609 | 30.509 |
| -86.821609 | 30.509 |
| -86.821564 | 30.509 |
| -86.821564 | 30.509 |
| -86.821495 | 30.509 |
| -86.821495 | 30.509 |
| -86.821449 | 30.509 |
| -86.821449 | 30.509 |
| -86.821388 | 30.509 |
| -86.821388 | 30.509 |
| -86.821312 | 30.509 |
| -86.821312 | 30.509 |
| -86.821236 | 30.509 |
| -86.821236 | 30.509 |
| -86.821182 | 30.509 |
| -86.821182 | 30.509 |
| -86.821098 | 30.509 |
| -86.821098 | 30.509 |
| -86.821045 | 30.509 |
| -86.821045 | 30.509 |
| -86.820984 | 30.509 |
| -86.820984 | 30.509 |
| -86.8209 | 30.509 |
| -86.8209 | 30.509 |
| -86.820808 | 30.509 |
| -86.820808 | 30.509 |
| -86.820808 | 30.509 |
| -86.820702 | 30.509 |
| -86.820702 | 30.509 |
| -86.820702 | 30.509 |
| -86.820625 | 30.509 |
| -86.820625 | 30.509 |
| -86.820549 | 30.509 |
| -86.820549 | 30.509 |
| -86.820457 | 30.509 |
| -86.820457 | 30.509 |
| -86.820358 | 30.509 |
| -86.820358 | 30.509 |
| -86.820267 | 30.509 |
| -86.820267 | 30.509 |
| -86.820267 | 30.509 |
| -86.82019 | 30.509 |
| -86.820183 | 30.509 |
| -86.820183 | 30.509 |
| -86.820129 | 30.509 |
| -86.820129 | 30.509 |
| -86.820053 | 30.509 |
| -86.820053 | 30.509 |
| -86.819984 | 30.509 |
| -86.819984 | 30.509 |
| -86.819923 | 30.509 |
| -86.819923 | 30.509 |
| -86.819923 | 30.509 |
| -86.819923 | 30.509 |
| -86.819855 | 30.509 |
| -86.819855 | 30.509 |
| -86.819801 | 30.509 |
| -86.819801 | 30.509 |
| -86.819786 | 30.509 |
| -86.819786 | 30.509 |
| -86.819756 | 30.51 |
| -86.819756 | 30.51 |
| -86.819725 | 30.51 |
| -86.819695 | 30.51 |
| -86.819695 | 30.51 |
| -86.819695 | 30.51 |
| -86.819695 | 30.51 |
| -86.819679 | 30.51 |
| -86.819679 | 30.51 |
| -86.819695 | 30.51 |
| -86.819695 | 30.51 |
| -86.819695 | 30.51 |
| -86.819695 | 30.51 |
| -86.819725 | 30.51 |
| -86.819725 | 30.51 |
| -86.819756 | 30.51 |
| -86.819756 | 30.51 |
| -86.819809 | 30.51 |
| -86.819809 | 30.51 |
| -86.819855 | 30.51 |
| -86.819855 | 30.51 |
| -86.819908 | 30.51 |
| -86.819908 | 30.51 |
| -86.819984 | 30.51 |
| -86.819984 | 30.51 |
| -86.820038 | 30.511 |
| -86.820038 | 30.511 |
| -86.820099 | 30.511 |
| -86.820099 | 30.511 |
| -86.820183 | 30.511 |
| -86.820183 | 30.511 |
| -86.820251 | 30.511 |
| -86.820251 | 30.511 |
| -86.820313 | 30.511 |
| -86.820313 | 30.511 |
| -86.820396 | 30.511 |
| -86.820396 | 30.511 |
| -86.820465 | 30.511 |
| -86.820465 | 30.511 |
| -86.820549 | 30.511 |
| -86.820549 | 30.511 |
| -86.82061 | 30.511 |
| -86.82061 | 30.511 |
| -86.820656 | 30.511 |
| -86.820656 | 30.511 |
| -86.820717 | 30.511 |
| -86.820717 | 30.511 |
| -86.820717 | 30.511 |
| -86.820717 | 30.511 |
| -86.820763 | 30.51 |
| -86.820763 | 30.51 |
| -86.820793 | 30.51 |
| -86.820824 | 30.51 |
| -86.820824 | 30.51 |
| -86.820824 | 30.51 |
| -86.820854 | 30.51 |
| -86.820854 | 30.51 |
| -86.82093 | 30.51 |
| -86.82093 | 30.51 |
| -86.82093 | 30.51 |
| -86.820961 | 30.51 |
| -86.820961 | 30.51 |
| -86.821007 | 30.51 |
| -86.821007 | 30.51 |
| -86.821037 | 30.51 |
| -86.821083 | 30.51 |
| -86.821083 | 30.51 |
| -86.821083 | 30.51 |
| -86.821129 | 30.51 |
| -86.821129 | 30.51 |
| -86.821175 | 30.51 |
| -86.821175 | 30.51 |
| -86.821205 | 30.51 |
| -86.821205 | 30.51 |
| -86.821205 | 30.51 |
| -86.821266 | 30.51 |
| -86.821266 | 30.51 |
| -86.821304 | 30.51 |
| -86.821304 | 30.51 |
| -86.821373 | 30.51 |
| -86.821419 | 30.51 |
| -86.821419 | 30.51 |
| -86.821487 | 30.51 |
| -86.821487 | 30.51 |
| -86.821533 | 30.51 |
| -86.821533 | 30.51 |
| -86.821594 | 30.51 |
| -86.821594 | 30.51 |
| -86.821594 | 30.51 |
| -86.821655 | 30.51 |
| -86.821663 | 30.51 |
| -86.821701 | 30.51 |
| -86.821785 | 30.51 |
| -86.821785 | 30.51 |
| -86.821785 | 30.51 |
| -86.821846 | 30.51 |
| -86.821877 | 30.51 |
| -86.821907 | 30.51 |
| -86.821907 | 30.51 |
| -86.821907 | 30.51 |
| -86.821999 | 30.51 |
| -86.821999 | 30.51 |
| -86.822075 | 30.51 |
| -86.822075 | 30.51 |
| -86.822136 | 30.509 |
| -86.822144 | 30.509 |
| -86.822144 | 30.509 |
| -86.82222 | 30.509 |
| -86.82222 | 30.509 |
| -86.822281 | 30.509 |
| -86.822281 | 30.509 |
| -86.822357 | 30.509 |
| -86.822357 | 30.509 |
| -86.822426 | 30.509 |
| -86.822426 | 30.509 |
| -86.822495 | 30.509 |
| -86.822495 | 30.509 |
| -86.822556 | 30.509 |
| -86.822563 | 30.509 |
| -86.822639 | 30.509 |
| -86.822639 | 30.509 |
| -86.822639 | 30.509 |
| -86.822716 | 30.509 |
| -86.822716 | 30.509 |
| -86.822777 | 30.509 |
| -86.822777 | 30.509 |
| -86.822853 | 30.509 |
| -86.822853 | 30.509 |
| -86.822929 | 30.509 |
| -86.822929 | 30.509 |
| -86.82299 | 30.509 |
| -86.82299 | 30.509 |
| -86.823074 | 30.509 |
| -86.823074 | 30.509 |
| -86.823151 | 30.509 |
| -86.823151 | 30.509 |
| -86.823212 | 30.509 |
| -86.823212 | 30.509 |
| -86.823273 | 30.509 |
| -86.823273 | 30.509 |
| -86.823273 | 30.509 |
| -86.823349 | 30.509 |
| -86.823387 | 30.509 |
| -86.823418 | 30.509 |
| -86.823418 | 30.509 |
| -86.823494 | 30.509 |
| -86.823494 | 30.509 |
| -86.823555 | 30.509 |
| -86.823555 | 30.509 |
| -86.823631 | 30.509 |
| -86.823631 | 30.509 |
| -86.823723 | 30.509 |
| -86.82373 | 30.509 |
| -86.823784 | 30.509 |
| -86.823784 | 30.509 |
| -86.82386 | 30.509 |
| -86.82386 | 30.509 |
| -86.823921 | 30.509 |
| -86.823921 | 30.509 |
| -86.823921 | 30.509 |
| -86.823982 | 30.509 |
| -86.823982 | 30.509 |
| -86.824059 | 30.509 |
| -86.824059 | 30.509 |
| -86.82412 | 30.509 |
| -86.82412 | 30.509 |
| -86.824188 | 30.509 |
| -86.824188 | 30.509 |
| -86.824249 | 30.509 |
| -86.824249 | 30.509 |
| -86.82431 | 30.509 |
| -86.82431 | 30.509 |
| -86.824371 | 30.509 |
| -86.824371 | 30.509 |
| -86.824448 | 30.509 |
| -86.824448 | 30.509 |
| -86.824501 | 30.509 |
| -86.824501 | 30.509 |
| -86.82457 | 30.509 |
| -86.82457 | 30.509 |
| -86.824631 | 30.509 |
| -86.824631 | 30.509 |
| -86.824692 | 30.509 |
| -86.824692 | 30.509 |
| -86.824753 | 30.509 |
| -86.824753 | 30.509 |
| -86.824829 | 30.509 |
| -86.824829 | 30.509 |
| -86.824829 | 30.509 |
| -86.824875 | 30.509 |
| -86.824875 | 30.509 |
| -86.824951 | 30.509 |
| -86.824951 | 30.509 |
| -86.825081 | 30.509 |
| -86.825081 | 30.509 |
| -86.825127 | 30.509 |
| -86.825157 | 30.509 |
| -86.825188 | 30.509 |
| -86.825188 | 30.509 |
| -86.825218 | 30.509 |
| -86.825218 | 30.509 |
| -86.825218 | 30.509 |
| -86.825218 | 30.509 |
| -86.825256 | 30.509 |
| -86.825256 | 30.509 |
| -86.825294 | 30.509 |
| -86.825294 | 30.509 |
| -86.825325 | 30.509 |
| -86.825325 | 30.509 |
| -86.82534 | 30.509 |
| -86.82534 | 30.509 |
| -86.82534 | 30.509 |
| -86.82534 | 30.509 |
| -86.82534 | 30.509 |
| -86.82534 | 30.509 |
| -86.82534 | 30.509 |
| -86.82534 | 30.509 |
| -86.82534 | 30.509 |
| -86.82534 | 30.509 |
| -86.82534 | 30.509 |
| -86.82534 | 30.509 |
| -86.82534 | 30.509 |
| -86.82534 | 30.509 |
| -86.82534 | 30.509 |
| -86.82534 | 30.509 |
| -86.82534 | 30.509 |
| -86.82534 | 30.509 |
| -86.82534 | 30.509 |
| -86.82534 | 30.509 |
| -86.82534 | 30.509 |
| -86.82534 | 30.509 |
| -86.82534 | 30.509 |
| -86.82534 | 30.509 |
| -86.82534 | 30.509 |
| -86.82534 | 30.509 |
| -86.82534 | 30.509 |
| -86.82534 | 30.509 |
| -86.82534 | 30.509 |
| -86.82534 | 30.509 |
| -86.82534 | 30.509 |
| -86.82534 | 30.509 |
| -86.82534 | 30.509 |
| -86.82534 | 30.509 |
| -86.82534 | 30.509 |
| -86.82534 | 30.509 |
| -86.82534 | 30.509 |
| -86.82534 | 30.509 |
| -86.82534 | 30.509 |
| -86.82534 | 30.509 |
| -86.82534 | 30.509 |
| -86.82534 | 30.509 |
| -86.82534 | 30.509 |
| -86.82534 | 30.509 |
| -86.82534 | 30.509 |
| -86.82534 | 30.509 |
| -86.82534 | 30.509 |
| -86.82534 | 30.509 |
| -86.82534 | 30.509 |
| -86.82534 | 30.509 |
| -86.82534 | 30.509 |